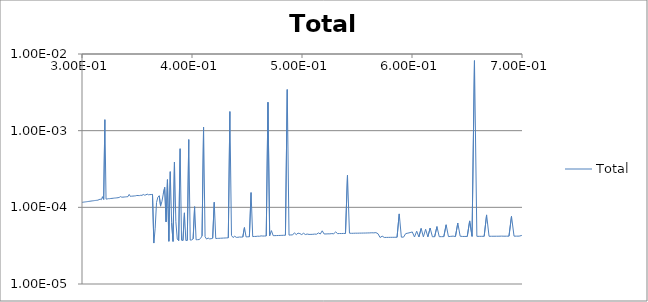
| Category | Total |
|---|---|
| 29929300.0 | 0 |
| 29829700.0 | 0 |
| 29730400.0 | 0 |
| 29631500.0 | 0 |
| 29532900.0 | 0 |
| 29434700.0 | 0 |
| 29336700.0 | 0 |
| 29239100.0 | 0 |
| 29141800.0 | 0 |
| 29044800.0 | 0 |
| 28948200.0 | 0 |
| 28851900.0 | 0 |
| 28755900.0 | 0 |
| 28660200.0 | 0 |
| 28564800.0 | 0 |
| 28469800.0 | 0 |
| 28375000.0 | 0 |
| 28280600.0 | 0 |
| 28186500.0 | 0 |
| 28092700.0 | 0 |
| 27999300.0 | 0 |
| 27906100.0 | 0 |
| 27813200.0 | 0 |
| 27720700.0 | 0 |
| 27628500.0 | 0 |
| 27536500.0 | 0 |
| 27444900.0 | 0 |
| 27353600.0 | 0 |
| 27262600.0 | 0 |
| 27171800.0 | 0 |
| 27081400.0 | 0 |
| 26991300.0 | 0 |
| 26901500.0 | 0 |
| 26812000.0 | 0 |
| 26722800.0 | 0 |
| 26633900.0 | 0 |
| 26545200.0 | 0 |
| 26456900.0 | 0 |
| 26368900.0 | 0 |
| 26281100.0 | 0 |
| 26193700.0 | 0 |
| 26106500.0 | 0 |
| 26019700.0 | 0 |
| 25933100.0 | 0 |
| 25846800.0 | 0 |
| 25760800.0 | 0 |
| 25675100.0 | 0 |
| 25589600.0 | 0 |
| 25504500.0 | 0 |
| 25419600.0 | 0 |
| 25335100.0 | 0 |
| 25250800.0 | 0 |
| 25166700.0 | 0 |
| 25083000.0 | 0 |
| 24999500.0 | 0 |
| 24916300.0 | 0 |
| 24833400.0 | 0 |
| 24750800.0 | 0 |
| 24668500.0 | 0 |
| 24586400.0 | 0 |
| 24504600.0 | 0 |
| 24423000.0 | 0 |
| 24341800.0 | 0 |
| 24260800.0 | 0 |
| 24180000.0 | 0 |
| 24099600.0 | 0 |
| 24019400.0 | 0 |
| 23939500.0 | 0 |
| 23859800.0 | 0 |
| 23780400.0 | 0 |
| 23701300.0 | 0 |
| 23622400.0 | 0 |
| 23543800.0 | 0 |
| 23465500.0 | 0 |
| 23387400.0 | 0 |
| 23309600.0 | 0 |
| 23232000.0 | 0 |
| 23154700.0 | 0 |
| 23077700.0 | 0 |
| 23000900.0 | 0 |
| 22924400.0 | 0 |
| 22848100.0 | 0 |
| 22772000.0 | 0 |
| 22696300.0 | 0 |
| 22620800.0 | 0 |
| 22545500.0 | 0 |
| 22470500.0 | 0 |
| 22395700.0 | 0 |
| 22321200.0 | 0 |
| 22246900.0 | 0 |
| 22172900.0 | 0 |
| 22099100.0 | 0 |
| 22025600.0 | 0 |
| 21952300.0 | 0 |
| 21879200.0 | 0 |
| 21806400.0 | 0 |
| 21733900.0 | 0 |
| 21661600.0 | 0 |
| 21589500.0 | 0 |
| 21517600.0 | 0 |
| 21446000.0 | 0 |
| 21374700.0 | 0 |
| 21303600.0 | 0 |
| 21232700.0 | 0 |
| 21162000.0 | 0 |
| 21091600.0 | 0 |
| 21021400.0 | 0 |
| 20951500.0 | 0 |
| 20881800.0 | 0 |
| 20812300.0 | 0 |
| 20743000.0 | 0 |
| 20674000.0 | 0 |
| 20605200.0 | 0 |
| 20536700.0 | 0 |
| 20468300.0 | 0 |
| 20400200.0 | 0 |
| 20332300.0 | 0 |
| 20264700.0 | 0 |
| 20197300.0 | 0 |
| 20130100.0 | 0 |
| 20063100.0 | 0 |
| 19996300.0 | 0 |
| 19929800.0 | 0 |
| 19863500.0 | 0 |
| 19797400.0 | 0 |
| 19731500.0 | 0 |
| 19665800.0 | 0 |
| 19600400.0 | 0 |
| 19535200.0 | 0 |
| 19470200.0 | 0 |
| 19405400.0 | 0 |
| 19340800.0 | 0 |
| 19276500.0 | 0 |
| 19212300.0 | 0 |
| 19148400.0 | 0 |
| 19084700.0 | 0 |
| 19021200.0 | 0 |
| 18957900.0 | 0 |
| 18894800.0 | 0 |
| 18831900.0 | 0 |
| 18769300.0 | 0 |
| 18706800.0 | 0 |
| 18644600.0 | 0 |
| 18582500.0 | 0 |
| 18520700.0 | 0 |
| 18459100.0 | 0 |
| 18397700.0 | 0 |
| 18336400.0 | 0 |
| 18275400.0 | 0 |
| 18214600.0 | 0 |
| 18154000.0 | 0 |
| 18093600.0 | 0 |
| 18033400.0 | 0 |
| 17973400.0 | 0 |
| 17913600.0 | 0 |
| 17854000.0 | 0 |
| 17794600.0 | 0 |
| 17735400.0 | 0 |
| 17676400.0 | 0 |
| 17617500.0 | 0 |
| 17558900.0 | 0 |
| 17500500.0 | 0 |
| 17442300.0 | 0 |
| 17384200.0 | 0 |
| 17326400.0 | 0 |
| 17268700.0 | 0 |
| 17211300.0 | 0 |
| 17154000.0 | 0 |
| 17096900.0 | 0 |
| 17040000.0 | 0 |
| 16983300.0 | 0 |
| 16926800.0 | 0 |
| 16870500.0 | 0 |
| 16814400.0 | 0 |
| 16758400.0 | 0 |
| 16702700.0 | 0 |
| 16647100.0 | 0 |
| 16591700.0 | 0 |
| 16536500.0 | 0 |
| 16481500.0 | 0 |
| 16426600.0 | 0 |
| 16372000.0 | 0 |
| 16317500.0 | 0 |
| 16263200.0 | 0 |
| 16209100.0 | 0 |
| 16155100.0 | 0 |
| 16101400.0 | 0 |
| 16047800.0 | 0 |
| 15994400.0 | 0 |
| 15941200.0 | 0 |
| 15888100.0 | 0 |
| 15835300.0 | 0 |
| 15782600.0 | 0 |
| 15730100.0 | 0 |
| 15677700.0 | 0 |
| 15625600.0 | 0 |
| 15573600.0 | 0 |
| 15521700.0 | 0 |
| 15470100.0 | 0 |
| 15418600.0 | 0 |
| 15367300.0 | 0 |
| 15316200.0 | 0 |
| 15265200.0 | 0 |
| 15214400.0 | 0 |
| 15163800.0 | 0 |
| 15113300.0 | 0 |
| 15063100.0 | 0 |
| 15012900.0 | 0 |
| 14963000.0 | 0 |
| 14913200.0 | 0 |
| 14863600.0 | 0 |
| 14814100.0 | 0 |
| 14764800.0 | 0 |
| 14715700.0 | 0 |
| 14666700.0 | 0 |
| 14617900.0 | 0 |
| 14569300.0 | 0 |
| 14520800.0 | 0 |
| 14472500.0 | 0 |
| 14424300.0 | 0 |
| 14376300.0 | 0 |
| 14328500.0 | 0 |
| 14280800.0 | 0 |
| 14233300.0 | 0 |
| 14185900.0 | 0 |
| 14138700.0 | 0 |
| 14091700.0 | 0 |
| 14044800.0 | 0 |
| 13998100.0 | 0 |
| 13951500.0 | 0 |
| 13905100.0 | 0 |
| 13858800.0 | 0 |
| 13812700.0 | 0 |
| 13766700.0 | 0 |
| 13720900.0 | 0 |
| 13675300.0 | 0 |
| 13629800.0 | 0 |
| 13584400.0 | 0 |
| 13539200.0 | 0 |
| 13494200.0 | 0 |
| 13449300.0 | 0 |
| 13404500.0 | 0 |
| 13359900.0 | 0 |
| 13315500.0 | 0 |
| 13271200.0 | 0 |
| 13227000.0 | 0 |
| 13183000.0 | 0 |
| 13139100.0 | 0 |
| 13095400.0 | 0 |
| 13051800.0 | 0 |
| 13008400.0 | 0 |
| 12965100.0 | 0 |
| 12922000.0 | 0 |
| 12879000.0 | 0 |
| 12836100.0 | 0 |
| 12793400.0 | 0 |
| 12750800.0 | 0 |
| 12708400.0 | 0 |
| 12666100.0 | 0 |
| 12624000.0 | 0 |
| 12582000.0 | 0 |
| 12540100.0 | 0 |
| 12498400.0 | 0 |
| 12456800.0 | 0 |
| 12415300.0 | 0 |
| 12374000.0 | 0 |
| 12332900.0 | 0 |
| 12291800.0 | 0 |
| 12250900.0 | 0 |
| 12210200.0 | 0 |
| 12169500.0 | 0 |
| 12129000.0 | 0 |
| 12088700.0 | 0 |
| 12048500.0 | 0 |
| 12008400.0 | 0 |
| 11968400.0 | 0 |
| 11928600.0 | 0 |
| 11888900.0 | 0 |
| 11849300.0 | 0 |
| 11809900.0 | 0 |
| 11770600.0 | 0 |
| 11731400.0 | 0 |
| 11692400.0 | 0 |
| 11653500.0 | 0 |
| 11614700.0 | 0 |
| 11576100.0 | 0 |
| 11537600.0 | 0 |
| 11499200.0 | 0 |
| 11460900.0 | 0 |
| 11422800.0 | 0 |
| 11384800.0 | 0 |
| 11346900.0 | 0 |
| 11309100.0 | 0 |
| 11271500.0 | 0 |
| 11234000.0 | 0 |
| 11196600.0 | 0 |
| 11159400.0 | 0 |
| 11122200.0 | 0 |
| 11085200.0 | 0 |
| 11048300.0 | 0 |
| 11011600.0 | 0 |
| 10974900.0 | 0 |
| 10938400.0 | 0 |
| 10902000.0 | 0 |
| 10865700.0 | 0 |
| 10829600.0 | 0 |
| 10793500.0 | 0 |
| 10757600.0 | 0 |
| 10721800.0 | 0 |
| 10686200.0 | 0 |
| 10650600.0 | 0 |
| 10615200.0 | 0 |
| 10579800.0 | 0 |
| 10544600.0 | 0 |
| 10509600.0 | 0 |
| 10474600.0 | 0 |
| 10439700.0 | 0 |
| 10405000.0 | 0 |
| 10370400.0 | 0 |
| 10335900.0 | 0 |
| 10301500.0 | 0 |
| 10267200.0 | 0 |
| 10233000.0 | 0 |
| 10199000.0 | 0 |
| 10165000.0 | 0 |
| 10131200.0 | 0 |
| 10097500.0 | 0 |
| 10063900.0 | 0 |
| 10030400.0 | 0 |
| 9997050.0 | 0 |
| 9963790.0 | 0 |
| 9930630.0 | 0 |
| 9897590.0 | 0 |
| 9864650.0 | 0 |
| 9831830.0 | 0 |
| 9799120.0 | 0 |
| 9766510.0 | 0 |
| 9734010.0 | 0 |
| 9701620.0 | 0 |
| 9669340.0 | 0 |
| 9637170.0 | 0 |
| 9605100.0 | 0 |
| 9573140.0 | 0 |
| 9541290.0 | 0 |
| 9509540.0 | 0 |
| 9477900.0 | 0 |
| 9446360.0 | 0 |
| 9414930.0 | 0 |
| 9383600.0 | 0 |
| 9352380.0 | 0 |
| 9321260.0 | 0 |
| 9290240.0 | 0 |
| 9259330.0 | 0 |
| 9228520.0 | 0 |
| 9197810.0 | 0 |
| 9167210.0 | 0 |
| 9136700.0 | 0 |
| 9106300.0 | 0 |
| 9076000.0 | 0 |
| 9045800.0 | 0 |
| 9015700.0 | 0 |
| 8985700.0 | 0 |
| 8955810.0 | 0 |
| 8926010.0 | 0 |
| 8896300.0 | 0 |
| 8866700.0 | 0 |
| 8837200.0 | 0 |
| 8807790.0 | 0 |
| 8778490.0 | 0 |
| 8749280.0 | 0 |
| 8720160.0 | 0 |
| 8691150.0 | 0 |
| 8662230.0 | 0 |
| 8633410.0 | 0 |
| 8604680.0 | 0 |
| 8576050.0 | 0 |
| 8547510.0 | 0 |
| 8519070.0 | 0 |
| 8490720.0 | 0 |
| 8462470.0 | 0 |
| 8434310.0 | 0 |
| 8406250.0 | 0 |
| 8378280.0 | 0 |
| 8350400.0 | 0 |
| 8322620.0 | 0 |
| 8294920.0 | 0 |
| 8267320.0 | 0 |
| 8239810.0 | 0 |
| 8212400.0 | 0 |
| 8185070.0 | 0 |
| 8157830.0 | 0 |
| 8130690.0 | 0 |
| 8103640.0 | 0 |
| 8076670.0 | 0 |
| 8049800.0 | 0 |
| 8023010.0 | 0 |
| 7996320.0 | 0 |
| 7969710.0 | 0 |
| 7943190.0 | 0 |
| 7916760.0 | 0 |
| 7890420.0 | 0 |
| 7864160.0 | 0 |
| 7838000.0 | 0 |
| 7811910.0 | 0 |
| 7785920.0 | 0 |
| 7760010.0 | 0 |
| 7734190.0 | 0 |
| 7708460.0 | 0 |
| 7682810.0 | 0 |
| 7657250.0 | 0 |
| 7631770.0 | 0 |
| 7606370.0 | 0 |
| 7581060.0 | 0 |
| 7555840.0 | 0 |
| 7530700.0 | 0 |
| 7505640.0 | 0 |
| 7480660.0 | 0 |
| 7455770.0 | 0 |
| 7430960.0 | 0 |
| 7406240.0 | 0 |
| 7381590.0 | 0 |
| 7357030.0 | 0 |
| 7332550.0 | 0 |
| 7308150.0 | 0 |
| 7283840.0 | 0 |
| 7259600.0 | 0 |
| 7235440.0 | 0 |
| 7211370.0 | 0 |
| 7187370.0 | 0 |
| 7163460.0 | 0 |
| 7139620.0 | 0 |
| 7115870.0 | 0 |
| 7092190.0 | 0 |
| 7068590.0 | 0 |
| 7045070.0 | 0 |
| 7021630.0 | 0 |
| 6998260.0 | 0 |
| 6974980.0 | 0 |
| 6951770.0 | 0 |
| 6928640.0 | 0 |
| 6905580.0 | 0 |
| 6882600.0 | 0 |
| 6859700.0 | 0 |
| 6836880.0 | 0 |
| 6814130.0 | 0 |
| 6791460.0 | 0 |
| 6768860.0 | 0 |
| 6746330.0 | 0 |
| 6723890.0 | 0 |
| 6701510.0 | 0 |
| 6679220.0 | 0 |
| 6656990.0 | 0 |
| 6634840.0 | 0 |
| 6612760.0 | 0 |
| 6590760.0 | 0 |
| 6568830.0 | 0 |
| 6546970.0 | 0 |
| 6525190.0 | 0 |
| 6503480.0 | 0 |
| 6481840.0 | 0 |
| 6460270.0 | 0 |
| 6438770.0 | 0 |
| 6417350.0 | 0 |
| 6395990.0 | 0 |
| 6374710.0 | 0 |
| 6353500.0 | 0 |
| 6332360.0 | 0 |
| 6311290.0 | 0 |
| 6290290.0 | 0 |
| 6269360.0 | 0 |
| 6248500.0 | 0 |
| 6227710.0 | 0 |
| 6206980.0 | 0 |
| 6186330.0 | 0 |
| 6165750.0 | 0 |
| 6145230.0 | 0 |
| 6124780.0 | 0 |
| 6104400.0 | 0 |
| 6084090.0 | 0 |
| 6063850.0 | 0 |
| 6043670.0 | 0 |
| 6023560.0 | 0 |
| 6003520.0 | 0 |
| 5983540.0 | 0 |
| 5963630.0 | 0 |
| 5943790.0 | 0 |
| 5924010.0 | 0 |
| 5904300.0 | 0 |
| 5884650.0 | 0 |
| 5865070.0 | 0 |
| 5845560.0 | 0 |
| 5826100.0 | 0 |
| 5806720.0 | 0 |
| 5787400.0 | 0 |
| 5768140.0 | 0 |
| 5748950.0 | 0 |
| 5729820.0 | 0 |
| 5710750.0 | 0 |
| 5691750.0 | 0 |
| 5672810.0 | 0 |
| 5653940.0 | 0 |
| 5635120.0 | 0 |
| 5616370.0 | 0 |
| 5597680.0 | 0 |
| 5579060.0 | 0 |
| 5560490.0 | 0 |
| 5541990.0 | 0 |
| 5523550.0 | 0 |
| 5505170.0 | 0 |
| 5486850.0 | 0 |
| 5468600.0 | 0 |
| 5450400.0 | 0 |
| 5432270.0 | 0 |
| 5414190.0 | 0 |
| 5396180.0 | 0 |
| 5378220.0 | 0 |
| 5360320.0 | 0 |
| 5342490.0 | 0 |
| 5324710.0 | 0 |
| 5306990.0 | 0 |
| 5289340.0 | 0 |
| 5271730.0 | 0 |
| 5254190.0 | 0 |
| 5236710.0 | 0 |
| 5219290.0 | 0 |
| 5201920.0 | 0 |
| 5184610.0 | 0 |
| 5167360.0 | 0 |
| 5150170.0 | 0 |
| 5133030.0 | 0 |
| 5115950.0 | 0 |
| 5098930.0 | 0 |
| 5081960.0 | 0 |
| 5065050.0 | 0 |
| 5048200.0 | 0 |
| 5031400.0 | 0 |
| 5014660.0 | 0 |
| 4997970.0 | 0 |
| 4981340.0 | 0 |
| 4964770.0 | 0 |
| 4948250.0 | 0 |
| 4931780.0 | 0 |
| 4915370.0 | 0 |
| 4899010.0 | 0 |
| 4882710.0 | 0 |
| 4866470.0 | 0 |
| 4850270.0 | 0 |
| 4834140.0 | 0 |
| 4818050.0 | 0 |
| 4802020.0 | 0 |
| 4786040.0 | 0 |
| 4770120.0 | 0 |
| 4754240.0 | 0 |
| 4738420.0 | 0 |
| 4722660.0 | 0 |
| 4706940.0 | 0 |
| 4691280.0 | 0 |
| 4675670.0 | 0 |
| 4660110.0 | 0 |
| 4644610.0 | 0 |
| 4629150.0 | 0 |
| 4613750.0 | 0 |
| 4598400.0 | 0 |
| 4583100.0 | 0 |
| 4567850.0 | 0 |
| 4552650.0 | 0 |
| 4537500.0 | 0 |
| 4522400.0 | 0 |
| 4507350.0 | 0 |
| 4492350.0 | 0 |
| 4477410.0 | 0 |
| 4462510.0 | 0 |
| 4447660.0 | 0 |
| 4432860.0 | 0 |
| 4418110.0 | 0 |
| 4403410.0 | 0 |
| 4388760.0 | 0 |
| 4374150.0 | 0 |
| 4359600.0 | 0 |
| 4345090.0 | 0 |
| 4330640.0 | 0 |
| 4316230.0 | 0 |
| 4301860.0 | 0 |
| 4287550.0 | 0 |
| 4273280.0 | 0 |
| 4259060.0 | 0 |
| 4244890.0 | 0 |
| 4230770.0 | 0 |
| 4216690.0 | 0 |
| 4202660.0 | 0 |
| 4188680.0 | 0 |
| 4174740.0 | 0 |
| 4160850.0 | 0 |
| 4147000.0 | 0 |
| 4133200.0 | 0 |
| 4119450.0 | 0 |
| 4105740.0 | 0 |
| 4092080.0 | 0 |
| 4078470.0 | 0 |
| 4064890.0 | 0 |
| 4051370.0 | 0 |
| 4037890.0 | 0 |
| 4024450.0 | 0 |
| 4011060.0 | 0 |
| 3997720.0 | 0 |
| 3984410.0 | 0 |
| 3971160.0 | 0 |
| 3957940.0 | 0 |
| 3944770.0 | 0 |
| 3931650.0 | 0 |
| 3918560.0 | 0 |
| 3905520.0 | 0 |
| 3892530.0 | 0 |
| 3879580.0 | 0 |
| 3866670.0 | 0 |
| 3853800.0 | 0 |
| 3840980.0 | 0 |
| 3828200.0 | 0 |
| 3815460.0 | 0 |
| 3802760.0 | 0 |
| 3790110.0 | 0 |
| 3777500.0 | 0 |
| 3764930.0 | 0 |
| 3752400.0 | 0 |
| 3739920.0 | 0 |
| 3727470.0 | 0 |
| 3715070.0 | 0 |
| 3702710.0 | 0 |
| 3690390.0 | 0 |
| 3678110.0 | 0 |
| 3665870.0 | 0 |
| 3653670.0 | 0 |
| 3641510.0 | 0 |
| 3629400.0 | 0 |
| 3617320.0 | 0 |
| 3605290.0 | 0 |
| 3593290.0 | 0 |
| 3581330.0 | 0 |
| 3569420.0 | 0 |
| 3557540.0 | 0 |
| 3545700.0 | 0 |
| 3533900.0 | 0 |
| 3522140.0 | 0 |
| 3510420.0 | 0 |
| 3498740.0 | 0 |
| 3487100.0 | 0 |
| 3475500.0 | 0 |
| 3463930.0 | 0 |
| 3452410.0 | 0 |
| 3440920.0 | 0 |
| 3429470.0 | 0 |
| 3418060.0 | 0 |
| 3406690.0 | 0 |
| 3395350.0 | 0 |
| 3384050.0 | 0 |
| 3372790.0 | 0 |
| 3361570.0 | 0 |
| 3350390.0 | 0 |
| 3339240.0 | 0 |
| 3328130.0 | 0 |
| 3317050.0 | 0 |
| 3306020.0 | 0 |
| 3295010.0 | 0 |
| 3284050.0 | 0 |
| 3273120.0 | 0 |
| 3262230.0 | 0 |
| 3251380.0 | 0 |
| 3240560.0 | 0 |
| 3229780.0 | 0 |
| 3219030.0 | 0 |
| 3208320.0 | 0 |
| 3197640.0 | 0 |
| 3187000.0 | 0 |
| 3176400.0 | 0 |
| 3165830.0 | 0 |
| 3155300.0 | 0 |
| 3144800.0 | 0 |
| 3134330.0 | 0 |
| 3123900.0 | 0 |
| 3113510.0 | 0 |
| 3103150.0 | 0 |
| 3092820.0 | 0 |
| 3082530.0 | 0 |
| 3072270.0 | 0 |
| 3062050.0 | 0 |
| 3051860.0 | 0 |
| 3041710.0 | 0 |
| 3031590.0 | 0 |
| 3021500.0 | 0 |
| 3011450.0 | 0 |
| 3001430.0 | 0 |
| 2991440.0 | 0 |
| 2981480.0 | 0 |
| 2971560.0 | 0 |
| 2961680.0 | 0 |
| 2951820.0 | 0 |
| 2942000.0 | 0 |
| 2932210.0 | 0 |
| 2922450.0 | 0 |
| 2912730.0 | 0 |
| 2903040.0 | 0 |
| 2893380.0 | 0 |
| 2883750.0 | 0 |
| 2874160.0 | 0 |
| 2864590.0 | 0 |
| 2855060.0 | 0 |
| 2845560.0 | 0 |
| 2836090.0 | 0 |
| 2826650.0 | 0 |
| 2817250.0 | 0 |
| 2807870.0 | 0 |
| 2798530.0 | 0 |
| 2789220.0 | 0 |
| 2779940.0 | 0 |
| 2770690.0 | 0 |
| 2761470.0 | 0 |
| 2752280.0 | 0 |
| 2743120.0 | 0 |
| 2734000.0 | 0 |
| 2724900.0 | 0 |
| 2715830.0 | 0 |
| 2706800.0 | 0 |
| 2697790.0 | 0 |
| 2688810.0 | 0 |
| 2679860.0 | 0 |
| 2670950.0 | 0 |
| 2662060.0 | 0 |
| 2653200.0 | 0 |
| 2644370.0 | 0 |
| 2635580.0 | 0 |
| 2626810.0 | 0 |
| 2618070.0 | 0 |
| 2609350.0 | 0 |
| 2600670.0 | 0 |
| 2592020.0 | 0 |
| 2583390.0 | 0 |
| 2574800.0 | 0 |
| 2566230.0 | 0 |
| 2557690.0 | 0 |
| 2549180.0 | 0 |
| 2540700.0 | 0 |
| 2532240.0 | 0 |
| 2523820.0 | 0 |
| 2515420.0 | 0 |
| 2507050.0 | 0 |
| 2498710.0 | 0 |
| 2490390.0 | 0 |
| 2482110.0 | 0 |
| 2473850.0 | 0 |
| 2465620.0 | 0 |
| 2457410.0 | 0 |
| 2449240.0 | 0 |
| 2441090.0 | 0 |
| 2432960.0 | 0 |
| 2424870.0 | 0 |
| 2416800.0 | 0 |
| 2408760.0 | 0 |
| 2400740.0 | 0 |
| 2392750.0 | 0 |
| 2384790.0 | 0 |
| 2376860.0 | 0 |
| 2368950.0 | 0 |
| 2361070.0 | 0 |
| 2353210.0 | 0 |
| 2345380.0 | 0 |
| 2337580.0 | 0 |
| 2329800.0 | 0 |
| 2322050.0 | 0 |
| 2314320.0 | 0 |
| 2306620.0 | 0 |
| 2298940.0 | 0 |
| 2291290.0 | 0 |
| 2283670.0 | 0 |
| 2276070.0 | 0 |
| 2268500.0 | 0 |
| 2260950.0 | 0 |
| 2253430.0 | 0 |
| 2245930.0 | 0 |
| 2238460.0 | 0 |
| 2231010.0 | 0 |
| 2223580.0 | 0 |
| 2216180.0 | 0 |
| 2208810.0 | 0 |
| 2201460.0 | 0 |
| 2194140.0 | 0 |
| 2186830.0 | 0 |
| 2179560.0 | 0 |
| 2172310.0 | 0 |
| 2165080.0 | 0 |
| 2157870.0 | 0 |
| 2150690.0 | 0 |
| 2143540.0 | 0 |
| 2136400.0 | 0 |
| 2129300.0 | 0 |
| 2122210.0 | 0 |
| 2115150.0 | 0 |
| 2108110.0 | 0 |
| 2101100.0 | 0 |
| 2094110.0 | 0 |
| 2087140.0 | 0 |
| 2080190.0 | 0 |
| 2073270.0 | 0 |
| 2066370.0 | 0 |
| 2059500.0 | 0 |
| 2052640.0 | 0 |
| 2045810.0 | 0 |
| 2039010.0 | 0 |
| 2032220.0 | 0 |
| 2025460.0 | 0 |
| 2018720.0 | 0 |
| 2012000.0 | 0 |
| 2005310.0 | 0 |
| 1998640.0 | 0 |
| 1991990.0 | 0 |
| 1985360.0 | 0 |
| 1978750.0 | 0 |
| 1972170.0 | 0 |
| 1965600.0 | 0 |
| 1959060.0 | 0 |
| 1952550.0 | 0 |
| 1946050.0 | 0 |
| 1939570.0 | 0 |
| 1933120.0 | 0 |
| 1926690.0 | 0 |
| 1920280.0 | 0 |
| 1913890.0 | 0 |
| 1907520.0 | 0 |
| 1901170.0 | 0 |
| 1894850.0 | 0 |
| 1888540.0 | 0 |
| 1882260.0 | 0 |
| 1875990.0 | 0 |
| 1869750.0 | 0 |
| 1863530.0 | 0 |
| 1857330.0 | 0 |
| 1851150.0 | 0 |
| 1844990.0 | 0 |
| 1838850.0 | 0 |
| 1832730.0 | 0 |
| 1826630.0 | 0 |
| 1820560.0 | 0 |
| 1814500.0 | 0 |
| 1808460.0 | 0 |
| 1802440.0 | 0 |
| 1796450.0 | 0 |
| 1790470.0 | 0 |
| 1784510.0 | 0 |
| 1778570.0 | 0 |
| 1772650.0 | 0 |
| 1766760.0 | 0 |
| 1760880.0 | 0 |
| 1755020.0 | 0 |
| 1749180.0 | 0 |
| 1743360.0 | 0 |
| 1737560.0 | 0 |
| 1731780.0 | 0 |
| 1726010.0 | 0 |
| 1720270.0 | 0 |
| 1714550.0 | 0 |
| 1708840.0 | 0 |
| 1703150.0 | 0 |
| 1697490.0 | 0 |
| 1691840.0 | 0 |
| 1686210.0 | 0 |
| 1680600.0 | 0 |
| 1675010.0 | 0 |
| 1669430.0 | 0 |
| 1663880.0 | 0 |
| 1658340.0 | 0 |
| 1652820.0 | 0 |
| 1647320.0 | 0 |
| 1641840.0 | 0 |
| 1636380.0 | 0 |
| 1630940.0 | 0 |
| 1625510.0 | 0 |
| 1620100.0 | 0 |
| 1614710.0 | 0 |
| 1609340.0 | 0 |
| 1603980.0 | 0 |
| 1598640.0 | 0 |
| 1593320.0 | 0 |
| 1588020.0 | 0 |
| 1582740.0 | 0 |
| 1577470.0 | 0 |
| 1572220.0 | 0 |
| 1566990.0 | 0 |
| 1561780.0 | 0 |
| 1556580.0 | 0 |
| 1551400.0 | 0 |
| 1546240.0 | 0 |
| 1541100.0 | 0 |
| 1535970.0 | 0 |
| 1530860.0 | 0 |
| 1525760.0 | 0 |
| 1520690.0 | 0 |
| 1515630.0 | 0 |
| 1510580.0 | 0 |
| 1505560.0 | 0 |
| 1500550.0 | 0 |
| 1495550.0 | 0 |
| 1490580.0 | 0 |
| 1485620.0 | 0 |
| 1480670.0 | 0 |
| 1475750.0 | 0 |
| 1470840.0 | 0 |
| 1465940.0 | 0 |
| 1461070.0 | 0 |
| 1456200.0 | 0 |
| 1451360.0 | 0 |
| 1446530.0 | 0 |
| 1441720.0 | 0 |
| 1436920.0 | 0 |
| 1432140.0 | 0 |
| 1427370.0 | 0 |
| 1422620.0 | 0 |
| 1417890.0 | 0 |
| 1413170.0 | 0 |
| 1408470.0 | 0 |
| 1403780.0 | 0 |
| 1399110.0 | 0 |
| 1394460.0 | 0 |
| 1389820.0 | 0 |
| 1385190.0 | 0 |
| 1380580.0 | 0 |
| 1375990.0 | 0 |
| 1371410.0 | 0 |
| 1366850.0 | 0 |
| 1362300.0 | 0 |
| 1357770.0 | 0 |
| 1353250.0 | 0 |
| 1348740.0 | 0 |
| 1344260.0 | 0 |
| 1339780.0 | 0 |
| 1335330.0 | 0 |
| 1330880.0 | 0 |
| 1326450.0 | 0 |
| 1322040.0 | 0 |
| 1317640.0 | 0 |
| 1313260.0 | 0 |
| 1308890.0 | 0 |
| 1304530.0 | 0 |
| 1300190.0 | 0 |
| 1295870.0 | 0 |
| 1291550.0 | 0 |
| 1287260.0 | 0 |
| 1282970.0 | 0 |
| 1278700.0 | 0 |
| 1274450.0 | 0 |
| 1270210.0 | 0 |
| 1265980.0 | 0 |
| 1261770.0 | 0 |
| 1257570.0 | 0 |
| 1253390.0 | 0 |
| 1249220.0 | 0 |
| 1245060.0 | 0 |
| 1240920.0 | 0 |
| 1236790.0 | 0 |
| 1232670.0 | 0 |
| 1228570.0 | 0 |
| 1224480.0 | 0 |
| 1220410.0 | 0 |
| 1216350.0 | 0 |
| 1212300.0 | 0 |
| 1208270.0 | 0 |
| 1204250.0 | 0 |
| 1200240.0 | 0 |
| 1196240.0 | 0 |
| 1192260.0 | 0 |
| 1188300.0 | 0 |
| 1184340.0 | 0 |
| 1180400.0 | 0 |
| 1176470.0 | 0 |
| 1172560.0 | 0 |
| 1168660.0 | 0 |
| 1164770.0 | 0 |
| 1160890.0 | 0 |
| 1157030.0 | 0 |
| 1153180.0 | 0 |
| 1149340.0 | 0 |
| 1145520.0 | 0 |
| 1141710.0 | 0 |
| 1137910.0 | 0 |
| 1134120.0 | 0 |
| 1130350.0 | 0 |
| 1126590.0 | 0 |
| 1122840.0 | 0 |
| 1119100.0 | 0 |
| 1115380.0 | 0 |
| 1111670.0 | 0 |
| 1107970.0 | 0 |
| 1104280.0 | 0 |
| 1100610.0 | 0 |
| 1096950.0 | 0 |
| 1093300.0 | 0 |
| 1089660.0 | 0 |
| 1086030.0 | 0 |
| 1082420.0 | 0 |
| 1078820.0 | 0 |
| 1075230.0 | 0 |
| 1071650.0 | 0 |
| 1068080.0 | 0 |
| 1064530.0 | 0 |
| 1060990.0 | 0 |
| 1057460.0 | 0 |
| 1053940.0 | 0 |
| 1050430.0 | 0 |
| 1046940.0 | 0 |
| 1043450.0 | 0 |
| 1039980.0 | 0 |
| 1036520.0 | 0 |
| 1033070.0 | 0 |
| 1029630.0 | 0 |
| 1026210.0 | 0 |
| 1022790.0 | 0 |
| 1019390.0 | 0 |
| 1016000.0 | 0 |
| 1012620.0 | 0 |
| 1009250.0 | 0 |
| 1005890.0 | 0 |
| 1002540.0 | 0 |
| 999207.0 | 0 |
| 995882.0 | 0 |
| 992569.0 | 0 |
| 989266.0 | 0 |
| 985974.0 | 0 |
| 982694.0 | 0 |
| 979424.0 | 0 |
| 976165.0 | 0 |
| 972917.0 | 0 |
| 969679.0 | 0 |
| 966453.0 | 0 |
| 963237.0 | 0 |
| 960032.0 | 0 |
| 956838.0 | 0 |
| 953654.0 | 0 |
| 950481.0 | 0 |
| 947318.0 | 0 |
| 944166.0 | 0 |
| 941024.0 | 0 |
| 937893.0 | 0 |
| 934772.0 | 0 |
| 931662.0 | 0 |
| 928562.0 | 0 |
| 925472.0 | 0 |
| 922393.0 | 0 |
| 919323.0 | 0 |
| 916264.0 | 0 |
| 913216.0 | 0 |
| 910177.0 | 0 |
| 907148.0 | 0 |
| 904130.0 | 0 |
| 901122.0 | 0 |
| 898123.0 | 0 |
| 895135.0 | 0 |
| 892156.0 | 0 |
| 889188.0 | 0 |
| 886229.0 | 0 |
| 883280.0 | 0 |
| 880341.0 | 0 |
| 877412.0 | 0 |
| 874492.0 | 0 |
| 871582.0 | 0 |
| 868682.0 | 0 |
| 865792.0 | 0 |
| 862911.0 | 0 |
| 860040.0 | 0 |
| 857178.0 | 0 |
| 854326.0 | 0 |
| 851483.0 | 0 |
| 848650.0 | 0 |
| 845826.0 | 0 |
| 843012.0 | 0 |
| 840207.0 | 0 |
| 837411.0 | 0 |
| 834624.0 | 0 |
| 831847.0 | 0 |
| 829079.0 | 0 |
| 826321.0 | 0 |
| 823571.0 | 0 |
| 820831.0 | 0 |
| 818100.0 | 0 |
| 815377.0 | 0 |
| 812664.0 | 0 |
| 809960.0 | 0 |
| 807265.0 | 0 |
| 804579.0 | 0 |
| 801902.0 | 0 |
| 799234.0 | 0 |
| 796574.0 | 0 |
| 793924.0 | 0 |
| 791282.0 | 0 |
| 788649.0 | 0 |
| 786025.0 | 0 |
| 783409.0 | 0 |
| 780803.0 | 0 |
| 778205.0 | 0 |
| 775615.0 | 0 |
| 773034.0 | 0 |
| 770462.0 | 0 |
| 767898.0 | 0 |
| 765343.0 | 0 |
| 762797.0 | 0 |
| 760259.0 | 0 |
| 757729.0 | 0 |
| 755208.0 | 0 |
| 752695.0 | 0 |
| 750190.0 | 0 |
| 747694.0 | 0 |
| 745206.0 | 0 |
| 742726.0 | 0 |
| 740255.0 | 0 |
| 737792.0 | 0 |
| 735337.0 | 0 |
| 732890.0 | 0 |
| 730452.0 | 0 |
| 728021.0 | 0 |
| 725599.0 | 0 |
| 723184.0 | 0 |
| 720778.0 | 0 |
| 718380.0 | 0 |
| 715989.0 | 0 |
| 713607.0 | 0 |
| 711232.0 | 0 |
| 708866.0 | 0 |
| 706507.0 | 0 |
| 704156.0 | 0 |
| 701813.0 | 0 |
| 699478.0 | 0 |
| 697151.0 | 0 |
| 694831.0 | 0 |
| 692519.0 | 0 |
| 690215.0 | 0 |
| 687918.0 | 0 |
| 685629.0 | 0 |
| 683348.0 | 0 |
| 681074.0 | 0 |
| 678807.0 | 0 |
| 676549.0 | 0 |
| 674298.0 | 0 |
| 672054.0 | 0 |
| 669818.0 | 0 |
| 667589.0 | 0 |
| 665368.0 | 0 |
| 663154.0 | 0 |
| 660947.0 | 0 |
| 658748.0 | 0 |
| 656556.0 | 0 |
| 654371.0 | 0 |
| 652194.0 | 0 |
| 650024.0 | 0 |
| 647861.0 | 0 |
| 645705.0 | 0 |
| 643557.0 | 0 |
| 641415.0 | 0 |
| 639281.0 | 0 |
| 637154.0 | 0 |
| 635034.0 | 0 |
| 632921.0 | 0 |
| 630815.0 | 0 |
| 628716.0 | 0 |
| 626624.0 | 0 |
| 624539.0 | 0 |
| 622461.0 | 0 |
| 620389.0 | 0 |
| 618325.0 | 0 |
| 616268.0 | 0 |
| 614217.0 | 0 |
| 612173.0 | 0 |
| 610136.0 | 0 |
| 608106.0 | 0 |
| 606083.0 | 0 |
| 604066.0 | 0 |
| 602056.0 | 0 |
| 600053.0 | 0 |
| 598056.0 | 0 |
| 596066.0 | 0 |
| 594083.0 | 0 |
| 592106.0 | 0 |
| 590136.0 | 0 |
| 588172.0 | 0 |
| 586215.0 | 0 |
| 584265.0 | 0 |
| 582320.0 | 0 |
| 580383.0 | 0 |
| 578452.0 | 0 |
| 576527.0 | 0 |
| 574609.0 | 0 |
| 572697.0 | 0 |
| 570791.0 | 0 |
| 568892.0 | 0 |
| 566999.0 | 0 |
| 565112.0 | 0 |
| 563232.0 | 0 |
| 561358.0 | 0 |
| 559490.0 | 0 |
| 557628.0 | 0 |
| 555773.0 | 0 |
| 553923.0 | 0 |
| 552080.0 | 0 |
| 550243.0 | 0 |
| 548412.0 | 0 |
| 546588.0 | 0 |
| 544769.0 | 0 |
| 542956.0 | 0 |
| 541150.0 | 0 |
| 539349.0 | 0 |
| 537554.0 | 0 |
| 535766.0 | 0 |
| 533983.0 | 0 |
| 532206.0 | 0 |
| 530435.0 | 0 |
| 528670.0 | 0 |
| 526911.0 | 0 |
| 525158.0 | 0 |
| 523410.0 | 0 |
| 521669.0 | 0 |
| 519933.0 | 0 |
| 518203.0 | 0 |
| 516479.0 | 0 |
| 514760.0 | 0 |
| 513047.0 | 0 |
| 511340.0 | 0 |
| 509639.0 | 0 |
| 507943.0 | 0 |
| 506253.0 | 0 |
| 504568.0 | 0 |
| 502889.0 | 0 |
| 501216.0 | 0 |
| 499548.0 | 0 |
| 497886.0 | 0 |
| 496229.0 | 0 |
| 494578.0 | 0 |
| 492933.0 | 0 |
| 491292.0 | 0 |
| 489658.0 | 0 |
| 488028.0 | 0 |
| 486404.0 | 0 |
| 484786.0 | 0 |
| 483173.0 | 0 |
| 481565.0 | 0 |
| 479963.0 | 0 |
| 478366.0 | 0 |
| 476774.0 | 0 |
| 475188.0 | 0 |
| 473606.0 | 0 |
| 472031.0 | 0 |
| 470460.0 | 0 |
| 468895.0 | 0 |
| 467334.0 | 0 |
| 465779.0 | 0 |
| 464229.0 | 0 |
| 462685.0 | 0 |
| 461145.0 | 0 |
| 459611.0 | 0 |
| 458081.0 | 0 |
| 456557.0 | 0 |
| 455038.0 | 0 |
| 453524.0 | 0 |
| 452015.0 | 0 |
| 450511.0 | 0 |
| 449012.0 | 0 |
| 447518.0 | 0 |
| 446029.0 | 0 |
| 444545.0 | 0 |
| 443065.0 | 0 |
| 441591.0 | 0 |
| 440122.0 | 0 |
| 438657.0 | 0 |
| 437198.0 | 0 |
| 435743.0 | 0 |
| 434293.0 | 0 |
| 432848.0 | 0 |
| 431408.0 | 0 |
| 429972.0 | 0 |
| 428542.0 | 0 |
| 427116.0 | 0 |
| 425694.0 | 0 |
| 424278.0 | 0 |
| 422866.0 | 0 |
| 421459.0 | 0 |
| 420057.0 | 0 |
| 418659.0 | 0 |
| 417266.0 | 0 |
| 415878.0 | 0 |
| 414494.0 | 0 |
| 413115.0 | 0 |
| 411740.0 | 0 |
| 410370.0 | 0 |
| 409004.0 | 0 |
| 407644.0 | 0 |
| 406287.0 | 0 |
| 404935.0 | 0 |
| 403588.0 | 0 |
| 402245.0 | 0 |
| 400906.0 | 0 |
| 399573.0 | 0 |
| 398243.0 | 0 |
| 396918.0 | 0 |
| 395597.0 | 0 |
| 394281.0 | 0 |
| 392969.0 | 0 |
| 391661.0 | 0 |
| 390358.0 | 0 |
| 389059.0 | 0 |
| 387765.0 | 0 |
| 386474.0 | 0 |
| 385188.0 | 0 |
| 383907.0 | 0 |
| 382629.0 | 0 |
| 381356.0 | 0 |
| 380087.0 | 0 |
| 378822.0 | 0 |
| 377562.0 | 0 |
| 376306.0 | 0 |
| 375054.0 | 0 |
| 373806.0 | 0 |
| 372562.0 | 0 |
| 371322.0 | 0 |
| 370087.0 | 0 |
| 368855.0 | 0 |
| 367628.0 | 0 |
| 366405.0 | 0 |
| 365185.0 | 0 |
| 363970.0 | 0 |
| 362759.0 | 0 |
| 361552.0 | 0 |
| 360349.0 | 0 |
| 359150.0 | 0 |
| 357955.0 | 0 |
| 356764.0 | 0 |
| 355577.0 | 0 |
| 354394.0 | 0 |
| 353214.0 | 0 |
| 352039.0 | 0 |
| 350868.0 | 0 |
| 349700.0 | 0 |
| 348537.0 | 0 |
| 347377.0 | 0 |
| 346221.0 | 0 |
| 345069.0 | 0 |
| 343921.0 | 0 |
| 342776.0 | 0 |
| 341636.0 | 0 |
| 340499.0 | 0 |
| 339366.0 | 0 |
| 338237.0 | 0 |
| 337111.0 | 0 |
| 335990.0 | 0 |
| 334872.0 | 0 |
| 333758.0 | 0 |
| 332647.0 | 0 |
| 331540.0 | 0 |
| 330437.0 | 0 |
| 329337.0 | 0 |
| 328242.0 | 0 |
| 327149.0 | 0 |
| 326061.0 | 0 |
| 324976.0 | 0 |
| 323895.0 | 0 |
| 322817.0 | 0 |
| 321743.0 | 0 |
| 320672.0 | 0 |
| 319605.0 | 0 |
| 318542.0 | 0 |
| 317482.0 | 0 |
| 316425.0 | 0 |
| 315372.0 | 0 |
| 314323.0 | 0 |
| 313277.0 | 0 |
| 312235.0 | 0 |
| 311196.0 | 0 |
| 310160.0 | 0 |
| 309128.0 | 0 |
| 308100.0 | 0 |
| 307075.0 | 0 |
| 306053.0 | 0 |
| 305034.0 | 0 |
| 304019.0 | 0 |
| 303008.0 | 0 |
| 302000.0 | 0 |
| 300995.0 | 0 |
| 299993.0 | 0 |
| 298995.0 | 0 |
| 298000.0 | 0 |
| 297009.0 | 0 |
| 296020.0 | 0 |
| 295035.0 | 0 |
| 294054.0 | 0 |
| 293075.0 | 0 |
| 292100.0 | 0 |
| 291128.0 | 0 |
| 290159.0 | 0 |
| 289194.0 | 0 |
| 288232.0 | 0 |
| 287272.0 | 0 |
| 286317.0 | 0 |
| 285364.0 | 0 |
| 284414.0 | 0 |
| 283468.0 | 0 |
| 282525.0 | 0 |
| 281585.0 | 0 |
| 280648.0 | 0 |
| 279714.0 | 0 |
| 278783.0 | 0 |
| 277856.0 | 0 |
| 276931.0 | 0 |
| 276010.0 | 0 |
| 275091.0 | 0 |
| 274176.0 | 0 |
| 273264.0 | 0 |
| 272354.0 | 0 |
| 271448.0 | 0 |
| 270545.0 | 0 |
| 269645.0 | 0 |
| 268747.0 | 0 |
| 267853.0 | 0 |
| 266962.0 | 0 |
| 266074.0 | 0 |
| 265188.0 | 0 |
| 264306.0 | 0 |
| 263426.0 | 0 |
| 262550.0 | 0 |
| 261676.0 | 0 |
| 260806.0 | 0 |
| 259938.0 | 0 |
| 259073.0 | 0 |
| 258211.0 | 0 |
| 257352.0 | 0 |
| 256495.0 | 0 |
| 255642.0 | 0 |
| 254791.0 | 0 |
| 253943.0 | 0 |
| 253098.0 | 0 |
| 252256.0 | 0 |
| 251417.0 | 0 |
| 250580.0 | 0 |
| 249746.0 | 0 |
| 248915.0 | 0 |
| 248087.0 | 0 |
| 247262.0 | 0 |
| 246439.0 | 0 |
| 245619.0 | 0 |
| 244802.0 | 0 |
| 243987.0 | 0 |
| 243175.0 | 0 |
| 242366.0 | 0 |
| 241560.0 | 0 |
| 240756.0 | 0 |
| 239955.0 | 0 |
| 239156.0 | 0 |
| 238361.0 | 0 |
| 237567.0 | 0 |
| 236777.0 | 0 |
| 235989.0 | 0 |
| 235204.0 | 0 |
| 234421.0 | 0 |
| 233641.0 | 0 |
| 232864.0 | 0 |
| 232089.0 | 0 |
| 231317.0 | 0 |
| 230547.0 | 0 |
| 229780.0 | 0 |
| 229015.0 | 0 |
| 228253.0 | 0 |
| 227494.0 | 0 |
| 226737.0 | 0 |
| 225982.0 | 0 |
| 225230.0 | 0 |
| 224481.0 | 0 |
| 223734.0 | 0 |
| 222990.0 | 0 |
| 222248.0 | 0 |
| 221508.0 | 0 |
| 220771.0 | 0 |
| 220036.0 | 0 |
| 219304.0 | 0 |
| 218575.0 | 0 |
| 217847.0 | 0 |
| 217122.0 | 0 |
| 216400.0 | 0 |
| 215680.0 | 0 |
| 214962.0 | 0 |
| 214247.0 | 0 |
| 213534.0 | 0 |
| 212824.0 | 0 |
| 212115.0 | 0 |
| 211410.0 | 0 |
| 210706.0 | 0 |
| 210005.0 | 0 |
| 209306.0 | 0 |
| 208610.0 | 0 |
| 207916.0 | 0 |
| 207224.0 | 0 |
| 206534.0 | 0 |
| 205847.0 | 0 |
| 205162.0 | 0 |
| 204480.0 | 0 |
| 203799.0 | 0 |
| 203121.0 | 0 |
| 202445.0 | 0 |
| 201772.0 | 0 |
| 201100.0 | 0 |
| 200431.0 | 0 |
| 199764.0 | 0 |
| 199099.0 | 0 |
| 198437.0 | 0 |
| 197777.0 | 0 |
| 197119.0 | 0 |
| 196463.0 | 0 |
| 195809.0 | 0 |
| 195157.0 | 0 |
| 194508.0 | 0 |
| 193861.0 | 0 |
| 193216.0 | 0 |
| 192573.0 | 0 |
| 191932.0 | 0 |
| 191293.0 | 0 |
| 190657.0 | 0 |
| 190023.0 | 0 |
| 189390.0 | 0 |
| 188760.0 | 0 |
| 188132.0 | 0 |
| 187506.0 | 0 |
| 186882.0 | 0 |
| 186260.0 | 0 |
| 185640.0 | 0 |
| 185023.0 | 0 |
| 184407.0 | 0 |
| 183794.0 | 0 |
| 183182.0 | 0 |
| 182572.0 | 0 |
| 181965.0 | 0 |
| 181359.0 | 0 |
| 180756.0 | 0 |
| 180155.0 | 0 |
| 179555.0 | 0 |
| 178958.0 | 0 |
| 178362.0 | 0 |
| 177769.0 | 0 |
| 177177.0 | 0 |
| 176588.0 | 0 |
| 176000.0 | 0 |
| 175414.0 | 0 |
| 174831.0 | 0 |
| 174249.0 | 0 |
| 173669.0 | 0 |
| 173091.0 | 0 |
| 172515.0 | 0 |
| 171941.0 | 0 |
| 171369.0 | 0 |
| 170799.0 | 0 |
| 170231.0 | 0 |
| 169664.0 | 0 |
| 169100.0 | 0 |
| 168537.0 | 0 |
| 167976.0 | 0 |
| 167417.0 | 0 |
| 166860.0 | 0 |
| 166305.0 | 0 |
| 165752.0 | 0 |
| 165200.0 | 0 |
| 164650.0 | 0 |
| 164103.0 | 0 |
| 163557.0 | 0 |
| 163012.0 | 0 |
| 162470.0 | 0 |
| 161929.0 | 0 |
| 161391.0 | 0 |
| 160854.0 | 0 |
| 160318.0 | 0 |
| 159785.0 | 0 |
| 159253.0 | 0 |
| 158723.0 | 0 |
| 158195.0 | 0 |
| 157669.0 | 0 |
| 157144.0 | 0 |
| 156621.0 | 0 |
| 156100.0 | 0 |
| 155581.0 | 0 |
| 155063.0 | 0 |
| 154547.0 | 0 |
| 154033.0 | 0 |
| 153520.0 | 0 |
| 153009.0 | 0 |
| 152500.0 | 0 |
| 151993.0 | 0 |
| 151487.0 | 0 |
| 150983.0 | 0 |
| 150481.0 | 0 |
| 149980.0 | 0 |
| 149481.0 | 0 |
| 148984.0 | 0 |
| 148488.0 | 0 |
| 147994.0 | 0 |
| 147501.0 | 0 |
| 147010.0 | 0 |
| 146521.0 | 0 |
| 146034.0 | 0 |
| 145548.0 | 0 |
| 145064.0 | 0 |
| 144581.0 | 0 |
| 144100.0 | 0 |
| 143620.0 | 0 |
| 143142.0 | 0 |
| 142666.0 | 0 |
| 142191.0 | 0 |
| 141718.0 | 0 |
| 141247.0 | 0 |
| 140777.0 | 0 |
| 140308.0 | 0 |
| 139841.0 | 0 |
| 139376.0 | 0 |
| 138912.0 | 0 |
| 138450.0 | 0 |
| 137989.0 | 0 |
| 137530.0 | 0 |
| 137073.0 | 0 |
| 136617.0 | 0 |
| 136162.0 | 0 |
| 135709.0 | 0 |
| 135257.0 | 0 |
| 134807.0 | 0 |
| 134359.0 | 0 |
| 133912.0 | 0 |
| 133466.0 | 0 |
| 133022.0 | 0 |
| 132579.0 | 0 |
| 132138.0 | 0 |
| 131699.0 | 0 |
| 131260.0 | 0 |
| 130824.0 | 0 |
| 130388.0 | 0 |
| 129954.0 | 0 |
| 129522.0 | 0 |
| 129091.0 | 0 |
| 128662.0 | 0 |
| 128233.0 | 0 |
| 127807.0 | 0 |
| 127381.0 | 0 |
| 126958.0 | 0 |
| 126535.0 | 0 |
| 126114.0 | 0 |
| 125694.0 | 0 |
| 125276.0 | 0 |
| 124859.0 | 0 |
| 124444.0 | 0 |
| 124030.0 | 0 |
| 123617.0 | 0 |
| 123206.0 | 0 |
| 122796.0 | 0 |
| 122387.0 | 0 |
| 121980.0 | 0 |
| 121574.0 | 0 |
| 121170.0 | 0 |
| 120766.0 | 0 |
| 120365.0 | 0 |
| 119964.0 | 0 |
| 119565.0 | 0 |
| 119167.0 | 0 |
| 118771.0 | 0 |
| 118375.0 | 0 |
| 117981.0 | 0 |
| 117589.0 | 0 |
| 117198.0 | 0 |
| 116808.0 | 0 |
| 116419.0 | 0 |
| 116032.0 | 0 |
| 115646.0 | 0 |
| 115261.0 | 0 |
| 114877.0 | 0 |
| 114495.0 | 0 |
| 114114.0 | 0 |
| 113734.0 | 0 |
| 113356.0 | 0 |
| 112979.0 | 0 |
| 112603.0 | 0 |
| 112228.0 | 0 |
| 111855.0 | 0 |
| 111482.0 | 0 |
| 111112.0 | 0 |
| 110742.0 | 0 |
| 110373.0 | 0 |
| 110006.0 | 0 |
| 109640.0 | 0 |
| 109275.0 | 0 |
| 108912.0 | 0 |
| 108549.0 | 0 |
| 108188.0 | 0 |
| 107828.0 | 0 |
| 107469.0 | 0 |
| 107112.0 | 0 |
| 106755.0 | 0 |
| 106400.0 | 0 |
| 106046.0 | 0 |
| 105693.0 | 0 |
| 105341.0 | 0 |
| 104991.0 | 0 |
| 104642.0 | 0 |
| 104293.0 | 0 |
| 103946.0 | 0 |
| 103600.0 | 0 |
| 103256.0 | 0 |
| 102912.0 | 0 |
| 102570.0 | 0 |
| 102228.0 | 0 |
| 101888.0 | 0 |
| 101549.0 | 0 |
| 101211.0 | 0 |
| 100875.0 | 0 |
| 100539.0 | 0 |
| 100204.0 | 0 |
| 99871.0 | 0 |
| 99538.7 | 0 |
| 99207.5 | 0 |
| 98877.4 | 0 |
| 98548.4 | 0 |
| 98220.4 | 0 |
| 97893.6 | 0 |
| 97567.9 | 0 |
| 97243.2 | 0 |
| 96919.7 | 0 |
| 96597.2 | 0 |
| 96275.8 | 0 |
| 95955.4 | 0 |
| 95636.1 | 0 |
| 95317.9 | 0 |
| 95000.7 | 0 |
| 94684.6 | 0 |
| 94369.6 | 0 |
| 94055.6 | 0 |
| 93742.6 | 0 |
| 93430.7 | 0 |
| 93119.8 | 0 |
| 92809.9 | 0 |
| 92501.1 | 0 |
| 92193.3 | 0 |
| 91886.6 | 0 |
| 91580.8 | 0 |
| 91276.1 | 0 |
| 90972.4 | 0 |
| 90669.7 | 0 |
| 90368.0 | 0 |
| 90067.3 | 0 |
| 89767.6 | 0 |
| 89468.9 | 0 |
| 89171.2 | 0 |
| 88874.5 | 0 |
| 88578.8 | 0 |
| 88284.0 | 0 |
| 87990.3 | 0 |
| 87697.5 | 0 |
| 87405.7 | 0 |
| 87114.9 | 0 |
| 86825.0 | 0 |
| 86536.1 | 0 |
| 86248.1 | 0 |
| 85961.2 | 0 |
| 85675.1 | 0 |
| 85390.1 | 0 |
| 85105.9 | 0 |
| 84822.7 | 0 |
| 84540.5 | 0 |
| 84259.2 | 0 |
| 83978.8 | 0 |
| 83699.4 | 0 |
| 83420.9 | 0 |
| 83143.3 | 0 |
| 82866.7 | 0 |
| 82590.9 | 0 |
| 82316.1 | 0 |
| 82042.2 | 0 |
| 81769.2 | 0 |
| 81497.1 | 0 |
| 81226.0 | 0 |
| 80955.7 | 0 |
| 80686.3 | 0 |
| 80417.9 | 0 |
| 80150.3 | 0 |
| 79883.6 | 0 |
| 79617.8 | 0 |
| 79352.8 | 0 |
| 79088.8 | 0 |
| 78825.6 | 0 |
| 78563.4 | 0 |
| 78301.9 | 0 |
| 78041.4 | 0 |
| 77781.7 | 0 |
| 77522.9 | 0 |
| 77265.0 | 0 |
| 77007.9 | 0 |
| 76751.6 | 0 |
| 76496.2 | 0 |
| 76241.7 | 0 |
| 75988.0 | 0 |
| 75735.2 | 0 |
| 75483.2 | 0 |
| 75232.0 | 0 |
| 74981.7 | 0 |
| 74732.2 | 0 |
| 74483.5 | 0 |
| 74235.7 | 0 |
| 73988.7 | 0 |
| 73742.5 | 0 |
| 73497.1 | 0 |
| 73252.5 | 0 |
| 73008.8 | 0 |
| 72765.9 | 0 |
| 72523.7 | 0 |
| 72282.4 | 0 |
| 72041.9 | 0 |
| 71802.2 | 0 |
| 71563.3 | 0 |
| 71325.2 | 0 |
| 71087.8 | 0 |
| 70851.3 | 0 |
| 70615.5 | 0 |
| 70380.6 | 0 |
| 70146.4 | 0 |
| 69913.0 | 0 |
| 69680.3 | 0 |
| 69448.5 | 0 |
| 69217.4 | 0 |
| 68987.1 | 0 |
| 68757.5 | 0 |
| 68528.8 | 0 |
| 68300.7 | 0 |
| 68073.5 | 0 |
| 67847.0 | 0 |
| 67621.2 | 0 |
| 67396.2 | 0 |
| 67171.9 | 0 |
| 66948.4 | 0 |
| 66725.7 | 0 |
| 66503.6 | 0 |
| 66282.4 | 0 |
| 66061.8 | 0 |
| 65842.0 | 0 |
| 65622.9 | 0 |
| 65404.6 | 0 |
| 65186.9 | 0 |
| 64970.0 | 0 |
| 64753.8 | 0 |
| 64538.4 | 0 |
| 64323.6 | 0 |
| 64109.6 | 0 |
| 63896.3 | 0 |
| 63683.7 | 0 |
| 63471.8 | 0 |
| 63260.6 | 0 |
| 63050.1 | 0 |
| 62840.3 | 0 |
| 62631.2 | 0 |
| 62422.8 | 0 |
| 62215.1 | 0 |
| 62008.1 | 0 |
| 61801.7 | 0 |
| 61596.1 | 0 |
| 61391.1 | 0 |
| 61186.9 | 0 |
| 60983.3 | 0 |
| 60780.3 | 0 |
| 60578.1 | 0 |
| 60376.5 | 0 |
| 60175.6 | 0 |
| 59975.4 | 0 |
| 59775.8 | 0 |
| 59576.9 | 0 |
| 59378.7 | 0 |
| 59181.1 | 0 |
| 58984.2 | 0 |
| 58787.9 | 0 |
| 58592.3 | 0 |
| 58397.4 | 0 |
| 58203.1 | 0 |
| 58009.4 | 0 |
| 57816.4 | 0 |
| 57624.0 | 0 |
| 57432.3 | 0 |
| 57241.2 | 0 |
| 57050.7 | 0 |
| 56860.9 | 0 |
| 56671.7 | 0 |
| 56483.1 | 0 |
| 56295.1 | 0 |
| 56107.8 | 0 |
| 55921.1 | 0 |
| 55735.1 | 0 |
| 55549.6 | 0 |
| 55364.8 | 0 |
| 55180.5 | 0 |
| 54996.9 | 0 |
| 54813.9 | 0 |
| 54631.5 | 0 |
| 54449.8 | 0 |
| 54268.6 | 0 |
| 54088.0 | 0 |
| 53908.0 | 0 |
| 53728.7 | 0 |
| 53549.9 | 0 |
| 53371.7 | 0 |
| 53194.1 | 0 |
| 53017.1 | 0 |
| 52840.7 | 0 |
| 52664.9 | 0 |
| 52489.6 | 0 |
| 52315.0 | 0 |
| 52140.9 | 0 |
| 51967.4 | 0 |
| 51794.5 | 0 |
| 51622.2 | 0 |
| 51450.4 | 0 |
| 51279.2 | 0 |
| 51108.6 | 0 |
| 50938.5 | 0 |
| 50769.0 | 0 |
| 50600.1 | 0 |
| 50431.7 | 0 |
| 50263.9 | 0 |
| 50096.7 | 0 |
| 49930.0 | 0 |
| 49763.8 | 0 |
| 49598.2 | 0 |
| 49433.2 | 0 |
| 49268.7 | 0 |
| 49104.8 | 0 |
| 48941.4 | 0 |
| 48778.5 | 0 |
| 48616.2 | 0 |
| 48454.5 | 0 |
| 48293.2 | 0 |
| 48132.5 | 0 |
| 47972.4 | 0 |
| 47812.8 | 0 |
| 47653.7 | 0 |
| 47495.1 | 0 |
| 47337.1 | 0 |
| 47179.6 | 0 |
| 47022.6 | 0 |
| 46866.1 | 0 |
| 46710.2 | 0 |
| 46554.7 | 0 |
| 46399.8 | 0 |
| 46245.4 | 0 |
| 46091.6 | 0 |
| 45938.2 | 0 |
| 45785.3 | 0 |
| 45633.0 | 0 |
| 45481.2 | 0 |
| 45329.8 | 0 |
| 45179.0 | 0 |
| 45028.7 | 0 |
| 44878.8 | 0 |
| 44729.5 | 0 |
| 44580.7 | 0 |
| 44432.3 | 0 |
| 44284.5 | 0 |
| 44137.1 | 0 |
| 43990.3 | 0 |
| 43843.9 | 0 |
| 43698.0 | 0 |
| 43552.6 | 0 |
| 43407.7 | 0 |
| 43263.2 | 0 |
| 43119.3 | 0 |
| 42975.8 | 0 |
| 42832.8 | 0 |
| 42690.3 | 0 |
| 42548.2 | 0 |
| 42406.7 | 0 |
| 42265.6 | 0 |
| 42124.9 | 0 |
| 41984.8 | 0 |
| 41845.1 | 0 |
| 41705.8 | 0 |
| 41567.1 | 0 |
| 41428.7 | 0 |
| 41290.9 | 0 |
| 41153.5 | 0 |
| 41016.6 | 0 |
| 40880.1 | 0 |
| 40744.1 | 0 |
| 40608.5 | 0 |
| 40473.4 | 0 |
| 40338.7 | 0 |
| 40204.5 | 0 |
| 40070.7 | 0 |
| 39937.4 | 0 |
| 39804.5 | 0 |
| 39672.0 | 0 |
| 39540.0 | 0 |
| 39408.5 | 0 |
| 39277.3 | 0 |
| 39146.6 | 0 |
| 39016.4 | 0 |
| 38886.6 | 0 |
| 38757.2 | 0 |
| 38628.2 | 0 |
| 38499.7 | 0 |
| 38371.6 | 0 |
| 38243.9 | 0 |
| 38116.6 | 0 |
| 37989.8 | 0 |
| 37863.4 | 0 |
| 37737.4 | 0 |
| 37611.8 | 0 |
| 37486.7 | 0 |
| 37361.9 | 0 |
| 37237.6 | 0 |
| 37113.7 | 0 |
| 36990.2 | 0 |
| 36867.1 | 0 |
| 36744.5 | 0 |
| 36622.2 | 0 |
| 36500.4 | 0 |
| 36378.9 | 0 |
| 36257.9 | 0 |
| 36137.2 | 0 |
| 36017.0 | 0 |
| 35897.1 | 0 |
| 35777.7 | 0 |
| 35658.6 | 0 |
| 35540.0 | 0 |
| 35421.7 | 0 |
| 35303.9 | 0 |
| 35186.4 | 0 |
| 35069.3 | 0 |
| 34952.6 | 0 |
| 34836.3 | 0 |
| 34720.4 | 0 |
| 34604.9 | 0 |
| 34489.7 | 0 |
| 34375.0 | 0 |
| 34260.6 | 0 |
| 34146.6 | 0 |
| 34033.0 | 0 |
| 33919.7 | 0 |
| 33806.9 | 0 |
| 33694.4 | 0 |
| 33582.3 | 0 |
| 33470.5 | 0 |
| 33359.1 | 0 |
| 33248.1 | 0 |
| 33137.5 | 0 |
| 33027.2 | 0 |
| 32917.4 | 0 |
| 32807.8 | 0 |
| 32698.7 | 0 |
| 32589.9 | 0 |
| 32481.4 | 0 |
| 32373.3 | 0 |
| 32265.6 | 0 |
| 32158.3 | 0 |
| 32051.2 | 0 |
| 31944.6 | 0 |
| 31838.3 | 0 |
| 31732.4 | 0 |
| 31626.8 | 0 |
| 31521.5 | 0 |
| 31416.7 | 0 |
| 31312.1 | 0 |
| 31207.9 | 0 |
| 31104.1 | 0 |
| 31000.6 | 0 |
| 30897.4 | 0 |
| 30794.6 | 0 |
| 30692.2 | 0 |
| 30590.0 | 0 |
| 30488.3 | 0 |
| 30386.8 | 0 |
| 30285.7 | 0 |
| 30184.9 | 0 |
| 30084.5 | 0 |
| 29984.4 | 0 |
| 29884.6 | 0 |
| 29785.2 | 0 |
| 29686.1 | 0 |
| 29587.3 | 0 |
| 29488.8 | 0 |
| 29390.7 | 0 |
| 29292.9 | 0 |
| 29195.5 | 0 |
| 29098.3 | 0 |
| 29001.5 | 0 |
| 28905.0 | 0 |
| 28808.8 | 0 |
| 28712.9 | 0 |
| 28617.4 | 0 |
| 28522.2 | 0 |
| 28427.3 | 0 |
| 28332.7 | 0 |
| 28238.4 | 0 |
| 28144.5 | 0 |
| 28050.8 | 0 |
| 27957.5 | 0 |
| 27864.4 | 0 |
| 27771.7 | 0 |
| 27679.3 | 0 |
| 27587.2 | 0 |
| 27495.4 | 0 |
| 27403.9 | 0 |
| 27312.7 | 0 |
| 27221.9 | 0 |
| 27131.3 | 0 |
| 27041.0 | 0 |
| 26951.0 | 0 |
| 26861.4 | 0 |
| 26772.0 | 0 |
| 26682.9 | 0 |
| 26594.1 | 0 |
| 26505.6 | 0 |
| 26417.4 | 0 |
| 26329.5 | 0 |
| 26241.9 | 0 |
| 26154.6 | 0 |
| 26067.6 | 0 |
| 25980.8 | 0 |
| 25894.4 | 0 |
| 25808.2 | 0 |
| 25722.3 | 0 |
| 25636.8 | 0 |
| 25551.5 | 0 |
| 25466.4 | 0 |
| 25381.7 | 0 |
| 25297.2 | 0 |
| 25213.1 | 0 |
| 25129.2 | 0 |
| 25045.6 | 0 |
| 24962.2 | 0 |
| 24879.2 | 0 |
| 24796.4 | 0 |
| 24713.9 | 0 |
| 24631.6 | 0 |
| 24549.7 | 0 |
| 24468.0 | 0 |
| 24386.6 | 0 |
| 24305.4 | 0 |
| 24224.5 | 0 |
| 24143.9 | 0 |
| 24063.6 | 0 |
| 23983.5 | 0 |
| 23903.7 | 0 |
| 23824.2 | 0 |
| 23744.9 | 0 |
| 23665.9 | 0 |
| 23587.2 | 0 |
| 23508.7 | 0 |
| 23430.5 | 0 |
| 23352.5 | 0 |
| 23274.8 | 0 |
| 23197.3 | 0 |
| 23120.2 | 0 |
| 23043.2 | 0 |
| 22966.6 | 0 |
| 22890.1 | 0 |
| 22814.0 | 0 |
| 22738.1 | 0 |
| 22662.4 | 0 |
| 22587.0 | 0 |
| 22511.8 | 0 |
| 22436.9 | 0 |
| 22362.3 | 0 |
| 22287.9 | 0 |
| 22213.7 | 0 |
| 22139.8 | 0 |
| 22066.1 | 0 |
| 21992.7 | 0 |
| 21919.5 | 0 |
| 21846.6 | 0 |
| 21773.9 | 0 |
| 21701.4 | 0 |
| 21629.2 | 0 |
| 21557.3 | 0 |
| 21485.5 | 0 |
| 21414.0 | 0 |
| 21342.8 | 0 |
| 21271.8 | 0 |
| 21201.0 | 0 |
| 21130.4 | 0 |
| 21060.1 | 0 |
| 20990.1 | 0 |
| 20920.2 | 0 |
| 20850.6 | 0 |
| 20781.2 | 0 |
| 20712.1 | 0 |
| 20643.2 | 0 |
| 20574.5 | 0 |
| 20506.0 | 0 |
| 20437.8 | 0 |
| 20369.8 | 0 |
| 20302.0 | 0 |
| 20234.4 | 0 |
| 20167.1 | 0 |
| 20100.0 | 0 |
| 20033.1 | 0 |
| 19966.5 | 0 |
| 19900.0 | 0 |
| 19833.8 | 0 |
| 19767.8 | 0 |
| 19702.0 | 0 |
| 19636.5 | 0 |
| 19571.1 | 0 |
| 19506.0 | 0 |
| 19441.1 | 0 |
| 19376.4 | 0 |
| 19312.0 | 0 |
| 19247.7 | 0 |
| 19183.7 | 0 |
| 19119.8 | 0 |
| 19056.2 | 0 |
| 18992.8 | 0 |
| 18929.6 | 0 |
| 18866.6 | 0 |
| 18803.8 | 0 |
| 18741.3 | 0 |
| 18678.9 | 0 |
| 18616.8 | 0 |
| 18554.8 | 0 |
| 18493.1 | 0 |
| 18431.5 | 0 |
| 18370.2 | 0 |
| 18309.1 | 0 |
| 18248.2 | 0 |
| 18187.4 | 0 |
| 18126.9 | 0 |
| 18066.6 | 0 |
| 18006.5 | 0 |
| 17946.6 | 0 |
| 17886.9 | 0 |
| 17827.3 | 0 |
| 17768.0 | 0 |
| 17708.9 | 0 |
| 17650.0 | 0 |
| 17591.2 | 0 |
| 17532.7 | 0 |
| 17474.4 | 0 |
| 17416.2 | 0 |
| 17358.3 | 0 |
| 17300.5 | 0 |
| 17243.0 | 0 |
| 17185.6 | 0 |
| 17128.4 | 0 |
| 17071.4 | 0 |
| 17014.6 | 0 |
| 16958.0 | 0 |
| 16901.6 | 0 |
| 16845.3 | 0 |
| 16789.3 | 0 |
| 16733.4 | 0 |
| 16677.7 | 0 |
| 16622.2 | 0 |
| 16566.9 | 0 |
| 16511.8 | 0 |
| 16456.9 | 0 |
| 16402.1 | 0 |
| 16347.5 | 0 |
| 16293.1 | 0 |
| 16238.9 | 0 |
| 16184.9 | 0 |
| 16131.0 | 0 |
| 16077.3 | 0 |
| 16023.8 | 0 |
| 15970.5 | 0 |
| 15917.4 | 0 |
| 15864.4 | 0 |
| 15811.6 | 0 |
| 15759.0 | 0 |
| 15706.6 | 0 |
| 15654.3 | 0 |
| 15602.2 | 0 |
| 15550.3 | 0 |
| 15498.6 | 0 |
| 15447.0 | 0 |
| 15395.6 | 0 |
| 15344.4 | 0 |
| 15293.3 | 0 |
| 15242.4 | 0 |
| 15191.7 | 0 |
| 15141.2 | 0 |
| 15090.8 | 0 |
| 15040.6 | 0 |
| 14990.5 | 0 |
| 14940.7 | 0 |
| 14890.9 | 0 |
| 14841.4 | 0 |
| 14792.0 | 0 |
| 14742.8 | 0 |
| 14693.7 | 0 |
| 14644.8 | 0 |
| 14596.1 | 0 |
| 14547.5 | 0 |
| 14499.1 | 0 |
| 14450.9 | 0 |
| 14402.8 | 0 |
| 14354.9 | 0 |
| 14307.1 | 0 |
| 14259.5 | 0 |
| 14212.1 | 0 |
| 14164.8 | 0 |
| 14117.6 | 0 |
| 14070.7 | 0 |
| 14023.8 | 0 |
| 13977.2 | 0 |
| 13930.7 | 0 |
| 13884.3 | 0 |
| 13838.1 | 0 |
| 13792.1 | 0 |
| 13746.2 | 0 |
| 13700.4 | 0 |
| 13654.9 | 0 |
| 13609.4 | 0 |
| 13564.1 | 0 |
| 13519.0 | 0 |
| 13474.0 | 0 |
| 13429.2 | 0 |
| 13384.5 | 0 |
| 13340.0 | 0 |
| 13295.6 | 0 |
| 13251.3 | 0 |
| 13207.2 | 0 |
| 13163.3 | 0 |
| 13119.5 | 0 |
| 13075.8 | 0 |
| 13032.3 | 0 |
| 12989.0 | 0 |
| 12945.8 | 0 |
| 12902.7 | 0 |
| 12859.7 | 0 |
| 12817.0 | 0 |
| 12774.3 | 0 |
| 12731.8 | 0 |
| 12689.4 | 0 |
| 12647.2 | 0 |
| 12605.1 | 0 |
| 12563.2 | 0 |
| 12521.4 | 0 |
| 12479.7 | 0 |
| 12438.2 | 0 |
| 12396.8 | 0 |
| 12355.6 | 0 |
| 12314.5 | 0 |
| 12273.5 | 0 |
| 12232.6 | 0 |
| 12191.9 | 0 |
| 12151.4 | 0 |
| 12110.9 | 0 |
| 12070.6 | 0 |
| 12030.5 | 0 |
| 11990.4 | 0 |
| 11950.5 | 0 |
| 11910.8 | 0 |
| 11871.1 | 0 |
| 11831.6 | 0 |
| 11792.3 | 0 |
| 11753.0 | 0 |
| 11713.9 | 0 |
| 11675.0 | 0 |
| 11636.1 | 0 |
| 11597.4 | 0 |
| 11558.8 | 0 |
| 11520.3 | 0 |
| 11482.0 | 0 |
| 11443.8 | 0 |
| 11405.7 | 0 |
| 11367.8 | 0 |
| 11329.9 | 0 |
| 11292.2 | 0 |
| 11254.7 | 0 |
| 11217.2 | 0 |
| 11179.9 | 0 |
| 11142.7 | 0 |
| 11105.6 | 0 |
| 11068.7 | 0 |
| 11031.8 | 0 |
| 10995.1 | 0 |
| 10958.5 | 0 |
| 10922.1 | 0 |
| 10885.7 | 0 |
| 10849.5 | 0 |
| 10813.4 | 0 |
| 10777.4 | 0 |
| 10741.6 | 0 |
| 10705.8 | 0 |
| 10670.2 | 0 |
| 10634.7 | 0 |
| 10599.3 | 0 |
| 10564.1 | 0 |
| 10528.9 | 0 |
| 10493.9 | 0 |
| 10458.9 | 0 |
| 10424.1 | 0 |
| 10389.5 | 0 |
| 10354.9 | 0 |
| 10320.4 | 0 |
| 10286.1 | 0 |
| 10251.9 | 0 |
| 10217.8 | 0 |
| 10183.8 | 0 |
| 10149.9 | 0 |
| 10116.1 | 0 |
| 10082.4 | 0 |
| 10048.9 | 0 |
| 10015.5 | 0 |
| 9982.13 | 0 |
| 9948.91 | 0 |
| 9915.81 | 0 |
| 9882.81 | 0 |
| 9849.93 | 0 |
| 9817.16 | 0 |
| 9784.49 | 0 |
| 9751.93 | 0 |
| 9719.48 | 0 |
| 9687.14 | 0 |
| 9654.91 | 0 |
| 9622.78 | 0 |
| 9590.76 | 0 |
| 9558.85 | 0 |
| 9527.05 | 0 |
| 9495.35 | 0 |
| 9463.75 | 0 |
| 9432.26 | 0 |
| 9400.87 | 0 |
| 9369.59 | 0 |
| 9338.42 | 0 |
| 9307.34 | 0 |
| 9276.38 | 0 |
| 9245.51 | 0 |
| 9214.75 | 0 |
| 9184.08 | 0 |
| 9153.52 | 0 |
| 9123.07 | 0 |
| 9092.71 | 0 |
| 9062.46 | 0 |
| 9032.3 | 0 |
| 9002.25 | 0 |
| 8972.29 | 0 |
| 8942.44 | 0 |
| 8912.68 | 0 |
| 8883.03 | 0 |
| 8853.47 | 0 |
| 8824.01 | 0 |
| 8794.65 | 0 |
| 8765.38 | 0 |
| 8736.22 | 0 |
| 8707.15 | 0 |
| 8678.18 | 0 |
| 8649.3 | 0 |
| 8620.52 | 0 |
| 8591.84 | 0 |
| 8563.25 | 0 |
| 8534.75 | 0 |
| 8506.36 | 0 |
| 8478.05 | 0 |
| 8449.84 | 0 |
| 8421.73 | 0 |
| 8393.7 | 0 |
| 8365.77 | 0 |
| 8337.94 | 0 |
| 8310.19 | 0 |
| 8282.54 | 0 |
| 8254.98 | 0 |
| 8227.51 | 0 |
| 8200.14 | 0 |
| 8172.85 | 0 |
| 8145.66 | 0 |
| 8118.55 | 0 |
| 8091.54 | 0 |
| 8064.62 | 0 |
| 8037.78 | 0 |
| 8011.04 | 0 |
| 7984.38 | 0 |
| 7957.81 | 0 |
| 7931.33 | 0 |
| 7904.94 | 0 |
| 7878.64 | 0 |
| 7852.42 | 0 |
| 7826.3 | 0 |
| 7800.25 | 0 |
| 7774.3 | 0 |
| 7748.43 | 0 |
| 7722.65 | 0 |
| 7696.95 | 0 |
| 7671.34 | 0 |
| 7645.82 | 0 |
| 7620.38 | 0 |
| 7595.02 | 0 |
| 7569.75 | 0 |
| 7544.56 | 0 |
| 7519.46 | 0 |
| 7494.44 | 0 |
| 7469.5 | 0 |
| 7444.64 | 0 |
| 7419.87 | 0 |
| 7395.18 | 0 |
| 7370.58 | 0 |
| 7346.05 | 0 |
| 7321.61 | 0 |
| 7297.25 | 0 |
| 7272.96 | 0 |
| 7248.76 | 0 |
| 7224.64 | 0 |
| 7200.61 | 0 |
| 7176.65 | 0 |
| 7152.77 | 0 |
| 7128.97 | 0 |
| 7105.24 | 0 |
| 7081.6 | 0 |
| 7058.04 | 0 |
| 7034.55 | 0 |
| 7011.15 | 0 |
| 6987.82 | 0 |
| 6964.57 | 0 |
| 6941.39 | 0 |
| 6918.3 | 0 |
| 6895.28 | 0 |
| 6872.33 | 0 |
| 6849.47 | 0 |
| 6826.67 | 0 |
| 6803.96 | 0 |
| 6781.32 | 0 |
| 6758.75 | 0 |
| 6736.27 | 0 |
| 6713.85 | 0 |
| 6691.51 | 0 |
| 6669.25 | 0 |
| 6647.05 | 0 |
| 6624.94 | 0 |
| 6602.89 | 0 |
| 6580.92 | 0 |
| 6559.02 | 0 |
| 6537.2 | 0 |
| 6515.45 | 0 |
| 6493.77 | 0 |
| 6472.16 | 0 |
| 6450.63 | 0 |
| 6429.16 | 0 |
| 6407.77 | 0 |
| 6386.45 | 0 |
| 6365.2 | 0 |
| 6344.02 | 0 |
| 6322.91 | 0 |
| 6301.87 | 0 |
| 6280.9 | 0 |
| 6260.0 | 0 |
| 6239.17 | 0 |
| 6218.41 | 0 |
| 6197.72 | 0 |
| 6177.1 | 0 |
| 6156.54 | 0 |
| 6136.06 | 0 |
| 6115.64 | 0 |
| 6095.29 | 0 |
| 6075.01 | 0 |
| 6054.8 | 0 |
| 6034.65 | 0 |
| 6014.57 | 0 |
| 5994.56 | 0 |
| 5974.61 | 0 |
| 5954.73 | 0 |
| 5934.92 | 0 |
| 5915.17 | 0 |
| 5895.49 | 0 |
| 5875.87 | 0 |
| 5856.32 | 0 |
| 5836.83 | 0 |
| 5817.41 | 0 |
| 5798.05 | 0 |
| 5778.76 | 0 |
| 5759.53 | 0 |
| 5740.37 | 0 |
| 5721.27 | 0 |
| 5702.23 | 0 |
| 5683.25 | 0 |
| 5664.34 | 0 |
| 5645.5 | 0 |
| 5626.71 | 0 |
| 5607.99 | 0 |
| 5589.33 | 0 |
| 5570.73 | 0 |
| 5552.2 | 0 |
| 5533.72 | 0 |
| 5515.31 | 0 |
| 5496.96 | 0 |
| 5478.67 | 0 |
| 5460.44 | 0 |
| 5442.27 | 0 |
| 5424.16 | 0 |
| 5406.11 | 0 |
| 5388.12 | 0 |
| 5370.19 | 0 |
| 5352.32 | 0 |
| 5334.51 | 0 |
| 5316.76 | 0 |
| 5299.07 | 0 |
| 5281.44 | 0 |
| 5263.87 | 0 |
| 5246.35 | 0 |
| 5228.89 | 0 |
| 5211.5 | 0 |
| 5194.15 | 0 |
| 5176.87 | 0 |
| 5159.65 | 0 |
| 5142.48 | 0 |
| 5125.37 | 0 |
| 5108.31 | 0 |
| 5091.31 | 0 |
| 5074.37 | 0 |
| 5057.49 | 0 |
| 5040.66 | 0 |
| 5023.89 | 0 |
| 5007.17 | 0 |
| 4990.51 | 0 |
| 4973.91 | 0 |
| 4957.35 | 0 |
| 4940.86 | 0 |
| 4924.42 | 0 |
| 4908.03 | 0 |
| 4891.7 | 0 |
| 4875.43 | 0 |
| 4859.2 | 0 |
| 4843.03 | 0 |
| 4826.92 | 0 |
| 4810.86 | 0 |
| 4794.85 | 0 |
| 4778.9 | 0 |
| 4763.0 | 0 |
| 4747.15 | 0 |
| 4731.35 | 0 |
| 4715.61 | 0 |
| 4699.92 | 0 |
| 4684.28 | 0 |
| 4668.69 | 0 |
| 4653.16 | 0 |
| 4637.67 | 0 |
| 4622.24 | 0 |
| 4606.86 | 0 |
| 4591.53 | 0 |
| 4576.26 | 0 |
| 4561.03 | 0 |
| 4545.85 | 0 |
| 4530.73 | 0 |
| 4515.65 | 0 |
| 4500.62 | 0 |
| 4485.65 | 0 |
| 4470.72 | 0 |
| 4455.85 | 0 |
| 4441.02 | 0 |
| 4426.24 | 0 |
| 4411.52 | 0 |
| 4396.84 | 0 |
| 4382.21 | 0 |
| 4367.63 | 0 |
| 4353.09 | 0 |
| 4338.61 | 0 |
| 4324.17 | 0 |
| 4309.78 | 0 |
| 4295.44 | 0 |
| 4281.15 | 0 |
| 4266.9 | 0 |
| 4252.71 | 0 |
| 4238.56 | 0 |
| 4224.45 | 0 |
| 4210.4 | 0 |
| 4196.39 | 0 |
| 4182.42 | 0 |
| 4168.51 | 0 |
| 4154.64 | 0 |
| 4140.81 | 0 |
| 4127.03 | 0 |
| 4113.3 | 0 |
| 4099.61 | 0 |
| 4085.97 | 0 |
| 4072.38 | 0 |
| 4058.83 | 0 |
| 4045.32 | 0 |
| 4031.86 | 0 |
| 4018.45 | 0 |
| 4005.07 | 0 |
| 3991.75 | 0 |
| 3978.47 | 0 |
| 3965.23 | 0 |
| 3952.03 | 0 |
| 3938.88 | 0 |
| 3925.78 | 0 |
| 3912.71 | 0 |
| 3899.7 | 0 |
| 3886.72 | 0 |
| 3873.79 | 0 |
| 3860.9 | 0 |
| 3848.05 | 0 |
| 3835.25 | 0 |
| 3822.48 | 0 |
| 3809.77 | 0 |
| 3797.09 | 0 |
| 3784.45 | 0 |
| 3771.86 | 0 |
| 3759.31 | 0 |
| 3746.8 | 0 |
| 3734.34 | 0 |
| 3721.91 | 0 |
| 3709.53 | 0 |
| 3697.18 | 0 |
| 3684.88 | 0 |
| 3672.62 | 0 |
| 3660.4 | 0 |
| 3648.22 | 0 |
| 3636.08 | 0 |
| 3623.98 | 0 |
| 3611.92 | 0 |
| 3599.9 | 0 |
| 3587.93 | 0 |
| 3575.99 | 0 |
| 3564.09 | 0 |
| 3552.23 | 0 |
| 3540.41 | 0 |
| 3528.63 | 0 |
| 3516.89 | 0 |
| 3505.19 | 0 |
| 3493.52 | 0 |
| 3481.9 | 0 |
| 3470.31 | 0 |
| 3458.76 | 0 |
| 3447.26 | 0 |
| 3435.79 | 0 |
| 3424.35 | 0 |
| 3412.96 | 0 |
| 3401.6 | 0 |
| 3390.28 | 0 |
| 3379.0 | 0 |
| 3367.76 | 0 |
| 3356.55 | 0 |
| 3345.38 | 0 |
| 3334.25 | 0 |
| 3323.16 | 0 |
| 3312.1 | 0 |
| 3301.08 | 0 |
| 3290.1 | 0 |
| 3279.15 | 0 |
| 3268.24 | 0 |
| 3257.36 | 0 |
| 3246.52 | 0 |
| 3235.72 | 0 |
| 3224.96 | 0 |
| 3214.22 | 0 |
| 3203.53 | 0 |
| 3192.87 | 0 |
| 3182.25 | 0 |
| 3171.66 | 0 |
| 3161.1 | 0 |
| 3150.59 | 0 |
| 3140.1 | 0 |
| 3129.65 | 0 |
| 3119.24 | 0 |
| 3108.86 | 0 |
| 3098.52 | 0 |
| 3088.21 | 0 |
| 3077.93 | 0 |
| 3067.69 | 0 |
| 3057.48 | 0 |
| 3047.31 | 0 |
| 3037.17 | 0 |
| 3027.06 | 0 |
| 3016.99 | 0 |
| 3006.95 | 0 |
| 2996.95 | 0 |
| 2986.97 | 0 |
| 2977.03 | 0 |
| 2967.13 | 0 |
| 2957.26 | 0 |
| 2947.42 | 0 |
| 2937.61 | 0 |
| 2927.83 | 0 |
| 2918.09 | 0 |
| 2908.38 | 0 |
| 2898.7 | 0 |
| 2889.06 | 0 |
| 2879.45 | 0 |
| 2869.87 | 0 |
| 2860.32 | 0 |
| 2850.8 | 0 |
| 2841.31 | 0 |
| 2831.86 | 0 |
| 2822.44 | 0 |
| 2813.04 | 0 |
| 2803.68 | 0 |
| 2794.35 | 0 |
| 2785.06 | 0 |
| 2775.79 | 0 |
| 2766.55 | 0 |
| 2757.35 | 0 |
| 2748.17 | 0 |
| 2739.03 | 0 |
| 2729.92 | 0 |
| 2720.83 | 0 |
| 2711.78 | 0 |
| 2702.75 | 0 |
| 2693.76 | 0 |
| 2684.8 | 0 |
| 2675.86 | 0 |
| 2666.96 | 0 |
| 2658.09 | 0 |
| 2649.24 | 0 |
| 2640.43 | 0 |
| 2631.64 | 0 |
| 2622.89 | 0 |
| 2614.16 | 0 |
| 2605.46 | 0 |
| 2596.79 | 0 |
| 2588.15 | 0 |
| 2579.54 | 0 |
| 2570.95 | 0 |
| 2562.4 | 0 |
| 2553.87 | 0 |
| 2545.38 | 0 |
| 2536.91 | 0 |
| 2528.46 | 0 |
| 2520.05 | 0 |
| 2511.67 | 0 |
| 2503.31 | 0 |
| 2494.98 | 0 |
| 2486.68 | 0 |
| 2478.4 | 0 |
| 2470.16 | 0 |
| 2461.94 | 0 |
| 2453.75 | 0 |
| 2445.58 | 0 |
| 2437.44 | 0 |
| 2429.33 | 0 |
| 2421.25 | 0 |
| 2413.19 | 0 |
| 2405.16 | 0 |
| 2397.16 | 0 |
| 2389.18 | 0 |
| 2381.23 | 0 |
| 2373.31 | 0 |
| 2365.41 | 0 |
| 2357.54 | 0 |
| 2349.7 | 0 |
| 2341.88 | 0 |
| 2334.09 | 0 |
| 2326.32 | 0 |
| 2318.58 | 0 |
| 2310.87 | 0 |
| 2303.18 | 0 |
| 2295.51 | 0 |
| 2287.87 | 0 |
| 2280.26 | 0 |
| 2272.67 | 0 |
| 2265.11 | 0 |
| 2257.57 | 0 |
| 2250.06 | 0 |
| 2242.58 | 0 |
| 2235.11 | 0 |
| 2227.68 | 0 |
| 2220.26 | 0 |
| 2212.88 | 0 |
| 2205.51 | 0 |
| 2198.17 | 0 |
| 2190.86 | 0 |
| 2183.57 | 0 |
| 2176.31 | 0 |
| 2169.06 | 0 |
| 2161.85 | 0 |
| 2154.65 | 0 |
| 2147.48 | 0 |
| 2140.34 | 0 |
| 2133.22 | 0 |
| 2126.12 | 0 |
| 2119.04 | 0 |
| 2111.99 | 0 |
| 2104.96 | 0 |
| 2097.96 | 0 |
| 2090.98 | 0 |
| 2084.02 | 0 |
| 2077.09 | 0 |
| 2070.18 | 0 |
| 2063.29 | 0 |
| 2056.42 | 0 |
| 2049.58 | 0 |
| 2042.76 | 0 |
| 2035.96 | 0 |
| 2029.19 | 0 |
| 2022.44 | 0 |
| 2015.71 | 0 |
| 2009.0 | 0 |
| 2002.32 | 0 |
| 1995.65 | 0 |
| 1989.01 | 0 |
| 1982.39 | 0 |
| 1975.8 | 0 |
| 1969.22 | 0 |
| 1962.67 | 0 |
| 1956.14 | 0 |
| 1949.63 | 0 |
| 1943.14 | 0 |
| 1936.68 | 0 |
| 1930.23 | 0 |
| 1923.81 | 0 |
| 1917.41 | 0 |
| 1911.03 | 0 |
| 1904.67 | 0 |
| 1898.33 | 0 |
| 1892.02 | 0 |
| 1885.72 | 0 |
| 1879.45 | 0 |
| 1873.19 | 0 |
| 1866.96 | 0 |
| 1860.75 | 0 |
| 1854.56 | 0 |
| 1848.39 | 0 |
| 1842.24 | 0 |
| 1836.11 | 0 |
| 1830.0 | 0 |
| 1823.91 | 0 |
| 1817.84 | 0 |
| 1811.79 | 0 |
| 1805.76 | 0 |
| 1799.75 | 0 |
| 1793.76 | 0 |
| 1787.8 | 0 |
| 1781.85 | 0 |
| 1775.92 | 0 |
| 1770.01 | 0 |
| 1764.12 | 0 |
| 1758.25 | 0 |
| 1752.4 | 0 |
| 1746.57 | 0 |
| 1740.76 | 0 |
| 1734.96 | 0 |
| 1729.19 | 0 |
| 1723.44 | 0 |
| 1717.7 | 0 |
| 1711.99 | 0 |
| 1706.29 | 0 |
| 1700.61 | 0 |
| 1694.95 | 0 |
| 1689.31 | 0 |
| 1683.69 | 0 |
| 1678.09 | 0 |
| 1672.51 | 0 |
| 1666.94 | 0 |
| 1661.4 | 0 |
| 1655.87 | 0 |
| 1650.36 | 0 |
| 1644.87 | 0 |
| 1639.39 | 0 |
| 1633.94 | 0 |
| 1628.5 | 0 |
| 1623.08 | 0 |
| 1617.68 | 0 |
| 1612.3 | 0 |
| 1606.93 | 0 |
| 1601.59 | 0 |
| 1596.26 | 0 |
| 1590.95 | 0 |
| 1585.65 | 0 |
| 1580.38 | 0 |
| 1575.12 | 0 |
| 1569.88 | 0 |
| 1564.65 | 0 |
| 1559.45 | 0 |
| 1554.26 | 0 |
| 1549.09 | 0 |
| 1543.93 | 0 |
| 1538.79 | 0 |
| 1533.67 | 0 |
| 1528.57 | 0 |
| 1523.49 | 0 |
| 1518.42 | 0 |
| 1513.36 | 0 |
| 1508.33 | 0 |
| 1503.31 | 0 |
| 1498.31 | 0 |
| 1493.32 | 0 |
| 1488.35 | 0 |
| 1483.4 | 0 |
| 1478.46 | 0 |
| 1473.54 | 0 |
| 1468.64 | 0 |
| 1463.75 | 0 |
| 1458.88 | 0 |
| 1454.03 | 0 |
| 1449.19 | 0 |
| 1444.37 | 0 |
| 1439.56 | 0 |
| 1434.77 | 0 |
| 1430.0 | 0 |
| 1425.24 | 0 |
| 1420.5 | 0 |
| 1415.77 | 0 |
| 1411.06 | 0 |
| 1406.37 | 0 |
| 1401.69 | 0 |
| 1397.02 | 0 |
| 1392.37 | 0 |
| 1387.74 | 0 |
| 1383.12 | 0 |
| 1378.52 | 0 |
| 1373.93 | 0 |
| 1369.36 | 0 |
| 1364.81 | 0 |
| 1360.27 | 0 |
| 1355.74 | 0 |
| 1351.23 | 0 |
| 1346.73 | 0 |
| 1342.25 | 0 |
| 1337.78 | 0 |
| 1333.33 | 0 |
| 1328.9 | 0 |
| 1324.47 | 0 |
| 1320.07 | 0 |
| 1315.68 | 0 |
| 1311.3 | 0 |
| 1306.93 | 0 |
| 1302.59 | 0 |
| 1298.25 | 0 |
| 1293.93 | 0 |
| 1289.63 | 0 |
| 1285.33 | 0 |
| 1281.06 | 0 |
| 1276.8 | 0 |
| 1272.55 | 0 |
| 1268.31 | 0 |
| 1264.09 | 0 |
| 1259.89 | 0 |
| 1255.69 | 0 |
| 1251.52 | 0 |
| 1247.35 | 0 |
| 1243.2 | 0 |
| 1239.06 | 0 |
| 1234.94 | 0 |
| 1230.83 | 0 |
| 1226.74 | 0 |
| 1222.65 | 0 |
| 1218.59 | 0 |
| 1214.53 | 0 |
| 1210.49 | 0 |
| 1206.46 | 0 |
| 1202.45 | 0 |
| 1198.45 | 0 |
| 1194.46 | 0 |
| 1190.48 | 0 |
| 1186.52 | 0 |
| 1182.58 | 0 |
| 1178.64 | 0 |
| 1174.72 | 0 |
| 1170.81 | 0 |
| 1166.91 | 0 |
| 1163.03 | 0 |
| 1159.16 | 0 |
| 1155.3 | 0 |
| 1151.46 | 0 |
| 1147.63 | 0 |
| 1143.81 | 0 |
| 1140.0 | 0 |
| 1136.21 | 0 |
| 1132.43 | 0 |
| 1128.66 | 0 |
| 1124.91 | 0 |
| 1121.16 | 0 |
| 1117.43 | 0 |
| 1113.72 | 0 |
| 1110.01 | 0 |
| 1106.32 | 0 |
| 1102.63 | 0 |
| 1098.97 | 0 |
| 1095.31 | 0 |
| 1091.66 | 0 |
| 1088.03 | 0 |
| 1084.41 | 0 |
| 1080.8 | 0 |
| 1077.21 | 0 |
| 1073.62 | 0 |
| 1070.05 | 0 |
| 1066.49 | 0 |
| 1062.94 | 0 |
| 1059.4 | 0 |
| 1055.88 | 0 |
| 1052.37 | 0 |
| 1048.86 | 0 |
| 1045.37 | 0 |
| 1041.9 | 0 |
| 1038.43 | 0 |
| 1034.97 | 0 |
| 1031.53 | 0 |
| 1028.1 | 0 |
| 1024.68 | 0 |
| 1021.27 | 0 |
| 1017.87 | 0 |
| 1014.48 | 0 |
| 1011.11 | 0 |
| 1007.74 | 0 |
| 1004.39 | 0 |
| 1001.05 | 0 |
| 997.716 | 0 |
| 994.396 | 0 |
| 991.087 | 0 |
| 987.79 | 0 |
| 984.503 | 0 |
| 981.227 | 0 |
| 977.962 | 0 |
| 974.708 | 0 |
| 971.465 | 0 |
| 968.232 | 0 |
| 965.01 | 0 |
| 961.799 | 0 |
| 958.599 | 0 |
| 955.409 | 0 |
| 952.23 | 0 |
| 949.062 | 0 |
| 945.904 | 0 |
| 942.757 | 0 |
| 939.62 | 0 |
| 936.493 | 0 |
| 933.377 | 0 |
| 930.271 | 0 |
| 927.176 | 0 |
| 924.091 | 0 |
| 921.016 | 0 |
| 917.951 | 0 |
| 914.897 | 0 |
| 911.853 | 0 |
| 908.818 | 0 |
| 905.794 | 0 |
| 902.78 | 0 |
| 899.777 | 0 |
| 896.783 | 0 |
| 893.799 | 0 |
| 890.825 | 0 |
| 887.86 | 0 |
| 884.906 | 0 |
| 881.962 | 0 |
| 879.027 | 0 |
| 876.102 | 0 |
| 873.187 | 0 |
| 870.281 | 0 |
| 867.386 | 0 |
| 864.5 | 0 |
| 861.623 | 0 |
| 858.756 | 0 |
| 855.899 | 0 |
| 853.051 | 0 |
| 850.212 | 0 |
| 847.383 | 0 |
| 844.564 | 0 |
| 841.753 | 0 |
| 838.952 | 0 |
| 836.161 | 0 |
| 833.379 | 0 |
| 830.606 | 0 |
| 827.842 | 0 |
| 825.087 | 0 |
| 822.342 | 0 |
| 819.606 | 0 |
| 816.878 | 0 |
| 814.16 | 0 |
| 811.451 | 0 |
| 808.751 | 0 |
| 806.06 | 0 |
| 803.378 | 0 |
| 800.705 | 0 |
| 798.041 | 0 |
| 795.385 | 0 |
| 792.739 | 0 |
| 790.101 | 0 |
| 787.472 | 0 |
| 784.852 | 0 |
| 782.24 | 0 |
| 779.637 | 0 |
| 777.043 | 0 |
| 774.457 | 0 |
| 771.881 | 0 |
| 769.312 | 0 |
| 766.752 | 0 |
| 764.201 | 0 |
| 761.658 | 0 |
| 759.124 | 0 |
| 756.598 | 0 |
| 754.08 | 0 |
| 751.571 | 0 |
| 749.07 | 0 |
| 746.578 | 0 |
| 744.094 | 0 |
| 741.618 | 0 |
| 739.15 | 0 |
| 736.691 | 0 |
| 734.239 | 0 |
| 731.796 | 0 |
| 729.361 | 0 |
| 726.934 | 0 |
| 724.516 | 0 |
| 722.105 | 0 |
| 719.702 | 0 |
| 717.307 | 0 |
| 714.921 | 0 |
| 712.542 | 0 |
| 710.171 | 0 |
| 707.808 | 0 |
| 705.453 | 0 |
| 703.105 | 0 |
| 700.766 | 0 |
| 698.434 | 0 |
| 696.11 | 0 |
| 693.794 | 0 |
| 691.485 | 0 |
| 689.184 | 0 |
| 686.891 | 0 |
| 684.606 | 0 |
| 682.328 | 0 |
| 680.057 | 0 |
| 677.794 | 0 |
| 675.539 | 0 |
| 673.291 | 0 |
| 671.051 | 0 |
| 668.818 | 0 |
| 666.593 | 0 |
| 664.375 | 0 |
| 662.164 | 0 |
| 659.961 | 0 |
| 657.765 | 0 |
| 655.576 | 0 |
| 653.395 | 0 |
| 651.22 | 0 |
| 649.054 | 0 |
| 646.894 | 0 |
| 644.741 | 0 |
| 642.596 | 0 |
| 640.458 | 0 |
| 638.327 | 0 |
| 636.203 | 0 |
| 634.086 | 0 |
| 631.976 | 0 |
| 629.873 | 0 |
| 627.777 | 0 |
| 625.688 | 0 |
| 623.607 | 0 |
| 621.532 | 0 |
| 619.463 | 0 |
| 617.402 | 0 |
| 615.348 | 0 |
| 613.3 | 0 |
| 611.26 | 0 |
| 609.226 | 0 |
| 607.199 | 0 |
| 605.178 | 0 |
| 603.164 | 0 |
| 601.157 | 0 |
| 599.157 | 0 |
| 597.163 | 0 |
| 595.177 | 0 |
| 593.196 | 0 |
| 591.222 | 0 |
| 589.255 | 0 |
| 587.294 | 0 |
| 585.34 | 0 |
| 583.393 | 0 |
| 581.451 | 0 |
| 579.517 | 0 |
| 577.588 | 0 |
| 575.666 | 0 |
| 573.751 | 0 |
| 571.842 | 0 |
| 569.939 | 0 |
| 568.043 | 0 |
| 566.153 | 0 |
| 564.269 | 0 |
| 562.391 | 0 |
| 560.52 | 0 |
| 558.655 | 0 |
| 556.796 | 0 |
| 554.943 | 0 |
| 553.097 | 0 |
| 551.256 | 0 |
| 549.422 | 0 |
| 547.594 | 0 |
| 545.772 | 0 |
| 543.956 | 0 |
| 542.146 | 0 |
| 540.342 | 0 |
| 538.544 | 0 |
| 536.752 | 0 |
| 534.966 | 0 |
| 533.186 | 0 |
| 531.412 | 0 |
| 529.643 | 0 |
| 527.881 | 0 |
| 526.125 | 0 |
| 524.374 | 0 |
| 522.629 | 0 |
| 520.89 | 0 |
| 519.157 | 0 |
| 517.429 | 0 |
| 515.708 | 0 |
| 513.992 | 0 |
| 512.282 | 0 |
| 510.577 | 0 |
| 508.878 | 0 |
| 507.185 | 0 |
| 505.497 | 0 |
| 503.815 | 0 |
| 502.139 | 0 |
| 500.468 | 0 |
| 498.803 | 0 |
| 497.143 | 0 |
| 495.489 | 0 |
| 493.84 | 0 |
| 492.197 | 0 |
| 490.559 | 0 |
| 488.927 | 0 |
| 487.3 | 0 |
| 485.678 | 0 |
| 484.062 | 0 |
| 482.452 | 0 |
| 480.846 | 0 |
| 479.246 | 0 |
| 477.652 | 0 |
| 476.062 | 0 |
| 474.478 | 0 |
| 472.9 | 0 |
| 471.326 | 0 |
| 469.758 | 0 |
| 468.195 | 0 |
| 466.637 | 0 |
| 465.084 | 0 |
| 463.537 | 0 |
| 461.994 | 0 |
| 460.457 | 0 |
| 458.925 | 0 |
| 457.398 | 0 |
| 455.876 | 0 |
| 454.359 | 0 |
| 452.847 | 0 |
| 451.34 | 0 |
| 449.838 | 0 |
| 448.342 | 0 |
| 446.85 | 0 |
| 445.363 | 0 |
| 443.881 | 0 |
| 442.404 | 0 |
| 440.932 | 0 |
| 439.465 | 0 |
| 438.003 | 0 |
| 436.545 | 0 |
| 435.093 | 0 |
| 433.645 | 0 |
| 432.202 | 0 |
| 430.764 | 0 |
| 429.33 | 0 |
| 427.902 | 0 |
| 426.478 | 0 |
| 425.059 | 0 |
| 423.645 | 0 |
| 422.235 | 0 |
| 420.83 | 0 |
| 419.43 | 0 |
| 418.034 | 0 |
| 416.643 | 0 |
| 415.257 | 0 |
| 413.875 | 0 |
| 412.498 | 0 |
| 411.125 | 0 |
| 409.757 | 0 |
| 408.394 | 0 |
| 407.035 | 0 |
| 405.681 | 0 |
| 404.331 | 0 |
| 402.985 | 0 |
| 401.645 | 0 |
| 400.308 | 0 |
| 398.976 | 0 |
| 397.649 | 0 |
| 396.325 | 0 |
| 395.007 | 0 |
| 393.692 | 0 |
| 392.382 | 0 |
| 391.077 | 0 |
| 389.775 | 0 |
| 388.478 | 0 |
| 387.186 | 0 |
| 385.898 | 0 |
| 384.613 | 0 |
| 383.334 | 0 |
| 382.058 | 0 |
| 380.787 | 0 |
| 379.52 | 0 |
| 378.257 | 0 |
| 376.998 | 0 |
| 375.744 | 0 |
| 374.494 | 0 |
| 373.248 | 0 |
| 372.006 | 0 |
| 370.768 | 0 |
| 369.534 | 0 |
| 368.305 | 0 |
| 367.079 | 0 |
| 365.858 | 0 |
| 364.64 | 0 |
| 363.427 | 0 |
| 362.218 | 0 |
| 361.012 | 0 |
| 359.811 | 0 |
| 358.614 | 0 |
| 357.421 | 0 |
| 356.231 | 0 |
| 355.046 | 0 |
| 353.865 | 0 |
| 352.687 | 0 |
| 351.514 | 0 |
| 350.344 | 0 |
| 349.178 | 0 |
| 348.016 | 0 |
| 346.858 | 0 |
| 345.704 | 0 |
| 344.554 | 0 |
| 343.408 | 0 |
| 342.265 | 0 |
| 341.126 | 0 |
| 339.991 | 0 |
| 338.86 | 0 |
| 337.732 | 0 |
| 336.608 | 0 |
| 335.488 | 0 |
| 334.372 | 0 |
| 333.259 | 0 |
| 332.15 | 0 |
| 331.045 | 0 |
| 329.944 | 0 |
| 328.846 | 0 |
| 327.752 | 0 |
| 326.661 | 0 |
| 325.574 | 0 |
| 324.491 | 0 |
| 323.411 | 0 |
| 322.335 | 0 |
| 321.262 | 0 |
| 320.193 | 0 |
| 319.128 | 0 |
| 318.066 | 0 |
| 317.008 | 0 |
| 315.953 | 0 |
| 314.902 | 0 |
| 313.854 | 0 |
| 312.81 | 0 |
| 311.769 | 0 |
| 310.731 | 0 |
| 309.697 | 0 |
| 308.667 | 0 |
| 307.64 | 0 |
| 306.616 | 0 |
| 305.596 | 0 |
| 304.579 | 0 |
| 303.566 | 0 |
| 302.556 | 0 |
| 301.549 | 0 |
| 300.545 | 0 |
| 299.545 | 0 |
| 298.549 | 0 |
| 297.555 | 0 |
| 296.565 | 0 |
| 295.578 | 0 |
| 294.595 | 0 |
| 293.615 | 0 |
| 292.638 | 0 |
| 291.664 | 0 |
| 290.693 | 0 |
| 289.726 | 0 |
| 288.762 | 0 |
| 287.801 | 0 |
| 286.844 | 0 |
| 285.889 | 0 |
| 284.938 | 0 |
| 283.99 | 0 |
| 283.045 | 0 |
| 282.103 | 0 |
| 281.164 | 0 |
| 280.229 | 0 |
| 279.296 | 0 |
| 278.367 | 0 |
| 277.441 | 0 |
| 276.518 | 0 |
| 275.598 | 0 |
| 274.681 | 0 |
| 273.767 | 0 |
| 272.856 | 0 |
| 271.948 | 0 |
| 271.043 | 0 |
| 270.141 | 0 |
| 269.242 | 0 |
| 268.346 | 0 |
| 267.453 | 0 |
| 266.563 | 0 |
| 265.676 | 0 |
| 264.792 | 0 |
| 263.911 | 0 |
| 263.033 | 0 |
| 262.158 | 0 |
| 261.286 | 0 |
| 260.416 | 0 |
| 259.55 | 0 |
| 258.686 | 0 |
| 257.825 | 0 |
| 256.967 | 0 |
| 256.112 | 0 |
| 255.26 | 0 |
| 254.411 | 0 |
| 253.564 | 0 |
| 252.721 | 0 |
| 251.88 | 0 |
| 251.042 | 0 |
| 250.206 | 0 |
| 249.374 | 0 |
| 248.544 | 0 |
| 247.717 | 0 |
| 246.893 | 0 |
| 246.071 | 0 |
| 245.252 | 0 |
| 244.436 | 0 |
| 243.623 | 0 |
| 242.812 | 0 |
| 242.004 | 0 |
| 241.199 | 0 |
| 240.397 | 0 |
| 239.597 | 0 |
| 238.799 | 0 |
| 238.005 | 0 |
| 237.213 | 0 |
| 236.424 | 0 |
| 235.637 | 0 |
| 234.853 | 0 |
| 234.071 | 0 |
| 233.293 | 0 |
| 232.516 | 0 |
| 231.743 | 0 |
| 230.971 | 0 |
| 230.203 | 0 |
| 229.437 | 0 |
| 228.674 | 0 |
| 227.913 | 0 |
| 227.154 | 0 |
| 226.398 | 0 |
| 225.645 | 0 |
| 224.894 | 0 |
| 224.146 | 0 |
| 223.4 | 0 |
| 222.657 | 0 |
| 221.916 | 0 |
| 221.178 | 0 |
| 220.442 | 0 |
| 219.708 | 0 |
| 218.977 | 0 |
| 218.248 | 0 |
| 217.522 | 0 |
| 216.798 | 0 |
| 216.077 | 0 |
| 215.358 | 0 |
| 214.641 | 0 |
| 213.927 | 0 |
| 213.215 | 0 |
| 212.506 | 0 |
| 211.799 | 0 |
| 211.094 | 0 |
| 210.392 | 0 |
| 209.692 | 0 |
| 208.994 | 0 |
| 208.299 | 0 |
| 207.605 | 0 |
| 206.915 | 0 |
| 206.226 | 0 |
| 205.54 | 0 |
| 204.856 | 0 |
| 204.174 | 0 |
| 203.495 | 0 |
| 202.818 | 0 |
| 202.143 | 0 |
| 201.47 | 0 |
| 200.8 | 0 |
| 200.132 | 0 |
| 199.466 | 0 |
| 198.802 | 0 |
| 198.141 | 0 |
| 197.481 | 0 |
| 196.824 | 0 |
| 196.169 | 0 |
| 195.517 | 0 |
| 194.866 | 0 |
| 194.218 | 0 |
| 193.571 | 0 |
| 192.927 | 0 |
| 192.285 | 0 |
| 191.646 | 0 |
| 191.008 | 0 |
| 190.372 | 0 |
| 189.739 | 0 |
| 189.108 | 0 |
| 188.478 | 0 |
| 187.851 | 0 |
| 187.226 | 0 |
| 186.603 | 0 |
| 185.982 | 0 |
| 185.363 | 0 |
| 184.747 | 0 |
| 184.132 | 0 |
| 183.519 | 0 |
| 182.909 | 0 |
| 182.3 | 0 |
| 181.693 | 0 |
| 181.089 | 0 |
| 180.486 | 0 |
| 179.886 | 0 |
| 179.287 | 0 |
| 178.691 | 0 |
| 178.096 | 0 |
| 177.503 | 0 |
| 176.913 | 0 |
| 176.324 | 0 |
| 175.737 | 0 |
| 175.153 | 0 |
| 174.57 | 0 |
| 173.989 | 0 |
| 173.41 | 0 |
| 172.833 | 0 |
| 172.258 | 0 |
| 171.685 | 0 |
| 171.113 | 0 |
| 170.544 | 0 |
| 169.977 | 0 |
| 169.411 | 0 |
| 168.847 | 0 |
| 168.286 | 0 |
| 167.726 | 0 |
| 167.167 | 0 |
| 166.611 | 0 |
| 166.057 | 0 |
| 165.504 | 0 |
| 164.954 | 0 |
| 164.405 | 0 |
| 163.858 | 0 |
| 163.312 | 0 |
| 162.769 | 0 |
| 162.227 | 0 |
| 161.688 | 0 |
| 161.15 | 0 |
| 160.613 | 0 |
| 160.079 | 0 |
| 159.546 | 0 |
| 159.015 | 0 |
| 158.486 | 0 |
| 157.959 | 0 |
| 157.433 | 0 |
| 156.91 | 0 |
| 156.387 | 0 |
| 155.867 | 0 |
| 155.348 | 0 |
| 154.832 | 0 |
| 154.316 | 0 |
| 153.803 | 0 |
| 153.291 | 0 |
| 152.781 | 0 |
| 152.273 | 0 |
| 151.766 | 0 |
| 151.261 | 0 |
| 150.758 | 0 |
| 150.256 | 0 |
| 149.756 | 0 |
| 149.258 | 0 |
| 148.761 | 0 |
| 148.266 | 0 |
| 147.773 | 0 |
| 147.281 | 0 |
| 146.791 | 0 |
| 146.303 | 0 |
| 145.816 | 0 |
| 145.331 | 0 |
| 144.847 | 0 |
| 144.365 | 0 |
| 143.885 | 0 |
| 143.406 | 0 |
| 142.929 | 0 |
| 142.453 | 0 |
| 141.979 | 0 |
| 141.507 | 0 |
| 141.036 | 0 |
| 140.567 | 0 |
| 140.099 | 0 |
| 139.633 | 0 |
| 139.168 | 0 |
| 138.705 | 0 |
| 138.244 | 0 |
| 137.784 | 0 |
| 137.325 | 0 |
| 136.868 | 0 |
| 136.413 | 0 |
| 135.959 | 0 |
| 135.506 | 0 |
| 135.056 | 0 |
| 134.606 | 0 |
| 134.158 | 0 |
| 133.712 | 0 |
| 133.267 | 0 |
| 132.823 | 0 |
| 132.382 | 0 |
| 131.941 | 0 |
| 131.502 | 0 |
| 131.064 | 0 |
| 130.628 | 0 |
| 130.194 | 0 |
| 129.76 | 0 |
| 129.329 | 0 |
| 128.898 | 0 |
| 128.469 | 0 |
| 128.042 | 0 |
| 127.616 | 0 |
| 127.191 | 0 |
| 126.768 | 0 |
| 126.346 | 0 |
| 125.926 | 0 |
| 125.507 | 0 |
| 125.089 | 0 |
| 124.673 | 0 |
| 124.258 | 0 |
| 123.845 | 0 |
| 123.433 | 0 |
| 123.022 | 0 |
| 122.613 | 0 |
| 122.205 | 0 |
| 121.798 | 0 |
| 121.393 | 0 |
| 120.989 | 0 |
| 120.586 | 0 |
| 120.185 | 0 |
| 119.785 | 0 |
| 119.386 | 0 |
| 118.989 | 0 |
| 118.593 | 0 |
| 118.199 | 0 |
| 117.805 | 0 |
| 117.413 | 0 |
| 117.023 | 0 |
| 116.633 | 0 |
| 116.245 | 0 |
| 115.858 | 0 |
| 115.473 | 0 |
| 115.089 | 0 |
| 114.706 | 0 |
| 114.324 | 0 |
| 113.944 | 0 |
| 113.565 | 0 |
| 113.187 | 0 |
| 112.81 | 0 |
| 112.435 | 0 |
| 112.061 | 0 |
| 111.688 | 0 |
| 111.316 | 0 |
| 110.946 | 0 |
| 110.577 | 0 |
| 110.209 | 0 |
| 109.842 | 0 |
| 109.476 | 0 |
| 109.112 | 0 |
| 108.749 | 0 |
| 108.387 | 0 |
| 108.027 | 0 |
| 107.667 | 0 |
| 107.309 | 0 |
| 106.952 | 0 |
| 106.596 | 0 |
| 106.241 | 0 |
| 105.888 | 0 |
| 105.535 | 0 |
| 105.184 | 0 |
| 104.834 | 0 |
| 104.485 | 0 |
| 104.138 | 0 |
| 103.791 | 0 |
| 103.446 | 0 |
| 103.102 | 0 |
| 102.759 | 0 |
| 102.417 | 0 |
| 102.076 | 0 |
| 101.736 | 0 |
| 101.398 | 0 |
| 101.06 | 0 |
| 100.724 | 0 |
| 100.389 | 0 |
| 100.055 | 0 |
| 99.7219 | 0 |
| 99.3901 | 0 |
| 99.0594 | 0 |
| 98.7298 | 0 |
| 98.4013 | 0 |
| 98.0738 | 0 |
| 97.7475 | 0 |
| 97.4223 | 0 |
| 97.0981 | 0 |
| 96.775 | 0 |
| 96.453 | 0 |
| 96.1321 | 0 |
| 95.8122 | 0 |
| 95.4934 | 0 |
| 95.1756 | 0 |
| 94.8589 | 0 |
| 94.5433 | 0 |
| 94.2287 | 0 |
| 93.9152 | 0 |
| 93.6027 | 0 |
| 93.2912 | 0 |
| 92.9808 | 0 |
| 92.6714 | 0 |
| 92.3631 | 0 |
| 92.0557 | 0 |
| 91.7494 | 0 |
| 91.4441 | 0 |
| 91.1399 | 0 |
| 90.8366 | 0 |
| 90.5344 | 0 |
| 90.2331 | 0 |
| 89.9329 | 0 |
| 89.6336 | 0 |
| 89.3354 | 0 |
| 89.0381 | 0 |
| 88.7418 | 0 |
| 88.4466 | 0 |
| 88.1523 | 0 |
| 87.8589 | 0 |
| 87.5666 | 0 |
| 87.2752 | 0 |
| 86.9848 | 0 |
| 86.6954 | 0 |
| 86.4069 | 0 |
| 86.1194 | 0 |
| 85.8329 | 0 |
| 85.5472 | 0 |
| 85.2626 | 0 |
| 84.9789 | 0 |
| 84.6961 | 0 |
| 84.4143 | 0 |
| 84.1334 | 0 |
| 83.8535 | 0 |
| 83.5745 | 0 |
| 83.2964 | 0 |
| 83.0192 | 0 |
| 82.743 | 0 |
| 82.4677 | 0 |
| 82.1933 | 0 |
| 81.9198 | 0 |
| 81.6472 | 0 |
| 81.3755 | 0 |
| 81.1047 | 0 |
| 80.8349 | 0 |
| 80.5659 | 0 |
| 80.2978 | 0 |
| 80.0306 | 0 |
| 79.7643 | 0 |
| 79.4989 | 0 |
| 79.2344 | 0 |
| 78.9707 | 0 |
| 78.708 | 0 |
| 78.4461 | 0 |
| 78.1851 | 0 |
| 77.9249 | 0 |
| 77.6656 | 0 |
| 77.4072 | 0 |
| 77.1496 | 0 |
| 76.8929 | 0 |
| 76.6371 | 0 |
| 76.3821 | 0 |
| 76.1279 | 0 |
| 75.8746 | 0 |
| 75.6221 | 0 |
| 75.3705 | 0 |
| 75.1197 | 0 |
| 74.8698 | 0 |
| 74.6206 | 0 |
| 74.3723 | 0 |
| 74.1249 | 0 |
| 73.8782 | 0 |
| 73.6324 | 0 |
| 73.3874 | 0 |
| 73.1432 | 0 |
| 72.8998 | 0 |
| 72.6573 | 0 |
| 72.4155 | 0 |
| 72.1745 | 0 |
| 71.9344 | 0 |
| 71.695 | 0 |
| 71.4565 | 0 |
| 71.2187 | 0 |
| 70.9817 | 0 |
| 70.7455 | 0 |
| 70.5101 | 0 |
| 70.2755 | 0 |
| 70.0417 | 0 |
| 69.8086 | 0 |
| 69.5763 | 0 |
| 69.3448 | 0 |
| 69.1141 | 0 |
| 68.8841 | 0 |
| 68.6549 | 0 |
| 68.4265 | 0 |
| 68.1988 | 0 |
| 67.9719 | 0 |
| 67.7457 | 0 |
| 67.5203 | 0 |
| 67.2956 | 0 |
| 67.0717 | 0 |
| 66.8485 | 0 |
| 66.6261 | 0 |
| 66.4044 | 0 |
| 66.1834 | 0 |
| 65.9632 | 0 |
| 65.7437 | 0 |
| 65.525 | 0 |
| 65.3069 | 0 |
| 65.0896 | 0 |
| 64.8731 | 0 |
| 64.6572 | 0 |
| 64.442 | 0 |
| 64.2276 | 0 |
| 64.0139 | 0 |
| 63.8009 | 0 |
| 63.5886 | 0 |
| 63.377 | 0 |
| 63.1661 | 0 |
| 62.956 | 0 |
| 62.7465 | 0 |
| 62.5377 | 0 |
| 62.3296 | 0 |
| 62.1222 | 0 |
| 61.9155 | 0 |
| 61.7095 | 0 |
| 61.5042 | 0 |
| 61.2995 | 0 |
| 61.0955 | 0 |
| 60.8922 | 0 |
| 60.6896 | 0 |
| 60.4877 | 0 |
| 60.2864 | 0 |
| 60.0858 | 0 |
| 59.8859 | 0 |
| 59.6866 | 0 |
| 59.488 | 0 |
| 59.2901 | 0 |
| 59.0928 | 0 |
| 58.8962 | 0 |
| 58.7002 | 0 |
| 58.5049 | 0 |
| 58.3102 | 0 |
| 58.1162 | 0 |
| 57.9228 | 0 |
| 57.7301 | 0 |
| 57.538 | 0 |
| 57.3465 | 0 |
| 57.1557 | 0 |
| 56.9655 | 0 |
| 56.776 | 0 |
| 56.5871 | 0 |
| 56.3988 | 0 |
| 56.2111 | 0 |
| 56.0241 | 0 |
| 55.8377 | 0 |
| 55.6519 | 0 |
| 55.4667 | 0 |
| 55.2821 | 0 |
| 55.0982 | 0 |
| 54.9148 | 0 |
| 54.7321 | 0 |
| 54.55 | 0 |
| 54.3685 | 0 |
| 54.1876 | 0 |
| 54.0073 | 0 |
| 53.8276 | 0 |
| 53.6485 | 0 |
| 53.47 | 0 |
| 53.292 | 0 |
| 53.1147 | 0 |
| 52.938 | 0 |
| 52.7618 | 0 |
| 52.5863 | 0 |
| 52.4113 | 0 |
| 52.2369 | 0 |
| 52.0631 | 0 |
| 51.8898 | 0 |
| 51.7172 | 0 |
| 51.5451 | 0 |
| 51.3736 | 0 |
| 51.2026 | 0 |
| 51.0323 | 0 |
| 50.8625 | 0 |
| 50.6932 | 0 |
| 50.5246 | 0 |
| 50.3564 | 0 |
| 50.1889 | 0 |
| 50.0219 | 0 |
| 49.8554 | 0 |
| 49.6895 | 0 |
| 49.5242 | 0 |
| 49.3594 | 0 |
| 49.1952 | 0 |
| 49.0315 | 0 |
| 48.8683 | 0 |
| 48.7057 | 0 |
| 48.5437 | 0 |
| 48.3821 | 0 |
| 48.2212 | 0 |
| 48.0607 | 0 |
| 47.9008 | 0 |
| 47.7414 | 0 |
| 47.5825 | 0 |
| 47.4242 | 0 |
| 47.2664 | 0 |
| 47.1091 | 0 |
| 46.9524 | 0 |
| 46.7962 | 0 |
| 46.6404 | 0 |
| 46.4853 | 0 |
| 46.3306 | 0 |
| 46.1764 | 0 |
| 46.0228 | 0 |
| 45.8696 | 0 |
| 45.717 | 0 |
| 45.5649 | 0 |
| 45.4133 | 0 |
| 45.2622 | 0 |
| 45.1116 | 0 |
| 44.9614 | 0 |
| 44.8118 | 0 |
| 44.6627 | 0 |
| 44.5141 | 0 |
| 44.366 | 0 |
| 44.2184 | 0 |
| 44.0712 | 0 |
| 43.9246 | 0 |
| 43.7785 | 0 |
| 43.6328 | 0 |
| 43.4876 | 0 |
| 43.3429 | 0 |
| 43.1987 | 0 |
| 43.0549 | 0 |
| 42.9117 | 0 |
| 42.7689 | 0 |
| 42.6266 | 0 |
| 42.4847 | 0 |
| 42.3434 | 0 |
| 42.2025 | 0 |
| 42.0621 | 0 |
| 41.9221 | 0 |
| 41.7826 | 0 |
| 41.6436 | 0 |
| 41.505 | 0 |
| 41.3669 | 0 |
| 41.2293 | 0 |
| 41.0921 | 0 |
| 40.9553 | 0 |
| 40.8191 | 0 |
| 40.6832 | 0 |
| 40.5479 | 0 |
| 40.413 | 0 |
| 40.2785 | 0 |
| 40.1445 | 0 |
| 40.0109 | 0 |
| 39.8777 | 0 |
| 39.7451 | 0 |
| 39.6128 | 0 |
| 39.481 | 0 |
| 39.3496 | 0 |
| 39.2187 | 0 |
| 39.0882 | 0 |
| 38.9581 | 0 |
| 38.8285 | 0 |
| 38.6993 | 0 |
| 38.5705 | 0 |
| 38.4422 | 0 |
| 38.3143 | 0 |
| 38.1868 | 0 |
| 38.0597 | 0 |
| 37.9331 | 0 |
| 37.8069 | 0 |
| 37.6811 | 0 |
| 37.5557 | 0 |
| 37.4307 | 0 |
| 37.3062 | 0 |
| 37.1821 | 0 |
| 37.0583 | 0 |
| 36.935 | 0 |
| 36.8121 | 0 |
| 36.6896 | 0 |
| 36.5676 | 0 |
| 36.4459 | 0 |
| 36.3246 | 0 |
| 36.2037 | 0 |
| 36.0833 | 0 |
| 35.9632 | 0 |
| 35.8435 | 0 |
| 35.7243 | 0 |
| 35.6054 | 0 |
| 35.4869 | 0 |
| 35.3689 | 0 |
| 35.2512 | 0 |
| 35.1339 | 0 |
| 35.017 | 0 |
| 34.9004 | 0 |
| 34.7843 | 0 |
| 34.6686 | 0 |
| 34.5532 | 0 |
| 34.4382 | 0 |
| 34.3237 | 0 |
| 34.2094 | 0 |
| 34.0956 | 0 |
| 33.9822 | 0 |
| 33.8691 | 0 |
| 33.7564 | 0 |
| 33.6441 | 0 |
| 33.5321 | 0 |
| 33.4206 | 0 |
| 33.3093 | 0 |
| 33.1985 | 0 |
| 33.088 | 0 |
| 32.9779 | 0 |
| 32.8682 | 0 |
| 32.7589 | 0 |
| 32.6498 | 0 |
| 32.5412 | 0 |
| 32.4329 | 0 |
| 32.325 | 0 |
| 32.2175 | 0 |
| 32.1103 | 0 |
| 32.0034 | 0 |
| 31.8969 | 0 |
| 31.7908 | 0 |
| 31.685 | 0 |
| 31.5796 | 0 |
| 31.4745 | 0 |
| 31.3698 | 0 |
| 31.2654 | 0 |
| 31.1614 | 0 |
| 31.0577 | 0 |
| 30.9543 | 0 |
| 30.8513 | 0 |
| 30.7487 | 0 |
| 30.6464 | 0 |
| 30.5444 | 0 |
| 30.4427 | 0 |
| 30.3415 | 0 |
| 30.2405 | 0 |
| 30.1399 | 0 |
| 30.0396 | 0 |
| 29.9396 | 0 |
| 29.84 | 0 |
| 29.7407 | 0 |
| 29.6418 | 0 |
| 29.5431 | 0 |
| 29.4448 | 0 |
| 29.3468 | 0 |
| 29.2492 | 0 |
| 29.1519 | 0 |
| 29.0549 | 0 |
| 28.9582 | 0 |
| 28.8618 | 0 |
| 28.7658 | 0 |
| 28.6701 | 0 |
| 28.5747 | 0 |
| 28.4796 | 0 |
| 28.3848 | 0 |
| 28.2904 | 0 |
| 28.1963 | 0 |
| 28.1024 | 0 |
| 28.0089 | 0 |
| 27.9157 | 0 |
| 27.8228 | 0 |
| 27.7303 | 0 |
| 27.638 | 0 |
| 27.546 | 0 |
| 27.4544 | 0 |
| 27.363 | 0 |
| 27.272 | 0 |
| 27.1812 | 0 |
| 27.0908 | 0 |
| 27.0006 | 0 |
| 26.9108 | 0 |
| 26.8213 | 0 |
| 26.732 | 0 |
| 26.6431 | 0 |
| 26.5544 | 0 |
| 26.4661 | 0 |
| 26.378 | 0 |
| 26.2902 | 0 |
| 26.2027 | 0 |
| 26.1156 | 0 |
| 26.0287 | 0 |
| 25.9421 | 0 |
| 25.8557 | 0 |
| 25.7697 | 0 |
| 25.684 | 0 |
| 25.5985 | 0 |
| 25.5133 | 0 |
| 25.4284 | 0 |
| 25.3438 | 0 |
| 25.2595 | 0 |
| 25.1754 | 0 |
| 25.0917 | 0 |
| 25.0082 | 0 |
| 24.925 | 0 |
| 24.842 | 0 |
| 24.7594 | 0 |
| 24.677 | 0 |
| 24.5949 | 0 |
| 24.513 | 0 |
| 24.4315 | 0 |
| 24.3502 | 0 |
| 24.2691 | 0 |
| 24.1884 | 0 |
| 24.1079 | 0 |
| 24.0277 | 0 |
| 23.9477 | 0 |
| 23.8681 | 0 |
| 23.7886 | 0 |
| 23.7095 | 0 |
| 23.6306 | 0 |
| 23.552 | 0 |
| 23.4736 | 0 |
| 23.3955 | 0 |
| 23.3176 | 0 |
| 23.2401 | 0 |
| 23.1627 | 0 |
| 23.0857 | 0 |
| 23.0088 | 0 |
| 22.9323 | 0 |
| 22.856 | 0 |
| 22.7799 | 0 |
| 22.7041 | 0 |
| 22.6286 | 0 |
| 22.5533 | 0 |
| 22.4782 | 0 |
| 22.4034 | 0 |
| 22.3289 | 0 |
| 22.2546 | 0 |
| 22.1805 | 0 |
| 22.1067 | 0 |
| 22.0332 | 0 |
| 21.9599 | 0 |
| 21.8868 | 0 |
| 21.814 | 0 |
| 21.7414 | 0 |
| 21.669 | 0 |
| 21.5969 | 0 |
| 21.5251 | 0 |
| 21.4535 | 0 |
| 21.3821 | 0 |
| 21.3109 | 0 |
| 21.24 | 0 |
| 21.1693 | 0 |
| 21.0989 | 0 |
| 21.0287 | 0 |
| 20.9587 | 0 |
| 20.889 | 0 |
| 20.8195 | 0 |
| 20.7502 | 0 |
| 20.6812 | 0 |
| 20.6123 | 0 |
| 20.5438 | 0 |
| 20.4754 | 0 |
| 20.4073 | 0 |
| 20.3394 | 0 |
| 20.2717 | 0 |
| 20.2042 | 0 |
| 20.137 | 0 |
| 20.07 | 0 |
| 20.0032 | 0 |
| 19.9367 | 0 |
| 19.8703 | 0 |
| 19.8042 | 0 |
| 19.7383 | 0 |
| 19.6726 | 0 |
| 19.6072 | 0 |
| 19.5419 | 0 |
| 19.4769 | 0 |
| 19.4121 | 0 |
| 19.3475 | 0 |
| 19.2831 | 0 |
| 19.219 | 0 |
| 19.155 | 0 |
| 19.0913 | 0 |
| 19.0278 | 0 |
| 18.9644 | 0 |
| 18.9013 | 0 |
| 18.8385 | 0 |
| 18.7758 | 0 |
| 18.7133 | 0 |
| 18.651 | 0 |
| 18.589 | 0 |
| 18.5271 | 0 |
| 18.4655 | 0 |
| 18.404 | 0 |
| 18.3428 | 0 |
| 18.2817 | 0 |
| 18.2209 | 0 |
| 18.1603 | 0 |
| 18.0999 | 0 |
| 18.0396 | 0 |
| 17.9796 | 0 |
| 17.9198 | 0 |
| 17.8602 | 0 |
| 17.8007 | 0 |
| 17.7415 | 0 |
| 17.6825 | 0 |
| 17.6236 | 0 |
| 17.565 | 0 |
| 17.5065 | 0 |
| 17.4483 | 0 |
| 17.3902 | 0 |
| 17.3324 | 0 |
| 17.2747 | 0 |
| 17.2172 | 0 |
| 17.1599 | 0 |
| 17.1028 | 0 |
| 17.0459 | 0 |
| 16.9892 | 0 |
| 16.9327 | 0 |
| 16.8763 | 0 |
| 16.8202 | 0 |
| 16.7642 | 0 |
| 16.7084 | 0 |
| 16.6528 | 0 |
| 16.5974 | 0 |
| 16.5422 | 0 |
| 16.4871 | 0 |
| 16.4323 | 0 |
| 16.3776 | 0 |
| 16.3231 | 0 |
| 16.2688 | 0 |
| 16.2147 | 0 |
| 16.1607 | 0 |
| 16.1069 | 0 |
| 16.0533 | 0 |
| 15.9999 | 0 |
| 15.9467 | 0 |
| 15.8936 | 0 |
| 15.8407 | 0 |
| 15.788 | 0 |
| 15.7355 | 0 |
| 15.6831 | 0 |
| 15.631 | 0 |
| 15.5789 | 0 |
| 15.5271 | 0 |
| 15.4754 | 0 |
| 15.424 | 0 |
| 15.3726 | 0 |
| 15.3215 | 0 |
| 15.2705 | 0 |
| 15.2197 | 0 |
| 15.169 | 0 |
| 15.1186 | 0 |
| 15.0683 | 0 |
| 15.0181 | 0 |
| 14.9682 | 0 |
| 14.9183 | 0 |
| 14.8687 | 0 |
| 14.8192 | 0 |
| 14.7699 | 0 |
| 14.7208 | 0 |
| 14.6718 | 0 |
| 14.623 | 0 |
| 14.5743 | 0 |
| 14.5258 | 0 |
| 14.4775 | 0 |
| 14.4293 | 0 |
| 14.3813 | 0 |
| 14.3335 | 0 |
| 14.2858 | 0 |
| 14.2382 | 0 |
| 14.1909 | 0 |
| 14.1436 | 0 |
| 14.0966 | 0 |
| 14.0497 | 0 |
| 14.0029 | 0 |
| 13.9563 | 0 |
| 13.9099 | 0 |
| 13.8636 | 0 |
| 13.8175 | 0 |
| 13.7715 | 0 |
| 13.7257 | 0 |
| 13.68 | 0 |
| 13.6345 | 0 |
| 13.5891 | 0 |
| 13.5439 | 0 |
| 13.4988 | 0 |
| 13.4539 | 0 |
| 13.4091 | 0 |
| 13.3645 | 0 |
| 13.3201 | 0 |
| 13.2757 | 0 |
| 13.2316 | 0 |
| 13.1875 | 0 |
| 13.1437 | 0 |
| 13.0999 | 0 |
| 13.0563 | 0 |
| 13.0129 | 0 |
| 12.9696 | 0 |
| 12.9264 | 0 |
| 12.8834 | 0 |
| 12.8406 | 0 |
| 12.7978 | 0 |
| 12.7552 | 0 |
| 12.7128 | 0 |
| 12.6705 | 0 |
| 12.6283 | 0 |
| 12.5863 | 0 |
| 12.5444 | 0 |
| 12.5027 | 0 |
| 12.4611 | 0 |
| 12.4196 | 0 |
| 12.3783 | 0 |
| 12.3371 | 0 |
| 12.2961 | 0 |
| 12.2552 | 0 |
| 12.2144 | 0 |
| 12.1737 | 0 |
| 12.1332 | 0 |
| 12.0929 | 0 |
| 12.0526 | 0 |
| 12.0125 | 0 |
| 11.9725 | 0 |
| 11.9327 | 0 |
| 11.893 | 0 |
| 11.8534 | 0 |
| 11.814 | 0 |
| 11.7747 | 0 |
| 11.7355 | 0 |
| 11.6964 | 0 |
| 11.6575 | 0 |
| 11.6187 | 0 |
| 11.5801 | 0 |
| 11.5415 | 0 |
| 11.5031 | 0 |
| 11.4649 | 0 |
| 11.4267 | 0 |
| 11.3887 | 0 |
| 11.3508 | 0 |
| 11.313 | 0 |
| 11.2754 | 0 |
| 11.2379 | 0 |
| 11.2005 | 0 |
| 11.1632 | 0 |
| 11.1261 | 0 |
| 11.089 | 0 |
| 11.0521 | 0 |
| 11.0154 | 0 |
| 10.9787 | 0 |
| 10.9422 | 0 |
| 10.9058 | 0 |
| 10.8695 | 0 |
| 10.8333 | 0 |
| 10.7973 | 0 |
| 10.7613 | 0 |
| 10.7255 | 0 |
| 10.6899 | 0 |
| 10.6543 | 0 |
| 10.6188 | 0 |
| 10.5835 | 0 |
| 10.5483 | 0 |
| 10.5132 | 0 |
| 10.4782 | 0 |
| 10.4433 | 0 |
| 10.4086 | 0 |
| 10.374 | 0 |
| 10.3394 | 0 |
| 10.305 | 0 |
| 10.2707 | 0 |
| 10.2366 | 0 |
| 10.2025 | 0 |
| 10.1686 | 0 |
| 10.1347 | 0 |
| 10.101 | 0 |
| 10.0674 | 0 |
| 10.0339 | 0 |
| 10.0005 | 0 |
| 9.96723 | 0 |
| 9.93406 | 0 |
| 9.90101 | 0 |
| 9.86806 | 0 |
| 9.83523 | 0 |
| 9.8025 | 0 |
| 9.76989 | 0 |
| 9.73738 | 0 |
| 9.70498 | 0 |
| 9.67268 | 0 |
| 9.6405 | 0 |
| 9.60842 | 0 |
| 9.57645 | 0 |
| 9.54458 | 0 |
| 9.51283 | 0 |
| 9.48117 | 0 |
| 9.44962 | 0 |
| 9.41818 | 0 |
| 9.38684 | 0 |
| 9.35561 | 0 |
| 9.32448 | 0 |
| 9.29345 | 0 |
| 9.26253 | 0 |
| 9.23171 | 0 |
| 9.20099 | 0 |
| 9.17038 | 0 |
| 9.13986 | 0 |
| 9.10945 | 0 |
| 9.07914 | 0 |
| 9.04893 | 0 |
| 9.01882 | 0 |
| 8.98881 | 0 |
| 8.9589 | 0 |
| 8.92909 | 0 |
| 8.89938 | 0 |
| 8.86977 | 0 |
| 8.84025 | 0 |
| 8.81084 | 0 |
| 8.78152 | 0 |
| 8.7523 | 0 |
| 8.72318 | 0 |
| 8.69415 | 0 |
| 8.66522 | 0 |
| 8.63639 | 0 |
| 8.60765 | 0 |
| 8.57901 | 0 |
| 8.55047 | 0 |
| 8.52202 | 0 |
| 8.49366 | 0 |
| 8.4654 | 0 |
| 8.43723 | 0 |
| 8.40915 | 0 |
| 8.38117 | 0 |
| 8.35329 | 0 |
| 8.32549 | 0 |
| 8.29779 | 0 |
| 8.27018 | 0 |
| 8.24266 | 0 |
| 8.21523 | 0 |
| 8.1879 | 0 |
| 8.16065 | 0 |
| 8.1335 | 0 |
| 8.10644 | 0 |
| 8.07946 | 0 |
| 8.05258 | 0 |
| 8.02578 | 0 |
| 7.99908 | 0 |
| 7.97246 | 0 |
| 7.94594 | 0 |
| 7.9195 | 0 |
| 7.89314 | 0 |
| 7.86688 | 0 |
| 7.8407 | 0 |
| 7.81461 | 0 |
| 7.78861 | 0 |
| 7.7627 | 0 |
| 7.73687 | 0 |
| 7.71112 | 0 |
| 7.68546 | 0 |
| 7.65989 | 0 |
| 7.6344 | 0 |
| 7.609 | 0 |
| 7.58368 | 0 |
| 7.55845 | 0 |
| 7.5333 | 0 |
| 7.50823 | 0 |
| 7.48325 | 0 |
| 7.45835 | 0 |
| 7.43353 | 0 |
| 7.4088 | 0 |
| 7.38415 | 0 |
| 7.35957 | 0 |
| 7.33509 | 0 |
| 7.31068 | 0 |
| 7.28635 | 0 |
| 7.26211 | 0 |
| 7.23794 | 0 |
| 7.21386 | 0 |
| 7.18986 | 0 |
| 7.16593 | 0 |
| 7.14209 | 0 |
| 7.11833 | 0 |
| 7.09464 | 0 |
| 7.07103 | 0 |
| 7.0475 | 0 |
| 7.02405 | 0 |
| 7.00068 | 0 |
| 6.97739 | 0 |
| 6.95417 | 0 |
| 6.93103 | 0 |
| 6.90797 | 0 |
| 6.88498 | 0 |
| 6.86207 | 0 |
| 6.83924 | 0 |
| 6.81648 | 0 |
| 6.7938 | 0 |
| 6.7712 | 0 |
| 6.74867 | 0 |
| 6.72621 | 0 |
| 6.70383 | 0 |
| 6.68152 | 0 |
| 6.65929 | 0 |
| 6.63713 | 0 |
| 6.61505 | 0 |
| 6.59304 | 0 |
| 6.5711 | 0 |
| 6.54923 | 0 |
| 6.52744 | 0 |
| 6.50572 | 0 |
| 6.48408 | 0 |
| 6.4625 | 0 |
| 6.441 | 0 |
| 6.41957 | 0 |
| 6.3982 | 0 |
| 6.37691 | 0 |
| 6.3557 | 0 |
| 6.33455 | 0 |
| 6.31347 | 0 |
| 6.29246 | 0 |
| 6.27153 | 0 |
| 6.25066 | 0 |
| 6.22986 | 0 |
| 6.20913 | 0 |
| 6.18847 | 0 |
| 6.16788 | 0 |
| 6.14735 | 0 |
| 6.1269 | 0 |
| 6.10651 | 0 |
| 6.08619 | 0 |
| 6.06594 | 0 |
| 6.04576 | 0 |
| 6.02564 | 0 |
| 6.00559 | 0 |
| 5.98561 | 0 |
| 5.96569 | 0 |
| 5.94584 | 0 |
| 5.92606 | 0 |
| 5.90634 | 0 |
| 5.88669 | 0 |
| 5.8671 | 0 |
| 5.84758 | 0 |
| 5.82812 | 0 |
| 5.80873 | 0 |
| 5.7894 | 0 |
| 5.77013 | 0 |
| 5.75093 | 0 |
| 5.7318 | 0 |
| 5.71273 | 0 |
| 5.69372 | 0 |
| 5.67477 | 0 |
| 5.65589 | 0 |
| 5.637069999999999 | 0 |
| 5.61831 | 0 |
| 5.59962 | 0 |
| 5.58099 | 0 |
| 5.56242 | 0 |
| 5.54391 | 0 |
| 5.52546 | 0 |
| 5.50708 | 0 |
| 5.48875 | 0 |
| 5.47049 | 0 |
| 5.45229 | 0 |
| 5.43414 | 0 |
| 5.41606 | 0 |
| 5.39804 | 0 |
| 5.38008 | 0 |
| 5.36218 | 0 |
| 5.34433 | 0 |
| 5.32655 | 0 |
| 5.30883 | 0 |
| 5.29116 | 0 |
| 5.27356 | 0 |
| 5.25601 | 0 |
| 5.23852 | 0 |
| 5.22109 | 0 |
| 5.20372 | 0 |
| 5.1864 | 0 |
| 5.16914 | 0 |
| 5.15194 | 0 |
| 5.1348 | 0 |
| 5.11772 | 0 |
| 5.10069 | 0 |
| 5.08372 | 0 |
| 5.0668 | 0 |
| 5.04994 | 0 |
| 5.03314 | 0 |
| 5.01639 | 0 |
| 4.9997 | 0 |
| 4.98306 | 0 |
| 4.96648 | 0 |
| 4.94996 | 0 |
| 4.93348 | 0 |
| 4.91707 | 0 |
| 4.90071 | 0 |
| 4.8844 | 0 |
| 4.86815 | 0 |
| 4.85195 | 0 |
| 4.83581 | 0 |
| 4.81972 | 0 |
| 4.80368 | 0 |
| 4.787689999999999 | 0 |
| 4.77176 | 0 |
| 4.75589 | 0 |
| 4.74006 | 0 |
| 4.72429 | 0 |
| 4.70857 | 0 |
| 4.6929 | 0 |
| 4.67729 | 0 |
| 4.66172 | 0 |
| 4.64621 | 0 |
| 4.63075 | 0 |
| 4.61534 | 0 |
| 4.59999 | 0 |
| 4.58468 | 0 |
| 4.56942 | 0 |
| 4.55422 | 0 |
| 4.53907 | 0 |
| 4.52396 | 0 |
| 4.50891 | 0 |
| 4.49391 | 0 |
| 4.47895 | 0 |
| 4.46405 | 0 |
| 4.4492 | 0 |
| 4.43439 | 0 |
| 4.41964 | 0 |
| 4.40493 | 0 |
| 4.39027 | 0 |
| 4.37567 | 0 |
| 4.36111 | 0 |
| 4.34659 | 0 |
| 4.33213 | 0 |
| 4.31772 | 0 |
| 4.30335 | 0 |
| 4.28903 | 0 |
| 4.27476 | 0 |
| 4.26054 | 0 |
| 4.24636 | 0 |
| 4.23223 | 0 |
| 4.21815 | 0 |
| 4.20411 | 0 |
| 4.19012 | 0 |
| 4.17618 | 0 |
| 4.16228 | 0 |
| 4.14843 | 0 |
| 4.13463 | 0 |
| 4.12087 | 0 |
| 4.10716 | 0 |
| 4.0935 | 0 |
| 4.07987 | 0 |
| 4.0663 | 0 |
| 4.05277 | 0 |
| 4.03928 | 0 |
| 4.02584 | 0 |
| 4.01245 | 0 |
| 3.9991 | 0 |
| 3.98579 | 0 |
| 3.97253 | 0 |
| 3.95931 | 0 |
| 3.94613 | 0 |
| 3.933 | 0 |
| 3.91992 | 0 |
| 3.90687 | 0 |
| 3.89387 | 0 |
| 3.88092 | 0 |
| 3.868 | 0 |
| 3.85513 | 0 |
| 3.84231 | 0 |
| 3.82952 | 0 |
| 3.81678 | 0 |
| 3.80408 | 0 |
| 3.79142 | 0 |
| 3.77881 | 0 |
| 3.76623 | 0 |
| 3.7537 | 0 |
| 3.74121 | 0 |
| 3.72876 | 0 |
| 3.71635 | 0 |
| 3.70399 | 0 |
| 3.69166 | 0 |
| 3.67938 | 0 |
| 3.66714 | 0 |
| 3.65493 | 0 |
| 3.64277 | 0 |
| 3.63065 | 0 |
| 3.61857 | 0 |
| 3.60653 | 0 |
| 3.59453 | 0 |
| 3.58257 | 0 |
| 3.57065 | 0 |
| 3.55877 | 0 |
| 3.54693 | 0 |
| 3.53512 | 0 |
| 3.52336 | 0 |
| 3.51164 | 0 |
| 3.49995 | 0 |
| 3.48831 | 0 |
| 3.4767 | 0 |
| 3.46513 | 0 |
| 3.4536 | 0 |
| 3.44211 | 0 |
| 3.43066 | 0 |
| 3.41924 | 0 |
| 3.40786 | 0 |
| 3.39652 | 0 |
| 3.38522 | 0 |
| 3.37396 | 0 |
| 3.36273 | 0 |
| 3.35154 | 0 |
| 3.34039 | 0 |
| 3.32928 | 0 |
| 3.3182 | 0 |
| 3.30716 | 0 |
| 3.29615 | 0 |
| 3.28519 | 0 |
| 3.27425 | 0 |
| 3.26336 | 0 |
| 3.2525 | 0 |
| 3.24168 | 0 |
| 3.23089 | 0 |
| 3.22014 | 0 |
| 3.20943 | 0 |
| 3.19875 | 0 |
| 3.1881 | 0 |
| 3.1775 | 0 |
| 3.16692 | 0 |
| 3.15639 | 0 |
| 3.14588 | 0 |
| 3.13542 | 0 |
| 3.12498 | 0 |
| 3.11458 | 0 |
| 3.10422 | 0 |
| 3.09389 | 0 |
| 3.0836 | 0 |
| 3.07334 | 0 |
| 3.06311 | 0 |
| 3.05292 | 0 |
| 3.04276 | 0 |
| 3.03263 | 0 |
| 3.02254 | 0 |
| 3.01249 | 0 |
| 3.00246 | 0 |
| 2.99247 | 0 |
| 2.98252 | 0 |
| 2.97259 | 0 |
| 2.9627 | 0 |
| 2.95284 | 0 |
| 2.94302 | 0 |
| 2.93322 | 0 |
| 2.92346 | 0 |
| 2.91374 | 0 |
| 2.90404 | 0 |
| 2.89438 | 0 |
| 2.88475 | 0 |
| 2.87515 | 0 |
| 2.86558 | 0 |
| 2.85605 | 0 |
| 2.84654 | 0 |
| 2.83707 | 0 |
| 2.82763 | 0 |
| 2.81822 | 0 |
| 2.80885 | 0 |
| 2.7995 | 0 |
| 2.79018 | 0 |
| 2.7809 | 0 |
| 2.77165 | 0 |
| 2.76242 | 0 |
| 2.75323 | 0 |
| 2.74407 | 0 |
| 2.73494 | 0 |
| 2.72584 | 0 |
| 2.71677 | 0 |
| 2.70773 | 0 |
| 2.69872 | 0 |
| 2.68974 | 0 |
| 2.68079 | 0 |
| 2.67187 | 0 |
| 2.66298 | 0 |
| 2.65412 | 0 |
| 2.64529 | 0 |
| 2.63649 | 0 |
| 2.62771 | 0 |
| 2.61897 | 0 |
| 2.61026 | 0 |
| 2.60157 | 0 |
| 2.59291 | 0 |
| 2.58429 | 0 |
| 2.57569 | 0 |
| 2.56712 | 0 |
| 2.55857 | 0 |
| 2.55006 | 0 |
| 2.54158 | 0 |
| 2.53312 | 0 |
| 2.52469 | 0 |
| 2.51629 | 0 |
| 2.50792 | 0 |
| 2.49957 | 0 |
| 2.49125 | 0 |
| 2.48297 | 0 |
| 2.4747 | 0 |
| 2.46647 | 0 |
| 2.45826 | 0 |
| 2.45008 | 0 |
| 2.44193 | 0 |
| 2.4338 | 0 |
| 2.42571 | 0 |
| 2.41764 | 0 |
| 2.40959 | 0 |
| 2.40157 | 0 |
| 2.39358 | 0 |
| 2.38562 | 0 |
| 2.37768 | 0 |
| 2.36977 | 0 |
| 2.36188 | 0 |
| 2.35402 | 0 |
| 2.34619 | 0 |
| 2.33838 | 0 |
| 2.3306 | 0 |
| 2.32285 | 0 |
| 2.31512 | 0 |
| 2.30742 | 0 |
| 2.29974 | 0 |
| 2.29209 | 0 |
| 2.28446 | 0 |
| 2.27686 | 0 |
| 2.26928 | 0 |
| 2.26173 | 0 |
| 2.25421 | 0 |
| 2.2467 | 0 |
| 2.23923 | 0 |
| 2.23178 | 0 |
| 2.22435 | 0 |
| 2.21695 | 0 |
| 2.20957 | 0 |
| 2.20222 | 0 |
| 2.19489 | 0 |
| 2.18759 | 0 |
| 2.18031 | 0 |
| 2.17306 | 0 |
| 2.16583 | 0 |
| 2.15862 | 0 |
| 2.15144 | 0 |
| 2.14428 | 0 |
| 2.13714 | 0 |
| 2.13003 | 0 |
| 2.12294 | 0 |
| 2.11588 | 0 |
| 2.10884 | 0 |
| 2.10182 | 0 |
| 2.09483 | 0 |
| 2.08786 | 0 |
| 2.08091 | 0 |
| 2.07399 | 0 |
| 2.06709 | 0 |
| 2.06021 | 0 |
| 2.05335 | 0 |
| 2.04652 | 0 |
| 2.03971 | 0 |
| 2.03292 | 0 |
| 2.02616 | 0 |
| 2.01942 | 0 |
| 2.0127 | 0 |
| 2.006 | 0 |
| 1.99933 | 0 |
| 1.99267 | 0 |
| 1.98604 | 0 |
| 1.97944 | 0 |
| 1.97285 | 0 |
| 1.96628 | 0 |
| 1.95974 | 0 |
| 1.95322 | 0 |
| 1.94672 | 0 |
| 1.94024 | 0 |
| 1.93379 | 0 |
| 1.92735 | 0 |
| 1.92094 | 0 |
| 1.91455 | 0 |
| 1.90818 | 0 |
| 1.90183 | 0 |
| 1.8955 | 0 |
| 1.88919 | 0 |
| 1.88291 | 0 |
| 1.87664 | 0.001 |
| 1.8704 | 0 |
| 1.86417 | 0 |
| 1.85797 | 0 |
| 1.85179 | 0 |
| 1.84563 | 0 |
| 1.83949 | 0 |
| 1.83337 | 0 |
| 1.82726 | 0 |
| 1.82118 | 0 |
| 1.81512 | 0 |
| 1.80909 | 0 |
| 1.80307 | 0 |
| 1.79707 | 0 |
| 1.79109 | 0 |
| 1.78513 | 0 |
| 1.77919 | 0 |
| 1.77327 | 0 |
| 1.76737 | 0 |
| 1.76149 | 0 |
| 1.75562 | 0 |
| 1.74978 | 0 |
| 1.74396 | 0 |
| 1.73816 | 0 |
| 1.73237 | 0 |
| 1.72661 | 0 |
| 1.72086 | 0 |
| 1.71514 | 0 |
| 1.70943 | 0 |
| 1.70374 | 0 |
| 1.69807 | 0 |
| 1.69242 | 0 |
| 1.68679 | 0 |
| 1.68118 | 0 |
| 1.67559 | 0 |
| 1.67001 | 0 |
| 1.66445 | 0 |
| 1.65892 | 0 |
| 1.6534 | 0 |
| 1.64789 | 0 |
| 1.64241 | 0 |
| 1.63695 | 0 |
| 1.6315 | 0 |
| 1.62607 | 0 |
| 1.62066 | 0 |
| 1.61527 | 0 |
| 1.60989 | 0 |
| 1.60454 | 0 |
| 1.5992 | 0 |
| 1.59388 | 0 |
| 1.58857 | 0 |
| 1.58329 | 0 |
| 1.57802 | 0 |
| 1.57277 | 0 |
| 1.56753 | 0 |
| 1.56232 | 0 |
| 1.55712 | 0 |
| 1.55194 | 0 |
| 1.54677 | 0 |
| 1.54163 | 0 |
| 1.5365 | 0 |
| 1.53139 | 0 |
| 1.52629 | 0 |
| 1.52121 | 0 |
| 1.51615 | 0 |
| 1.5111 | 0 |
| 1.50608 | 0 |
| 1.50107 | 0 |
| 1.49607 | 0 |
| 1.49109 | 0 |
| 1.48613 | 0 |
| 1.48119 | 0 |
| 1.47626 | 0 |
| 1.47135 | 0 |
| 1.46645 | 0 |
| 1.46157 | 0 |
| 1.45671 | 0 |
| 1.45186 | 0 |
| 1.44703 | 0 |
| 1.44221 | 0 |
| 1.43742 | 0 |
| 1.43263 | 0 |
| 1.42787 | 0 |
| 1.42311 | 0 |
| 1.41838 | 0 |
| 1.41366 | 0 |
| 1.40896 | 0 |
| 1.40427 | 0 |
| 1.39959 | 0 |
| 1.39494 | 0 |
| 1.3903 | 0 |
| 1.38567 | 0 |
| 1.38106 | 0 |
| 1.37646 | 0 |
| 1.37188 | 0 |
| 1.36732 | 0 |
| 1.36277 | 0 |
| 1.35823 | 0 |
| 1.35372 | 0 |
| 1.34921 | 0 |
| 1.34472 | 0 |
| 1.34025 | 0 |
| 1.33579 | 0 |
| 1.33134 | 0 |
| 1.32691 | 0 |
| 1.3225 | 0 |
| 1.3181 | 0 |
| 1.31371 | 0 |
| 1.30934 | 0 |
| 1.30498 | 0 |
| 1.30064 | 0 |
| 1.29631 | 0 |
| 1.292 | 0 |
| 1.2877 | 0 |
| 1.28342 | 0.001 |
| 1.27915 | 0 |
| 1.27489 | 0 |
| 1.27065 | 0 |
| 1.26642 | 0 |
| 1.26221 | 0 |
| 1.25801 | 0 |
| 1.25382 | 0 |
| 1.24965 | 0 |
| 1.24549 | 0 |
| 1.24135 | 0 |
| 1.23721 | 0 |
| 1.2331 | 0 |
| 1.22899 | 0 |
| 1.22491 | 0 |
| 1.22083 | 0 |
| 1.21677 | 0 |
| 1.21272 | 0 |
| 1.20868 | 0 |
| 1.20466 | 0 |
| 1.20065 | 0 |
| 1.19666 | 0 |
| 1.19268 | 0 |
| 1.18871 | 0 |
| 1.18475 | 0 |
| 1.18081 | 0 |
| 1.17688 | 0 |
| 1.17297 | 0 |
| 1.16906 | 0 |
| 1.16517 | 0 |
| 1.1613 | 0 |
| 1.15743 | 0 |
| 1.15358 | 0 |
| 1.14974 | 0 |
| 1.14592 | 0 |
| 1.1421 | 0 |
| 1.1383 | 0 |
| 1.13452 | 0 |
| 1.13074 | 0 |
| 1.12698 | 0 |
| 1.12323 | 0 |
| 1.11949 | 0 |
| 1.11577 | 0 |
| 1.11205 | 0 |
| 1.10835 | 0 |
| 1.10466 | 0 |
| 1.10099 | 0 |
| 1.09733 | 0 |
| 1.09367 | 0 |
| 1.09003 | 0 |
| 1.08641 | 0 |
| 1.08279 | 0.001 |
| 1.07919 | 0 |
| 1.0756 | 0 |
| 1.07202 | 0 |
| 1.06845 | 0 |
| 1.0649 | 0 |
| 1.06135 | 0 |
| 1.05782 | 0 |
| 1.0543 | 0 |
| 1.0508 | 0 |
| 1.0473 | 0 |
| 1.04381 | 0 |
| 1.04034 | 0 |
| 1.03688 | 0 |
| 1.03343 | 0 |
| 1.02999 | 0 |
| 1.02656 | 0 |
| 1.02315 | 0 |
| 1.01974 | 0 |
| 1.01635 | 0 |
| 1.01297 | 0.001 |
| 1.0096 | 0 |
| 1.00624 | 0 |
| 1.00289 | 0 |
| 0.999553 | 0 |
| 0.996227 | 0 |
| 0.992912 | 0 |
| 0.989608 | 0 |
| 0.986315 | 0 |
| 0.983033 | 0 |
| 0.979762 | 0 |
| 0.976502 | 0 |
| 0.973253 | 0 |
| 0.970014 | 0 |
| 0.966787 | 0 |
| 0.96357 | 0 |
| 0.960364 | 0 |
| 0.957168 | 0 |
| 0.953983 | 0 |
| 0.950809 | 0 |
| 0.947645 | 0 |
| 0.944492 | 0 |
| 0.941349 | 0 |
| 0.938217 | 0 |
| 0.935095 | 0 |
| 0.931984 | 0 |
| 0.928883 | 0 |
| 0.925792 | 0 |
| 0.922711 | 0 |
| 0.919641 | 0 |
| 0.916581 | 0 |
| 0.913531 | 0 |
| 0.910492 | 0 |
| 0.907462 | 0 |
| 0.904442 | 0 |
| 0.901433 | 0 |
| 0.898434 | 0 |
| 0.895444 | 0 |
| 0.892465 | 0 |
| 0.889495 | 0 |
| 0.886535 | 0 |
| 0.883585 | 0 |
| 0.880645 | 0 |
| 0.877715 | 0 |
| 0.874794 | 0 |
| 0.871884 | 0 |
| 0.868983 | 0 |
| 0.866091 | 0 |
| 0.863209 | 0 |
| 0.860337 | 0 |
| 0.857474 | 0 |
| 0.854621 | 0 |
| 0.851777 | 0 |
| 0.848943 | 0 |
| 0.846118 | 0 |
| 0.843303 | 0 |
| 0.840497 | 0 |
| 0.8377 | 0 |
| 0.834913 | 0 |
| 0.832135 | 0 |
| 0.829366 | 0 |
| 0.826606 | 0 |
| 0.823856 | 0 |
| 0.821114 | 0 |
| 0.818382 | 0 |
| 0.815659 | 0 |
| 0.812945 | 0 |
| 0.81024 | 0 |
| 0.807544 | 0 |
| 0.804857 | 0 |
| 0.802179 | 0 |
| 0.79951 | 0 |
| 0.796849 | 0 |
| 0.794198 | 0 |
| 0.791555 | 0 |
| 0.788921 | 0 |
| 0.786296 | 0 |
| 0.78368 | 0 |
| 0.781072 | 0 |
| 0.778473 | 0 |
| 0.775883 | 0 |
| 0.773301 | 0 |
| 0.770728 | 0 |
| 0.768164 | 0 |
| 0.765608 | 0 |
| 0.76306 | 0 |
| 0.760521 | 0 |
| 0.757991 | 0 |
| 0.755469 | 0 |
| 0.752955 | 0 |
| 0.750449 | 0 |
| 0.747952 | 0 |
| 0.745464 | 0 |
| 0.742983 | 0 |
| 0.740511 | 0 |
| 0.738047 | 0 |
| 0.735591 | 0 |
| 0.733144 | 0 |
| 0.730704 | 0 |
| 0.728273 | 0 |
| 0.725849 | 0 |
| 0.723434 | 0 |
| 0.721027 | 0 |
| 0.718628 | 0 |
| 0.716237 | 0 |
| 0.713853 | 0 |
| 0.711478 | 0 |
| 0.709111 | 0 |
| 0.706751 | 0 |
| 0.7044 | 0 |
| 0.702056 | 0 |
| 0.69972 | 0 |
| 0.697391 | 0 |
| 0.695071 | 0 |
| 0.692758 | 0 |
| 0.690453 | 0 |
| 0.688156 | 0 |
| 0.685866 | 0 |
| 0.683584 | 0 |
| 0.681309 | 0 |
| 0.679042 | 0 |
| 0.676783 | 0 |
| 0.674531 | 0 |
| 0.672286 | 0 |
| 0.670049 | 0 |
| 0.66782 | 0 |
| 0.665598 | 0 |
| 0.663383 | 0 |
| 0.661176 | 0 |
| 0.658976 | 0 |
| 0.656783 | 0.008 |
| 0.654597 | 0 |
| 0.652419 | 0 |
| 0.650248 | 0 |
| 0.648085 | 0 |
| 0.645928 | 0 |
| 0.643779 | 0 |
| 0.641637 | 0 |
| 0.639502 | 0 |
| 0.637374 | 0 |
| 0.635253 | 0 |
| 0.633139 | 0 |
| 0.631033 | 0 |
| 0.628933 | 0 |
| 0.62684 | 0 |
| 0.624755 | 0 |
| 0.622676 | 0 |
| 0.620604 | 0 |
| 0.618539 | 0 |
| 0.616481 | 0 |
| 0.614429 | 0 |
| 0.612385 | 0 |
| 0.610347 | 0 |
| 0.608316 | 0 |
| 0.606292 | 0 |
| 0.604275 | 0 |
| 0.602264 | 0 |
| 0.60026 | 0 |
| 0.598263 | 0 |
| 0.596272 | 0 |
| 0.594288 | 0 |
| 0.592311 | 0 |
| 0.59034 | 0 |
| 0.588376 | 0 |
| 0.586418 | 0 |
| 0.584466 | 0 |
| 0.582522 | 0 |
| 0.580583 | 0 |
| 0.578652 | 0 |
| 0.576726 | 0 |
| 0.574807 | 0 |
| 0.572895 | 0 |
| 0.570988 | 0 |
| 0.569088 | 0 |
| 0.567195 | 0 |
| 0.565307 | 0 |
| 0.563426 | 0 |
| 0.561552 | 0 |
| 0.559683 | 0 |
| 0.557821 | 0 |
| 0.555965 | 0 |
| 0.554115 | 0 |
| 0.552271 | 0 |
| 0.550433 | 0 |
| 0.548602 | 0 |
| 0.546776 | 0 |
| 0.544957 | 0 |
| 0.543144 | 0 |
| 0.541336 | 0 |
| 0.539535 | 0 |
| 0.53774 | 0 |
| 0.535951 | 0 |
| 0.534167 | 0 |
| 0.53239 | 0 |
| 0.530618 | 0 |
| 0.528853 | 0 |
| 0.527093 | 0 |
| 0.525339 | 0 |
| 0.523591 | 0 |
| 0.521849 | 0 |
| 0.520113 | 0 |
| 0.518382 | 0 |
| 0.516657 | 0 |
| 0.514938 | 0 |
| 0.513225 | 0 |
| 0.511517 | 0 |
| 0.509815 | 0 |
| 0.508118 | 0 |
| 0.506428 | 0 |
| 0.504743 | 0 |
| 0.503063 | 0 |
| 0.501389 | 0 |
| 0.499721 | 0 |
| 0.498058 | 0 |
| 0.496401 | 0 |
| 0.494749 | 0 |
| 0.493103 | 0 |
| 0.491462 | 0 |
| 0.489827 | 0 |
| 0.488197 | 0 |
| 0.486573 | 0.003 |
| 0.484954 | 0 |
| 0.48334 | 0 |
| 0.481732 | 0 |
| 0.480129 | 0 |
| 0.478531 | 0 |
| 0.476939 | 0 |
| 0.475352 | 0 |
| 0.47377 | 0 |
| 0.472194 | 0 |
| 0.470623 | 0 |
| 0.469057 | 0.002 |
| 0.467496 | 0 |
| 0.46594 | 0 |
| 0.46439 | 0 |
| 0.462845 | 0 |
| 0.461305 | 0 |
| 0.45977 | 0 |
| 0.45824 | 0 |
| 0.456715 | 0 |
| 0.455195 | 0 |
| 0.453681 | 0 |
| 0.452171 | 0 |
| 0.450667 | 0 |
| 0.449167 | 0 |
| 0.447672 | 0 |
| 0.446183 | 0 |
| 0.444698 | 0 |
| 0.443218 | 0 |
| 0.441744 | 0 |
| 0.440274 | 0 |
| 0.438809 | 0 |
| 0.437349 | 0 |
| 0.435893 | 0 |
| 0.434443 | 0.002 |
| 0.432998 | 0 |
| 0.431557 | 0 |
| 0.430121 | 0 |
| 0.42869 | 0 |
| 0.427263 | 0 |
| 0.425841 | 0 |
| 0.424425 | 0 |
| 0.423012 | 0 |
| 0.421605 | 0 |
| 0.420202 | 0 |
| 0.418804 | 0 |
| 0.41741 | 0 |
| 0.416021 | 0 |
| 0.414637 | 0 |
| 0.413257 | 0 |
| 0.411882 | 0 |
| 0.410512 | 0.001 |
| 0.409146 | 0 |
| 0.407784 | 0 |
| 0.406427 | 0 |
| 0.405075 | 0 |
| 0.403727 | 0 |
| 0.402384 | 0 |
| 0.401045 | 0 |
| 0.399711 | 0 |
| 0.398381 | 0 |
| 0.397055 | 0.001 |
| 0.395734 | 0 |
| 0.394417 | 0 |
| 0.393105 | 0 |
| 0.391797 | 0 |
| 0.390493 | 0 |
| 0.389194 | 0.001 |
| 0.387899 | 0 |
| 0.386608 | 0 |
| 0.385321 | 0 |
| 0.384039 | 0 |
| 0.382762 | 0 |
| 0.381488 | 0 |
| 0.380219 | 0 |
| 0.378953 | 0 |
| 0.377692 | 0 |
| 0.376436 | 0 |
| 0.375183 | 0 |
| 0.373935 | 0 |
| 0.372691 | 0 |
| 0.37145 | 0 |
| 0.370214 | 0 |
| 0.368983 | 0 |
| 0.367755 | 0 |
| 0.366531 | 0 |
| 0.365312 | 0 |
| 0.364096 | 0 |
| 0.362885 | 0 |
| 0.361678 | 0 |
| 0.360474 | 0 |
| 0.359275 | 0 |
| 0.35808 | 0 |
| 0.356888 | 0 |
| 0.355701 | 0 |
| 0.354518 | 0 |
| 0.353338 | 0 |
| 0.352163 | 0 |
| 0.350991 | 0 |
| 0.349823 | 0 |
| 0.34866 | 0 |
| 0.3475 | 0 |
| 0.346344 | 0 |
| 0.345191 | 0 |
| 0.344043 | 0 |
| 0.342898 | 0 |
| 0.341758 | 0 |
| 0.340621 | 0 |
| 0.339487 | 0 |
| 0.338358 | 0 |
| 0.337232 | 0 |
| 0.33611 | 0 |
| 0.334992 | 0 |
| 0.333878 | 0 |
| 0.332767 | 0 |
| 0.33166 | 0 |
| 0.330556 | 0 |
| 0.329457 | 0 |
| 0.328361 | 0 |
| 0.327268 | 0 |
| 0.326179 | 0 |
| 0.325094 | 0 |
| 0.324013 | 0 |
| 0.322935 | 0 |
| 0.32186 | 0 |
| 0.320789 | 0.001 |
| 0.319722 | 0 |
| 0.318659 | 0 |
| 0.317598 | 0 |
| 0.316542 | 0 |
| 0.315489 | 0 |
| 0.314439 | 0 |
| 0.313393 | 0 |
| 0.31235 | 0 |
| 0.311311 | 0 |
| 0.310276 | 0 |
| 0.309243 | 0 |
| 0.308214 | 0 |
| 0.307189 | 0 |
| 0.306167 | 0 |
| 0.305148 | 0 |
| 0.304133 | 0 |
| 0.303122 | 0 |
| 0.302113 | 0 |
| 0.301108 | 0 |
| 0.300106 | 0 |
| 0.299108 | 0 |
| 0.298113 | 0 |
| 0.297121 | 0 |
| 0.296132 | 0 |
| 0.295147 | 0 |
| 0.294165 | 0 |
| 0.293187 | 0 |
| 0.292211 | 0 |
| 0.291239 | 0 |
| 0.29027 | 0 |
| 0.289304 | 0 |
| 0.288342 | 0 |
| 0.287383 | 0 |
| 0.286427 | 0 |
| 0.285474 | 0 |
| 0.284524 | 0 |
| 0.283577 | 0 |
| 0.282634 | 0 |
| 0.281694 | 0 |
| 0.280756 | 0 |
| 0.279822 | 0 |
| 0.278891 | 0 |
| 0.277964 | 0 |
| 0.277039 | 0 |
| 0.276117 | 0 |
| 0.275199 | 0 |
| 0.274283 | 0 |
| 0.273371 | 0.001 |
| 0.272461 | 0 |
| 0.271555 | 0 |
| 0.270651 | 0 |
| 0.269751 | 0 |
| 0.268853 | 0 |
| 0.267959 | 0 |
| 0.267067 | 0 |
| 0.266179 | 0 |
| 0.265293 | 0 |
| 0.264411 | 0 |
| 0.263531 | 0 |
| 0.262654 | 0 |
| 0.261781 | 0 |
| 0.26091 | 0 |
| 0.260042 | 0 |
| 0.259176 | 0 |
| 0.258314 | 0 |
| 0.257455 | 0 |
| 0.256598 | 0 |
| 0.255745 | 0 |
| 0.254894 | 0 |
| 0.254046 | 0 |
| 0.253201 | 0 |
| 0.252358 | 0 |
| 0.251519 | 0.001 |
| 0.250682 | 0 |
| 0.249848 | 0 |
| 0.249017 | 0 |
| 0.248188 | 0 |
| 0.247363 | 0 |
| 0.24654 | 0 |
| 0.245719 | 0 |
| 0.244902 | 0 |
| 0.244087 | 0 |
| 0.243275 | 0 |
| 0.242466 | 0 |
| 0.241659 | 0 |
| 0.240855 | 0 |
| 0.240054 | 0 |
| 0.239255 | 0 |
| 0.238459 | 0 |
| 0.237666 | 0 |
| 0.236875 | 0 |
| 0.236087 | 0 |
| 0.235302 | 0 |
| 0.234519 | 0 |
| 0.233739 | 0 |
| 0.232961 | 0 |
| 0.232186 | 0 |
| 0.231414 | 0 |
| 0.230644 | 0 |
| 0.229876 | 0 |
| 0.229112 | 0 |
| 0.228349 | 0 |
| 0.22759 | 0 |
| 0.226832 | 0 |
| 0.226078 | 0 |
| 0.225326 | 0 |
| 0.224576 | 0 |
| 0.223829 | 0 |
| 0.223084 | 0 |
| 0.222342 | 0 |
| 0.221602 | 0 |
| 0.220865 | 0 |
| 0.22013 | 0 |
| 0.219398 | 0 |
| 0.218668 | 0 |
| 0.217941 | 0 |
| 0.217215 | 0 |
| 0.216493 | 0 |
| 0.215773 | 0 |
| 0.215055 | 0 |
| 0.214339 | 0 |
| 0.213626 | 0 |
| 0.212915 | 0 |
| 0.212207 | 0 |
| 0.211501 | 0 |
| 0.210797 | 0 |
| 0.210096 | 0 |
| 0.209397 | 0 |
| 0.208701 | 0 |
| 0.208006 | 0 |
| 0.207314 | 0 |
| 0.206625 | 0 |
| 0.205937 | 0 |
| 0.205252 | 0 |
| 0.204569 | 0 |
| 0.203889 | 0 |
| 0.20321 | 0 |
| 0.202534 | 0 |
| 0.20186 | 0 |
| 0.201189 | 0 |
| 0.200519 | 0 |
| 0.199852 | 0 |
| 0.199187 | 0 |
| 0.198525 | 0 |
| 0.197864 | 0 |
| 0.197206 | 0 |
| 0.19655 | 0 |
| 0.195896 | 0 |
| 0.195244 | 0 |
| 0.194595 | 0 |
| 0.193947 | 0 |
| 0.193302 | 0 |
| 0.192659 | 0 |
| 0.192018 | 0 |
| 0.191379 | 0 |
| 0.190743 | 0.004 |
| 0.190108 | 0 |
| 0.189476 | 0.005 |
| 0.188845 | 0 |
| 0.188217 | 0 |
| 0.187591 | 0 |
| 0.186967 | 0 |
| 0.186345 | 0 |
| 0.185725 | 0 |
| 0.185107 | 0 |
| 0.184491 | 0 |
| 0.183877 | 0 |
| 0.183265 | 0 |
| 0.182656 | 0 |
| 0.182048 | 0 |
| 0.181442 | 0 |
| 0.180839 | 0 |
| 0.180237 | 0 |
| 0.179637 | 0 |
| 0.17904 | 0 |
| 0.178444 | 0 |
| 0.177851 | 0 |
| 0.177259 | 0 |
| 0.176669 | 0 |
| 0.176081 | 0 |
| 0.175496 | 0 |
| 0.174912 | 0.001 |
| 0.17433 | 0 |
| 0.17375 | 0 |
| 0.173172 | 0 |
| 0.172596 | 0 |
| 0.172021 | 0 |
| 0.171449 | 0 |
| 0.170879 | 0 |
| 0.17031 | 0 |
| 0.169744 | 0 |
| 0.169179 | 0 |
| 0.168616 | 0 |
| 0.168055 | 0 |
| 0.167496 | 0 |
| 0.166939 | 0 |
| 0.166383 | 0.001 |
| 0.16583 | 0 |
| 0.165278 | 0 |
| 0.164728 | 0 |
| 0.16418 | 0.019 |
| 0.163634 | 0 |
| 0.16309 | 0 |
| 0.162547 | 0 |
| 0.162006 | 0 |
| 0.161467 | 0 |
| 0.16093 | 0 |
| 0.160395 | 0 |
| 0.159861 | 0 |
| 0.159329 | 0 |
| 0.158799 | 0 |
| 0.158271 | 0 |
| 0.157744 | 0 |
| 0.15722 | 0 |
| 0.156697 | 0 |
| 0.156175 | 0 |
| 0.155656 | 0 |
| 0.155138 | 0.052 |
| 0.154622 | 0.103 |
| 0.154107 | 0 |
| 0.153595 | 0 |
| 0.153084 | 0 |
| 0.152574 | 0 |
| 0.152067 | 0 |
| 0.151561 | 0 |
| 0.151057 | 0 |
| 0.150554 | 0 |
| 0.150053 | 0 |
| 0.149554 | 0 |
| 0.149056 | 0 |
| 0.14856 | 0.005 |
| 0.148066 | 0 |
| 0.147574 | 0 |
| 0.147083 | 0 |
| 0.146593 | 0 |
| 0.146106 | 0 |
| 0.14562 | 0 |
| 0.145135 | 0 |
| 0.144652 | 0 |
| 0.144171 | 0 |
| 0.143691 | 0 |
| 0.143213 | 0 |
| 0.142737 | 0 |
| 0.142262 | 0 |
| 0.141789 | 0.001 |
| 0.141317 | 0 |
| 0.140847 | 0.001 |
| 0.140378 | 0.01 |
| 0.139911 | 0.006 |
| 0.139446 | 0.015 |
| 0.138982 | 0 |
| 0.138519 | 0 |
| 0.138059 | 0 |
| 0.137599 | 0 |
| 0.137142 | 0 |
| 0.136685 | 0 |
| 0.136231 | 0 |
| 0.135777 | 0 |
| 0.135326 | 0 |
| 0.134875 | 0 |
| 0.134427 | 0 |
| 0.133979 | 0 |
| 0.133534 | 0 |
| 0.133089 | 0 |
| 0.132647 | 0 |
| 0.132205 | 0 |
| 0.131766 | 0 |
| 0.131327 | 0 |
| 0.13089 | 0 |
| 0.130455 | 0 |
| 0.130021 | 0 |
| 0.129588 | 0 |
| 0.129157 | 0 |
| 0.128727 | 0 |
| 0.128299 | 0 |
| 0.127872 | 0 |
| 0.127447 | 0 |
| 0.127023 | 0 |
| 0.1266 | 0 |
| 0.126179 | 0 |
| 0.125759 | 0 |
| 0.125341 | 0 |
| 0.124924 | 0 |
| 0.124508 | 0 |
| 0.124094 | 0.004 |
| 0.123681 | 0.007 |
| 0.12327 | 0 |
| 0.12286 | 0 |
| 0.122451 | 0 |
| 0.122044 | 0 |
| 0.121638 | 0.585 |
| 0.121233 | 0 |
| 0.12083 | 0.011 |
| 0.120428 | 0 |
| 0.120027 | 0 |
| 0.119628 | 0 |
| 0.11923 | 0 |
| 0.118833 | 0 |
| 0.118438 | 0 |
| 0.118044 | 0 |
| 0.117651 | 0.002 |
| 0.117259 | 0 |
| 0.116869 | 0 |
| 0.11648 | 0 |
| 0.116093 | 0 |
| 0.115707 | 0 |
| 0.115322 | 0 |
| 0.114938 | 0 |
| 0.114556 | 0 |
| 0.114175 | 0 |
| 0.113795 | 0 |
| 0.113416 | 0 |
| 0.113039 | 0 |
| 0.112663 | 0 |
| 0.112288 | 0 |
| 0.111914 | 0 |
| 0.111542 | 0 |
| 0.111171 | 0 |
| 0.110801 | 0 |
| 0.110433 | 0 |
| 0.110065 | 0 |
| 0.109699 | 0 |
| 0.109334 | 0 |
| 0.10897 | 0 |
| 0.108608 | 0.004 |
| 0.108246 | 0 |
| 0.107886 | 0 |
| 0.107527 | 0 |
| 0.10717 | 0.001 |
| 0.106813 | 0 |
| 0.106458 | 0 |
| 0.106104 | 0 |
| 0.105751 | 0 |
| 0.105399 | 0 |
| 0.105048 | 0 |
| 0.104699 | 0 |
| 0.10435 | 0 |
| 0.104003 | 0 |
| 0.103657 | 0.001 |
| 0.103312 | 0.002 |
| 0.102969 | 0 |
| 0.102626 | 0.087 |
| 0.102285 | 0 |
| 0.101944 | 0 |
| 0.101605 | 0 |
| 0.101267 | 0 |
| 0.10093 | 0 |
| 0.100594 | 0 |
| 0.10026 | 0 |
| 0.0999262 | 0 |
| 0.0995937 | 0 |
| 0.0992624 | 0.004 |
| 0.0989322 | 0.001 |
| 0.098603 | 0 |
| 0.098275 | 0 |
| 0.097948 | 0 |
| 0.0976222 | 0.05 |
| 0.0972974 | 0.027 |
| 0.0969737 | 0 |
| 0.0966511 | 0 |
| 0.0963295 | 0 |
| 0.096009 | 0.001 |
| 0.0956896 | 0 |
| 0.0953713 | 0 |
| 0.095054 | 0.013 |
| 0.0947378 | 0 |
| 0.0944226 | 0.001 |
| 0.0941084 | 0.001 |
| 0.0937954 | 0.008 |
| 0.0934833 | 0.001 |
| 0.0931723 | 0.005 |
| 0.0928623 | 0 |
| 0.0925534 | 0.004 |
| 0.0922455 | 0.005 |
| 0.0919386 | 0.003 |
| 0.0916327 | 0.003 |
| 0.0913279 | 0.001 |
| 0.0911592 | 0.003 |
| 0.0909909 | 0.003 |
| 0.0906888 | 0.003 |
| 0.0903877 | 0.003 |
| 0.0900877 | 0.003 |
| 0.0897886 | 0.003 |
| 0.0894905 | 0.003 |
| 0.0891934 | 0.003 |
| 0.0888973 | 0.003 |
| 0.0886022 | 0.003 |
| 0.088308 | 0.003 |
| 0.0880148 | 0.003 |
| 0.0877227 | 0.003 |
| 0.0874314 | 0.002 |
| 0.0871412 | 0.002 |
| 0.0868519 | 0.002 |
| 0.0865635 | 0.002 |
| 0.0862762 | 0.002 |
| 0.0859897 | 0.002 |
| 0.0857043 | 0.002 |
| 0.0854197 | 0.002 |
| 0.0851362 | 0.002 |
| 0.0848535 | 0.002 |
| 0.0845718 | 0.002 |
| 0.084291 | 0.002 |
| 0.0840112 | 0.002 |
| 0.0837323 | 0.002 |
| 0.0834543 | 0.007 |
| 0.0831773 | 0.002 |
| 0.0829011 | 0.002 |
| 0.0826259 | 0.002 |
| 0.0823516 | 0.002 |
| 0.0820782 | 0.001 |
| 0.0818057 | 0.001 |
| 0.0815341 | 0.002 |
| 0.0812635 | 0.001 |
| 0.0809937 | 0.002 |
| 0.0807248 | 0.001 |
| 0.0804568 | 0.001 |
| 0.0801897 | 0.001 |
| 0.0799235 | 0.001 |
| 0.0796581 | 0.001 |
| 0.0793937 | 0.001 |
| 0.0791301 | 0.037 |
| 0.0788674 | 0.019 |
| 0.0786056 | 0.012 |
| 0.0783446 | 0.001 |
| 0.0780845 | 0.001 |
| 0.0778253 | 0.001 |
| 0.0775669 | 0.001 |
| 0.0773094 | 0.001 |
| 0.0770528 | 0.001 |
| 0.076797 | 0.001 |
| 0.076542 | 0.048 |
| 0.0762879 | 0.001 |
| 0.0760346 | 0.001 |
| 0.0757822 | 0.001 |
| 0.0755306 | 0.001 |
| 0.0752799 | 0.002 |
| 0.0750299 | 0.006 |
| 0.0747809 | 0.003 |
| 0.0745326 | 0.002 |
| 0.0742852 | 0.001 |
| 0.0740385 | 0.001 |
| 0.0737927 | 0.001 |
| 0.0735478 | 0.001 |
| 0.0733036 | 0.001 |
| 0.0730602 | 0.001 |
| 0.0728177 | 0.001 |
| 0.0725759 | 0 |
| 0.072335 | 0 |
| 0.0720949 | 0 |
| 0.0718555 | 0 |
| 0.071617 | 0 |
| 0.0713792 | 0 |
| 0.0711422 | 0 |
| 0.0709061 | 0 |
| 0.0706707 | 0 |
| 0.070436 | 0.005 |
| 0.0702022 | 0.004 |
| 0.0699692 | 0 |
| 0.0697369 | 0 |
| 0.0695053 | 0 |
| 0.0692746 | 0 |
| 0.0690446 | 0.002 |
| 0.0688154 | 0 |
| 0.0685869 | 0.007 |
| 0.0683592 | 0 |
| 0.0681323 | 0 |
| 0.0679061 | 0 |
| 0.0676807 | 0 |
| 0.067456 | 0 |
| 0.067232 | 0 |
| 0.0670088 | 0 |
| 0.0667864 | 0.003 |
| 0.0665647 | 0 |
| 0.0663437 | 0 |
| 0.0661234 | 0.01 |
| 0.0659039 | 0 |
| 0.0656851 | 0.006 |
| 0.065467 | 0 |
| 0.0652497 | 0 |
| 0.0650331 | 0 |
| 0.0648172 | 0 |
| 0.064602 | 0 |
| 0.0643875 | 0 |
| 0.0641738 | 0 |
| 0.0639607 | 0 |
| 0.0637484 | 0 |
| 0.0635367 | 0 |
| 0.0633258 | 0 |
| 0.0631156 | 0 |
| 0.062906 | 0.086 |
| 0.0626972 | 0 |
| 0.0624891 | 0 |
| 0.0622816 | 0 |
| 0.0620748 | 0 |
| 0.0618688 | 0 |
| 0.0616634 | 0 |
| 0.0614587 | 0 |
| 0.0612546 | 0 |
| 0.0610513 | 0.018 |
| 0.0608486 | 0.01 |
| 0.0606466 | 0 |
| 0.0604452 | 0 |
| 0.0602446 | 0 |
| 0.0600446 | 0.002 |
| 0.0598452 | 0 |
| 0.0596465 | 0 |
| 0.0594485 | 0 |
| 0.0592512 | 0 |
| 0.0590545 | 0 |
| 0.0588584 | 0 |
| 0.058663 | 0 |
| 0.0584683 | 0.002 |
| 0.0582741 | 0 |
| 0.0580807 | 0 |
| 0.0578879 | 0 |
| 0.0576957 | 0 |
| 0.0575041 | 0 |
| 0.0573132 | 0.002 |
| 0.057123 | 0 |
| 0.0569333 | 0.002 |
| 0.0567443 | 0 |
| 0.0565559 | 0 |
| 0.0563682 | 0 |
| 0.056181 | 0 |
| 0.0559945 | 0 |
| 0.0558086 | 0 |
| 0.0556234 | 0 |
| 0.0554387 | 0.119 |
| 0.0552547 | 0.015 |
| 0.0550712 | 0 |
| 0.0548884 | 0 |
| 0.0547062 | 0 |
| 0.0545245 | 0 |
| 0.0543435 | 0.008 |
| 0.0541631 | 0.009 |
| 0.0539833 | 0 |
| 0.0538041 | 0 |
| 0.0536255 | 0 |
| 0.0534474 | 0 |
| 0.05327 | 0 |
| 0.0530932 | 0 |
| 0.0529169 | 0 |
| 0.0527412 | 0 |
| 0.0525661 | 0.001 |
| 0.0523916 | 0 |
| 0.0522177 | 0 |
| 0.0520443 | 0 |
| 0.0518715 | 0 |
| 0.0516993 | 0 |
| 0.0515277 | 0 |
| 0.0513566 | 0 |
| 0.0511861 | 0 |
| 0.0510162 | 0 |
| 0.0508468 | 0.007 |
| 0.050678 | 0.001 |
| 0.0505098 | 0 |
| 0.0503421 | 0 |
| 0.0501749 | 0 |
| 0.0500083 | 0 |
| 0.0498422 | 0 |
| 0.0496767 | 0 |
| 0.0495117 | 0 |
| 0.0493473 | 0 |
| 0.0491834 | 0 |
| 0.0490201 | 0.002 |
| 0.0488573 | 0.001 |
| 0.048695 | 0 |
| 0.0485333 | 0 |
| 0.0483721 | 0.002 |
| 0.0482115 | 0.001 |
| 0.0480514 | 0.001 |
| 0.0478918 | 0 |
| 0.0477328 | 0 |
| 0.0475742 | 0 |
| 0.0474163 | 0 |
| 0.0472588 | 0 |
| 0.0471018 | 0 |
| 0.0469454 | 0.001 |
| 0.0467895 | 0 |
| 0.0466341 | 0 |
| 0.0464793 | 0 |
| 0.0463249 | 0 |
| 0.0461711 | 0 |
| 0.0460177 | 0 |
| 0.0458649 | 0 |
| 0.0457126 | 0 |
| 0.0455608 | 0.001 |
| 0.0454095 | 0 |
| 0.0452587 | 0 |
| 0.0451084 | 0 |
| 0.0449586 | 0 |
| 0.0448093 | 0 |
| 0.0446605 | 0 |
| 0.0445122 | 0.003 |
| 0.0443643 | 0 |
| 0.044217 | 0.002 |
| 0.0440702 | 0 |
| 0.0439238 | 0 |
| 0.0437779 | 0 |
| 0.0436326 | 0 |
| 0.0434877 | 0 |
| 0.0433432 | 0 |
| 0.0431993 | 0 |
| 0.0430558 | 0 |
| 0.0429128 | 0 |
| 0.0427703 | 0 |
| 0.0426283 | 0 |
| 0.0424867 | 0 |
| 0.0423456 | 0 |
| 0.042205 | 0 |
| 0.0420649 | 0 |
| 0.0419252 | 0 |
| 0.0417859 | 0 |
| 0.0416472 | 0 |
| 0.0415089 | 0 |
| 0.041371 | 0 |
| 0.0412336 | 0 |
| 0.0410967 | 0 |
| 0.0409602 | 0 |
| 0.0408242 | 0 |
| 0.0406886 | 0 |
| 0.0405535 | 0 |
| 0.0404188 | 0 |
| 0.0402846 | 0 |
| 0.0401508 | 0 |
| 0.0400174 | 0 |
| 0.0398846 | 0 |
| 0.0397521 | 0 |
| 0.0396201 | 0 |
| 0.0394885 | 0 |
| 0.0393574 | 0 |
| 0.0392267 | 0 |
| 0.0390964 | 0.001 |
| 0.0389666 | 0 |
| 0.0388372 | 0 |
| 0.0387082 | 0 |
| 0.0385796 | 0.007 |
| 0.0384515 | 0 |
| 0.0383238 | 0 |
| 0.0381966 | 0 |
| 0.0380697 | 0 |
| 0.0379433 | 0 |
| 0.0378173 | 0 |
| 0.0376917 | 0 |
| 0.0375665 | 0 |
| 0.0374418 | 0 |
| 0.0373174 | 0.002 |
| 0.0371935 | 0 |
| 0.03707 | 0 |
| 0.0369469 | 0.001 |
| 0.0368242 | 0 |
| 0.0367019 | 0 |
| 0.03658 | 0 |
| 0.0364585 | 0 |
| 0.0363374 | 0 |
| 0.0362168 | 0 |
| 0.0360965 | 0 |
| 0.0359766 | 0.002 |
| 0.0358571 | 0.002 |
| 0.0357381 | 0.001 |
| 0.0356194 | 0 |
| 0.0355011 | 0 |
| 0.0353832 | 0 |
| 0.0352657 | 0.001 |
| 0.0351486 | 0 |
| 0.0350318 | 0 |
| 0.0349155 | 0 |
| 0.0347995 | 0.002 |
| 0.034684 | 0 |
| 0.0345688 | 0.003 |
| 0.034454 | 0 |
| 0.0343396 | 0 |
| 0.0342255 | 0 |
| 0.0341119 | 0 |
| 0.0339986 | 0 |
| 0.0338857 | 0 |
| 0.0337732 | 0 |
| 0.033661 | 0 |
| 0.0335492 | 0 |
| 0.0334378 | 0 |
| 0.0333268 | 0 |
| 0.0332161 | 0 |
| 0.0331058 | 0 |
| 0.0329958 | 0.001 |
| 0.0328862 | 0 |
| 0.032777 | 0 |
| 0.0326682 | 0 |
| 0.0325597 | 0.001 |
| 0.0324516 | 0 |
| 0.0323438 | 0.001 |
| 0.0322364 | 0 |
| 0.0321293 | 0.001 |
| 0.0320226 | 0 |
| 0.0319163 | 0 |
| 0.0318103 | 0 |
| 0.0317047 | 0 |
| 0.0315994 | 0 |
| 0.0314944 | 0.001 |
| 0.0313898 | 0 |
| 0.0312856 | 0.016 |
| 0.0311817 | 0 |
| 0.0310781 | 0.001 |
| 0.0309749 | 0 |
| 0.0308721 | 0 |
| 0.0307695 | 0.001 |
| 0.0306674 | 0 |
| 0.0305655 | 0.011 |
| 0.030464 | 0 |
| 0.0303628 | 1.966 |
| 0.030262 | 0 |
| 0.0301615 | 0 |
| 0.0300613 | 0.004 |
| 0.0299615 | 0 |
| 0.029862 | 0 |
| 0.0297628 | 0 |
| 0.029664 | 0 |
| 0.0295655 | 0.001 |
| 0.0294673 | 0 |
| 0.0293694 | 0 |
| 0.0292719 | 0.001 |
| 0.0291747 | 0 |
| 0.0290778 | 0 |
| 0.0289813 | 0 |
| 0.028885 | 0 |
| 0.0287891 | 0 |
| 0.0286935 | 0 |
| 0.0285982 | 0.001 |
| 0.0285032 | 0 |
| 0.0284086 | 0 |
| 0.0283142 | 0.001 |
| 0.0282202 | 0 |
| 0.0281265 | 0 |
| 0.0280331 | 0.007 |
| 0.02794 | 0 |
| 0.0278472 | 0 |
| 0.0277547 | 0 |
| 0.0276625 | 0 |
| 0.0275707 | 0 |
| 0.0274791 | 0 |
| 0.0273878 | 0 |
| 0.0272969 | 0 |
| 0.0272062 | 0 |
| 0.0271159 | 0 |
| 0.0270258 | 0 |
| 0.0269361 | 0 |
| 0.0268466 | 0.003 |
| 0.0267575 | 0 |
| 0.0266686 | 0 |
| 0.0265801 | 0 |
| 0.0264918 | 0.002 |
| 0.0264038 | 0.002 |
| 0.0263161 | 0 |
| 0.0262287 | 0 |
| 0.0261416 | 0 |
| 0.0260548 | 0.002 |
| 0.0259683 | 0 |
| 0.025882 | 0 |
| 0.0257961 | 0 |
| 0.0257104 | 0 |
| 0.025625 | 0.284 |
| 0.0255399 | 0 |
| 0.0254551 | 0 |
| 0.0253706 | 0 |
| 0.0252863 | 0 |
| 0.0252024 | 0 |
| 0.0251187 | 0.001 |
| 0.0250352 | 0 |
| 0.0249527 | 0 |
| 0.024871 | 0.002 |
| 0.0247896 | 0 |
| 0.0247085 | 0.009 |
| 0.0246276 | 0 |
| 0.024547 | 0 |
| 0.0244666 | 0.004 |
| 0.0243865 | 0 |
| 0.0243067 | 0.095 |
| 0.0242271 | 0 |
| 0.0241478 | 0.001 |
| 0.0240688 | 0 |
| 0.02399 | 0 |
| 0.0239114 | 0.091 |
| 0.0238332 | 0 |
| 0.0237552 | 0.041 |
| 0.0236774 | 0.001 |
| 0.0236024 | 0.001 |
| 0.0235303 | 0 |
| 0.0234583 | 0.023 |
| 0.0233866 | 0.001 |
| 0.023315 | 0 |
| 0.0232437 | 0.014 |
| 0.0231727 | 0.01 |
| 0.0231018 | 0.007 |
| 0.0230311 | 0.006 |
| 0.0229607 | 0.009 |
| 0.0228905 | 0.014 |
| 0.0228205 | 0.006 |
| 0.0227476 | 0.018 |
| 0.0226719 | 0.014 |
| 0.0225965 | 0.013 |
| 0.0225213 | 0.011 |
| 0.0224464 | 0.01 |
| 0.0223717 | 0.009 |
| 0.0222972 | 0.01 |
| 0.022223 | 0.007 |
| 0.0221491 | 0.006 |
| 0.0220754 | 0.006 |
| 0.0220019 | 0.005 |
| 0.0219287 | 0.005 |
| 0.0218558 | 0.005 |
| 0.021783 | 0.004 |
| 0.0217105 | 0.003 |
| 0.0216383 | 0.003 |
| 0.0215663 | 0.003 |
| 0.0214945 | 0.014 |
| 0.021423 | 0.002 |
| 0.0213517 | 0.015 |
| 0.0212807 | 0.003 |
| 0.0212099 | 0.001 |
| 0.0211393 | 0.001 |
| 0.0210689 | 0.001 |
| 0.0209988 | 0.001 |
| 0.020929 | 0.003 |
| 0.0208593 | 0.002 |
| 0.0207899 | 0.018 |
| 0.0207207 | 0.004 |
| 0.0206518 | 0.001 |
| 0.0205831 | 0.001 |
| 0.0205146 | 0.001 |
| 0.0204463 | 0.001 |
| 0.0203783 | 0 |
| 0.0203105 | 0.003 |
| 0.0202429 | 0 |
| 0.0201755 | 0 |
| 0.0201084 | 0.001 |
| 0.0200415 | 0 |
| 0.0199748 | 0 |
| 0.0199083 | 0 |
| 0.0198421 | 0 |
| 0.019776 | 0.002 |
| 0.0197102 | 0 |
| 0.0196447 | 0.014 |
| 0.0195793 | 0 |
| 0.0195141 | 0 |
| 0.0194492 | 0 |
| 0.0193845 | 0 |
| 0.01932 | 0 |
| 0.0192557 | 0 |
| 0.0191916 | 0 |
| 0.0191278 | 0 |
| 0.0190641 | 0 |
| 0.0190007 | 0 |
| 0.0189374 | 0 |
| 0.0188744 | 0 |
| 0.0188116 | 0 |
| 0.018749 | 0 |
| 0.0186866 | 0 |
| 0.0186245 | 0.001 |
| 0.0185625 | 0 |
| 0.0185007 | 0.002 |
| 0.0184392 | 0 |
| 0.0183778 | 0 |
| 0.0183166 | 0 |
| 0.0182557 | 0.002 |
| 0.0181949 | 0.007 |
| 0.0181344 | 0 |
| 0.0180741 | 0 |
| 0.0180139 | 0.003 |
| 0.017954 | 0 |
| 0.0178942 | 0 |
| 0.0178347 | 0 |
| 0.0177753 | 0 |
| 0.0177162 | 0 |
| 0.0176572 | 0 |
| 0.0175985 | 0 |
| 0.0175399 | 0 |
| 0.0174816 | 0.003 |
| 0.0174234 | 0.004 |
| 0.0173654 | 0 |
| 0.0173076 | 0 |
| 0.01725 | 0 |
| 0.0171926 | 0.009 |
| 0.0171354 | 0.015 |
| 0.0170784 | 0.001 |
| 0.0170216 | 0.002 |
| 0.0169649 | 0 |
| 0.0169085 | 0 |
| 0.0168522 | 0 |
| 0.0167962 | 0.001 |
| 0.0167403 | 0 |
| 0.0166846 | 0.001 |
| 0.016629 | 0 |
| 0.0165737 | 0 |
| 0.0165186 | 0 |
| 0.0164636 | 0 |
| 0.0164088 | 0 |
| 0.0163542 | 0.001 |
| 0.0162998 | 0 |
| 0.0162455 | 0 |
| 0.0161915 | 0 |
| 0.0161376 | 0 |
| 0.0160839 | 0 |
| 0.0160304 | 0 |
| 0.0159771 | 0.001 |
| 0.0159239 | 0.002 |
| 0.0158709 | 0 |
| 0.0158181 | 0 |
| 0.0157655 | 0 |
| 0.015713 | 0 |
| 0.0156607 | 0.001 |
| 0.0156086 | 0 |
| 0.0155567 | 0 |
| 0.0155049 | 0 |
| 0.0154533 | 0 |
| 0.0154019 | 0 |
| 0.0153506 | 0 |
| 0.0152995 | 0 |
| 0.0152486 | 0.001 |
| 0.0151979 | 0 |
| 0.0151473 | 0.001 |
| 0.0150969 | 0 |
| 0.0150467 | 0 |
| 0.0149966 | 0 |
| 0.0149467 | 0 |
| 0.014897 | 0 |
| 0.0148474 | 0.003 |
| 0.014798 | 0.001 |
| 0.0147488 | 0 |
| 0.0146997 | 0.001 |
| 0.0146508 | 0 |
| 0.014602 | 0 |
| 0.0145534 | 0 |
| 0.014505 | 0.001 |
| 0.0144567 | 0 |
| 0.0144086 | 0 |
| 0.0143607 | 0 |
| 0.0143129 | 0.003 |
| 0.0142653 | 0.001 |
| 0.0142178 | 0 |
| 0.0141705 | 0 |
| 0.0141233 | 0 |
| 0.0140763 | 0.001 |
| 0.0140295 | 0 |
| 0.0139828 | 0.001 |
| 0.0139363 | 0.001 |
| 0.0138899 | 0 |
| 0.0138437 | 0 |
| 0.0137976 | 0 |
| 0.0137517 | 0 |
| 0.013706 | 0 |
| 0.0136604 | 0 |
| 0.0136149 | 0 |
| 0.0135696 | 0.002 |
| 0.0135244 | 0 |
| 0.0134794 | 0 |
| 0.0134346 | 0 |
| 0.0133899 | 0 |
| 0.0133453 | 0.001 |
| 0.0133009 | 0 |
| 0.0132567 | 0 |
| 0.0132126 | 0 |
| 0.0131686 | 0 |
| 0.0131248 | 0 |
| 0.0130811 | 0 |
| 0.0130376 | 0 |
| 0.0129942 | 0 |
| 0.0129509 | 0 |
| 0.0129078 | 0 |
| 0.0128649 | 0 |
| 0.0128221 | 0 |
| 0.0127794 | 0 |
| 0.0127369 | 0 |
| 0.0126945 | 0 |
| 0.0126523 | 0 |
| 0.0126102 | 0 |
| 0.0125682 | 0 |
| 0.0125264 | 0 |
| 0.0124847 | 0.001 |
| 0.0124432 | 0 |
| 0.0124018 | 0 |
| 0.0123605 | 0 |
| 0.0123194 | 0 |
| 0.0122784 | 0 |
| 0.0122375 | 0 |
| 0.0121968 | 0 |
| 0.0121562 | 0 |
| 0.0121158 | 0 |
| 0.0120754 | 0 |
| 0.0120353 | 0 |
| 0.0119952 | 0 |
| 0.0119553 | 0 |
| 0.0119155 | 0 |
| 0.0118759 | 0 |
| 0.0118363 | 0 |
| 0.011797 | 0 |
| 0.0117577 | 0 |
| 0.0117186 | 0 |
| 0.0116796 | 0 |
| 0.0116407 | 0 |
| 0.011602 | 0 |
| 0.0115634 | 0 |
| 0.0115249 | 0 |
| 0.0114866 | 0 |
| 0.0114483 | 0 |
| 0.0114102 | 0 |
| 0.0113723 | 0 |
| 0.0113344 | 0 |
| 0.0112967 | 0 |
| 0.0112591 | 0 |
| 0.0112217 | 0 |
| 0.0111843 | 0 |
| 0.0111471 | 0 |
| 0.01111 | 0 |
| 0.011073 | 0 |
| 0.0110362 | 0 |
| 0.0109995 | 0 |
| 0.0109629 | 0 |
| 0.0109264 | 0 |
| 0.01089 | 0 |
| 0.0108538 | 0 |
| 0.0108177 | 0 |
| 0.0107817 | 0 |
| 0.0107458 | 0 |
| 0.01071 | 0 |
| 0.0106744 | 0 |
| 0.0106389 | 0 |
| 0.0106035 | 0 |
| 0.0105682 | 0 |
| 0.010533 | 0 |
| 0.010498 | 0 |
| 0.0104631 | 0 |
| 0.0104282 | 0 |
| 0.0103935 | 0 |
| 0.010359 | 0 |
| 0.0103245 | 0 |
| 0.0102901 | 0 |
| 0.0102559 | 0 |
| 0.0102218 | 0 |
| 0.0101878 | 0 |
| 0.0101539 | 0 |
| 0.0101201 | 0 |
| 0.0100864 | 0 |
| 0.0100528 | 0 |
| 0.0100194 | 0 |
| 0.00998604 | 0 |
| 0.00995281 | 0 |
| 0.00991969 | 0 |
| 0.00988668 | 0 |
| 0.00985378 | 0 |
| 0.00982099 | 0 |
| 0.00978831 | 0 |
| 0.00975574 | 0 |
| 0.00972328 | 0 |
| 0.00969092 | 0 |
| 0.00965868 | 0 |
| 0.00962654 | 0 |
| 0.0095945 | 0 |
| 0.00956258 | 0.001 |
| 0.00953076 | 0 |
| 0.00949904 | 0 |
| 0.00946744 | 0 |
| 0.00943593 | 0 |
| 0.00940453 | 0 |
| 0.00937324 | 0 |
| 0.00934205 | 0 |
| 0.00931097 | 0 |
| 0.00927998 | 0 |
| 0.0092491 | 0 |
| 0.00921833 | 0 |
| 0.00918765 | 0 |
| 0.00915708 | 0 |
| 0.00912661 | 0 |
| 0.00909624 | 0 |
| 0.00906597 | 0 |
| 0.0090358 | 0 |
| 0.00900574 | 0 |
| 0.00897577 | 0 |
| 0.0089459 | 0 |
| 0.00891614 | 0 |
| 0.00888647 | 0 |
| 0.0088569 | 0 |
| 0.00882742 | 0 |
| 0.00879805 | 0 |
| 0.00876877 | 0 |
| 0.0087396 | 0 |
| 0.00871051 | 0 |
| 0.00868153 | 0 |
| 0.00865264 | 0 |
| 0.00862385 | 0 |
| 0.00859515 | 0 |
| 0.00856655 | 0 |
| 0.00853805 | 0 |
| 0.00850964 | 0 |
| 0.00848132 | 0 |
| 0.0084531 | 0 |
| 0.00842497 | 0 |
| 0.00839694 | 0 |
| 0.00836899 | 0 |
| 0.00834115 | 0 |
| 0.00831339 | 0 |
| 0.00828573 | 0 |
| 0.00825816 | 0 |
| 0.00823068 | 0 |
| 0.00820329 | 0 |
| 0.00817599 | 0 |
| 0.00814879 | 0 |
| 0.00812167 | 0 |
| 0.00809465 | 0 |
| 0.00806771 | 0 |
| 0.00804087 | 0 |
| 0.00801411 | 0 |
| 0.00798744 | 0 |
| 0.00796086 | 0 |
| 0.00793437 | 0 |
| 0.00790797 | 0 |
| 0.00788166 | 0 |
| 0.00785543 | 0 |
| 0.00782929 | 0 |
| 0.00780324 | 0 |
| 0.00777727 | 0 |
| 0.00775139 | 0 |
| 0.0077256 | 0 |
| 0.00769989 | 0 |
| 0.00767427 | 0 |
| 0.00764874 | 0 |
| 0.00762328 | 0 |
| 0.00759792 | 0 |
| 0.00757263 | 0 |
| 0.00754744 | 0 |
| 0.00752232 | 0 |
| 0.00749729 | 0 |
| 0.00747234 | 0 |
| 0.00744748 | 0 |
| 0.0074227 | 0 |
| 0.007398 | 0 |
| 0.00737338 | 0 |
| 0.00734885 | 0 |
| 0.00732439 | 0 |
| 0.00730002 | 0 |
| 0.00727573 | 0 |
| 0.00725152 | 0 |
| 0.00722739 | 0 |
| 0.00720334 | 0 |
| 0.00717937 | 0 |
| 0.00715548 | 0 |
| 0.00713167 | 0 |
| 0.00710794 | 0 |
| 0.00708429 | 0 |
| 0.00706071 | 0 |
| 0.00703722 | 0 |
| 0.0070138 | 0 |
| 0.00699046 | 0 |
| 0.0069672 | 0 |
| 0.00694402 | 0 |
| 0.00692091 | 0 |
| 0.00689788 | 0 |
| 0.00687493 | 0 |
| 0.00685205 | 0 |
| 0.00682925 | 0 |
| 0.00680653 | 0 |
| 0.00678388 | 0 |
| 0.00676131 | 0 |
| 0.00673881 | 0 |
| 0.00671638 | 0 |
| 0.00669403 | 0 |
| 0.00667176 | 0 |
| 0.00664956 | 0 |
| 0.00662743 | 0 |
| 0.00660538 | 0 |
| 0.0065834 | 0 |
| 0.00656149 | 0 |
| 0.00653966 | 0 |
| 0.0065179 | 0 |
| 0.00649621 | 0 |
| 0.00647459 | 0 |
| 0.00645305 | 0 |
| 0.00643158 | 0 |
| 0.00641017 | 0 |
| 0.00638884 | 0 |
| 0.00636759 | 0 |
| 0.0063464 | 0 |
| 0.00632528 | 0 |
| 0.00630423 | 0 |
| 0.00628325 | 0 |
| 0.00626235 | 0 |
| 0.00624151 | 0 |
| 0.00622074 | 0 |
| 0.00620004 | 0 |
| 0.00617941 | 0 |
| 0.00615885 | 0 |
| 0.00613835 | 0 |
| 0.00611793 | 0 |
| 0.00609757 | 0 |
| 0.00607728 | 0 |
| 0.00605706 | 0 |
| 0.0060369 | 0 |
| 0.00601681 | 0 |
| 0.00599679 | 0 |
| 0.00597684 | 0 |
| 0.00595695 | 0 |
| 0.00593713 | 0 |
| 0.00591737 | 0 |
| 0.00589768 | 0 |
| 0.00587806 | 0 |
| 0.0058585 | 0 |
| 0.005839 | 0 |
| 0.00581957 | 0 |
| 0.00580021 | 0 |
| 0.00578091 | 0 |
| 0.00576167 | 0 |
| 0.0057425 | 0 |
| 0.00572339 | 0 |
| 0.00570435 | 0 |
| 0.00568536 | 0 |
| 0.00566645 | 0 |
| 0.00564759 | 0 |
| 0.0056288 | 0 |
| 0.00561007 | 0 |
| 0.0055914 | 0 |
| 0.0055728 | 0 |
| 0.00555425 | 0 |
| 0.00553577 | 0 |
| 0.00551735 | 0 |
| 0.00549899 | 0 |
| 0.00548069 | 0 |
| 0.00546245 | 0 |
| 0.00544428 | 0 |
| 0.00542616 | 0 |
| 0.00540811 | 0 |
| 0.00539011 | 0 |
| 0.00537217 | 0 |
| 0.0053543 | 0 |
| 0.00533648 | 0 |
| 0.00531872 | 0 |
| 0.00530103 | 0 |
| 0.00528339 | 0 |
| 0.00526581 | 0 |
| 0.00524828 | 0 |
| 0.00523082 | 0 |
| 0.00521341 | 0 |
| 0.00519607 | 0 |
| 0.00517878 | 0 |
| 0.00516154 | 0 |
| 0.00514437 | 0 |
| 0.00512725 | 0 |
| 0.00511019 | 0 |
| 0.00509318 | 0 |
| 0.00507624 | 0 |
| 0.00505935 | 0 |
| 0.00504251 | 0 |
| 0.00502573 | 0 |
| 0.00500901 | 0 |
| 0.00499234 | 0 |
| 0.00497573 | 0 |
| 0.00495917 | 0 |
| 0.00494267 | 0 |
| 0.00492622 | 0 |
| 0.00490983 | 0 |
| 0.00489349 | 0 |
| 0.00487721 | 0 |
| 0.00486098 | 0 |
| 0.0048448 | 0 |
| 0.00482868 | 0 |
| 0.00481262 | 0 |
| 0.0047966 | 0 |
| 0.00478064 | 0 |
| 0.00476473 | 0 |
| 0.00474888 | 0 |
| 0.00473308 | 0 |
| 0.00471733 | 0 |
| 0.00470163 | 0 |
| 0.00468598 | 0 |
| 0.00467039 | 0 |
| 0.00465485 | 0 |
| 0.00463936 | 0 |
| 0.00462392 | 0 |
| 0.00460854 | 0 |
| 0.0045932 | 0 |
| 0.00457792 | 0 |
| 0.00456269 | 0 |
| 0.0045475 | 0 |
| 0.00453237 | 0 |
| 0.00451729 | 0 |
| 0.00450226 | 0 |
| 0.00448728 | 0 |
| 0.00447234 | 0 |
| 0.00445746 | 0 |
| 0.00444263 | 0 |
| 0.00442785 | 0 |
| 0.00441311 | 0 |
| 0.00439843 | 0 |
| 0.00438379 | 0 |
| 0.00436921 | 0 |
| 0.00435467 | 0 |
| 0.00434018 | 0 |
| 0.00432573 | 0 |
| 0.00431134 | 0 |
| 0.00429699 | 0 |
| 0.0042827 | 0 |
| 0.00426844 | 0 |
| 0.00425424 | 0 |
| 0.00424008 | 0 |
| 0.00422598 | 0 |
| 0.00421191 | 0 |
| 0.0041979 | 0 |
| 0.00418393 | 0 |
| 0.00417001 | 0 |
| 0.00415613 | 0 |
| 0.0041423 | 0 |
| 0.00412852 | 0 |
| 0.00411478 | 0 |
| 0.00410109 | 0 |
| 0.00408744 | 0 |
| 0.00407384 | 0 |
| 0.00406028 | 0 |
| 0.00404677 | 0 |
| 0.00403331 | 0 |
| 0.00401989 | 0 |
| 0.00400651 | 0 |
| 0.00399318 | 0 |
| 0.00397989 | 0 |
| 0.00396665 | 0 |
| 0.00395345 | 0 |
| 0.00394029 | 0 |
| 0.00392718 | 0 |
| 0.00391411 | 0 |
| 0.00390109 | 0 |
| 0.00388811 | 0 |
| 0.00387517 | 0 |
| 0.00386228 | 0 |
| 0.00384942 | 0 |
| 0.00383662 | 0 |
| 0.00382385 | 0 |
| 0.00381112 | 0 |
| 0.00379844 | 0 |
| 0.0037858 | 0 |
| 0.00377321 | 0 |
| 0.00376065 | 0 |
| 0.00374814 | 0 |
| 0.00373566 | 0 |
| 0.00372323 | 0 |
| 0.00371084 | 0 |
| 0.0036985 | 0 |
| 0.00368619 | 0 |
| 0.00367392 | 0 |
| 0.0036617 | 0 |
| 0.00364951 | 0 |
| 0.00363737 | 0 |
| 0.00362527 | 0 |
| 0.0036132 | 0 |
| 0.00360118 | 0 |
| 0.0035892 | 0 |
| 0.00357725 | 0 |
| 0.00356535 | 0 |
| 0.00355349 | 0 |
| 0.00354166 | 0 |
| 0.00352988 | 0 |
| 0.00351813 | 0 |
| 0.00350643 | 0 |
| 0.00349476 | 0 |
| 0.00348313 | 0 |
| 0.00347154 | 0 |
| 0.00345999 | 0 |
| 0.00344847 | 0 |
| 0.003437 | 0 |
| 0.00342556 | 0 |
| 0.00341416 | 0 |
| 0.0034028 | 0 |
| 0.00339148 | 0 |
| 0.00338019 | 0 |
| 0.00336895 | 0 |
| 0.00335774 | 0 |
| 0.00334656 | 0 |
| 0.00333543 | 0 |
| 0.00332433 | 0 |
| 0.00331327 | 0 |
| 0.00330224 | 0 |
| 0.00329125 | 0 |
| 0.0032803 | 0 |
| 0.00326939 | 0 |
| 0.00325851 | 0 |
| 0.00324766 | 0 |
| 0.00323686 | 0 |
| 0.00322609 | 0 |
| 0.00321535 | 0 |
| 0.00320465 | 0 |
| 0.00319399 | 0 |
| 0.00318336 | 0 |
| 0.00317277 | 0 |
| 0.00316221 | 0 |
| 0.00315169 | 0 |
| 0.0031412 | 0 |
| 0.00313075 | 0 |
| 0.00312033 | 0 |
| 0.00310995 | 0 |
| 0.0030996 | 0 |
| 0.00308928 | 0 |
| 0.00307901 | 0 |
| 0.00306876 | 0 |
| 0.00305855 | 0 |
| 0.00304837 | 0 |
| 0.00303823 | 0 |
| 0.00302812 | 0 |
| 0.00301804 | 0 |
| 0.003008 | 0 |
| 0.00299799 | 0 |
| 0.00298801 | 0 |
| 0.00297807 | 0 |
| 0.00296816 | 0 |
| 0.00295828 | 0 |
| 0.00294844 | 0 |
| 0.00293863 | 0 |
| 0.00292885 | 0 |
| 0.0029191 | 0 |
| 0.00290939 | 0 |
| 0.00289971 | 0 |
| 0.00289006 | 0 |
| 0.00288044 | 0 |
| 0.00287086 | 0 |
| 0.00286131 | 0 |
| 0.00285179 | 0 |
| 0.0028423 | 0 |
| 0.00283284 | 0 |
| 0.00282341 | 0 |
| 0.00281402 | 0 |
| 0.00280465 | 0 |
| 0.00279532 | 0 |
| 0.00278602 | 0 |
| 0.00277675 | 0 |
| 0.00276751 | 0 |
| 0.0027583 | 0 |
| 0.00274912 | 0 |
| 0.00273997 | 0 |
| 0.00273086 | 0 |
| 0.00272177 | 0 |
| 0.00271271 | 0 |
| 0.00270369 | 0 |
| 0.00269469 | 0 |
| 0.00268572 | 0 |
| 0.00267679 | 0 |
| 0.00266788 | 0 |
| 0.002659 | 0 |
| 0.00265015 | 0 |
| 0.00264133 | 0 |
| 0.00263255 | 0 |
| 0.00262379 | 0 |
| 0.00261505 | 0 |
| 0.00260635 | 0 |
| 0.00259768 | 0 |
| 0.00258904 | 0 |
| 0.00258042 | 0 |
| 0.00257183 | 0 |
| 0.00256328 | 0 |
| 0.00255475 | 0 |
| 0.00254625 | 0 |
| 0.00253777 | 0 |
| 0.00252933 | 0 |
| 0.00252091 | 0 |
| 0.00251252 | 0 |
| 0.00250416 | 0 |
| 0.00249583 | 0 |
| 0.00248753 | 0 |
| 0.00247925 | 0 |
| 0.002471 | 0 |
| 0.00246278 | 0 |
| 0.00245458 | 0 |
| 0.00244641 | 0 |
| 0.00243827 | 0 |
| 0.00243016 | 0 |
| 0.00242207 | 0 |
| 0.00241401 | 0 |
| 0.00240598 | 0 |
| 0.00239798 | 0 |
| 0.00239 | 0 |
| 0.00238204 | 0 |
| 0.00237412 | 0 |
| 0.00236622 | 0 |
| 0.00235834 | 0 |
| 0.0023505 | 0 |
| 0.00234267 | 0 |
| 0.00233488 | 0 |
| 0.00232711 | 0 |
| 0.00231937 | 0 |
| 0.00231165 | 0 |
| 0.00230396 | 0 |
| 0.00229629 | 0 |
| 0.00228865 | 0 |
| 0.00228103 | 0 |
| 0.00227344 | 0 |
| 0.00226588 | 0 |
| 0.00225834 | 0 |
| 0.00225082 | 0 |
| 0.00224333 | 0 |
| 0.00223587 | 0 |
| 0.00222843 | 0 |
| 0.00222101 | 0 |
| 0.00221362 | 0 |
| 0.00220626 | 0 |
| 0.00219892 | 0 |
| 0.0021916 | 0 |
| 0.00218431 | 0 |
| 0.00217704 | 0 |
| 0.00216979 | 0 |
| 0.00216257 | 0 |
| 0.00215538 | 0 |
| 0.00214821 | 0 |
| 0.00214106 | 0 |
| 0.00213393 | 0 |
| 0.00212683 | 0 |
| 0.00211975 | 0 |
| 0.0021127 | 0 |
| 0.00210567 | 0 |
| 0.00209866 | 0 |
| 0.00209168 | 0 |
| 0.00208472 | 0 |
| 0.00207778 | 0 |
| 0.00207087 | 0 |
| 0.00206398 | 0 |
| 0.00205711 | 0 |
| 0.00205027 | 0 |
| 0.00204344 | 0 |
| 0.00203664 | 0 |
| 0.00202987 | 0 |
| 0.00202311 | 0 |
| 0.00201638 | 0 |
| 0.00200967 | 0 |
| 0.00200298 | 0 |
| 0.00199632 | 0 |
| 0.00198968 | 0 |
| 0.00198305 | 0 |
| 0.00197646 | 0 |
| 0.00196988 | 0 |
| 0.00196332 | 0 |
| 0.00195679 | 0 |
| 0.00195028 | 0 |
| 0.00194379 | 0 |
| 0.00193732 | 0 |
| 0.00193088 | 0 |
| 0.00192445 | 0 |
| 0.00191805 | 0 |
| 0.00191166 | 0 |
| 0.0019053 | 0 |
| 0.00189896 | 0 |
| 0.00189264 | 0 |
| 0.00188635 | 0 |
| 0.00188007 | 0 |
| 0.00187381 | 0 |
| 0.00186758 | 0 |
| 0.00186136 | 0 |
| 0.00185517 | 0 |
| 0.001849 | 0 |
| 0.00184284 | 0 |
| 0.00183671 | 0 |
| 0.0018306 | 0 |
| 0.00182451 | 0 |
| 0.00181844 | 0 |
| 0.00181239 | 0 |
| 0.00180636 | 0 |
| 0.00180035 | 0 |
| 0.00179436 | 0 |
| 0.00178838 | 0 |
| 0.00178243 | 0 |
| 0.0017765 | 0 |
| 0.00177059 | 0 |
| 0.0017647 | 0 |
| 0.00175883 | 0 |
| 0.00175297 | 0 |
| 0.00174714 | 0 |
| 0.00174133 | 0 |
| 0.00173553 | 0 |
| 0.00172976 | 0 |
| 0.001724 | 0 |
| 0.00171827 | 0 |
| 0.00171255 | 0 |
| 0.00170685 | 0 |
| 0.00170117 | 0 |
| 0.00169551 | 0 |
| 0.00168987 | 0 |
| 0.00168424 | 0 |
| 0.00167864 | 0 |
| 0.00167305 | 0 |
| 0.00166749 | 0 |
| 0.00166194 | 0 |
| 0.00165641 | 0 |
| 0.0016509 | 0 |
| 0.0016454 | 0 |
| 0.00163993 | 0 |
| 0.00163447 | 0 |
| 0.00162903 | 0 |
| 0.00162361 | 0 |
| 0.00161821 | 0 |
| 0.00161282 | 0 |
| 0.00160746 | 0 |
| 0.00160211 | 0 |
| 0.00159678 | 0 |
| 0.00159146 | 0 |
| 0.00158617 | 0 |
| 0.00158089 | 0 |
| 0.00157563 | 0 |
| 0.00157039 | 0 |
| 0.00156516 | 0 |
| 0.00155995 | 0 |
| 0.00155476 | 0 |
| 0.00154959 | 0 |
| 0.00154443 | 0 |
| 0.00153929 | 0 |
| 0.00153417 | 0 |
| 0.00152907 | 0 |
| 0.00152398 | 0 |
| 0.00151891 | 0 |
| 0.00151385 | 0 |
| 0.00150882 | 0 |
| 0.0015038 | 0 |
| 0.00149879 | 0 |
| 0.0014938 | 0 |
| 0.00148883 | 0 |
| 0.00148388 | 0 |
| 0.00147894 | 0 |
| 0.00147402 | 0 |
| 0.00146912 | 0 |
| 0.00146423 | 0 |
| 0.00145935 | 0 |
| 0.0014545 | 0 |
| 0.00144966 | 0 |
| 0.00144483 | 0 |
| 0.00144003 | 0 |
| 0.00143524 | 0 |
| 0.00143046 | 0 |
| 0.0014257 | 0 |
| 0.00142096 | 0 |
| 0.00141623 | 0 |
| 0.00141151 | 0 |
| 0.00140682 | 0 |
| 0.00140214 | 0 |
| 0.00139747 | 0 |
| 0.00139282 | 0 |
| 0.00138819 | 0 |
| 0.00138357 | 0 |
| 0.00137896 | 0 |
| 0.00137437 | 0 |
| 0.0013698 | 0 |
| 0.00136524 | 0 |
| 0.0013607 | 0 |
| 0.00135617 | 0 |
| 0.00135166 | 0 |
| 0.00134716 | 0 |
| 0.00134268 | 0 |
| 0.00133821 | 0 |
| 0.00133376 | 0 |
| 0.00132932 | 0 |
| 0.0013249 | 0 |
| 0.00132049 | 0 |
| 0.00131609 | 0 |
| 0.00131171 | 0 |
| 0.00130735 | 0 |
| 0.001303 | 0 |
| 0.00129866 | 0 |
| 0.00129434 | 0 |
| 0.00129004 | 0 |
| 0.00128574 | 0 |
| 0.00128146 | 0 |
| 0.0012772 | 0 |
| 0.00127295 | 0 |
| 0.00126871 | 0 |
| 0.00126449 | 0 |
| 0.00126029 | 0 |
| 0.00125609 | 0 |
| 0.00125191 | 0 |
| 0.00124775 | 0 |
| 0.00124359 | 0 |
| 0.00123946 | 0 |
| 0.00123533 | 0 |
| 0.00123122 | 0 |
| 0.00122712 | 0 |
| 0.00122304 | 0 |
| 0.00121897 | 0 |
| 0.00121491 | 0 |
| 0.00121087 | 0 |
| 0.00120684 | 0 |
| 0.00120283 | 0 |
| 0.00119882 | 0 |
| 0.00119484 | 0 |
| 0.00119086 | 0 |
| 0.0011869 | 0 |
| 0.00118295 | 0 |
| 0.00117901 | 0 |
| 0.00117509 | 0 |
| 0.00117118 | 0 |
| 0.00116728 | 0 |
| 0.0011634 | 0 |
| 0.00115953 | 0 |
| 0.00115567 | 0 |
| 0.00115182 | 0 |
| 0.00114799 | 0 |
| 0.00114417 | 0 |
| 0.00114036 | 0 |
| 0.00113657 | 0 |
| 0.00113278 | 0 |
| 0.00112902 | 0 |
| 0.00112526 | 0 |
| 0.00112151 | 0 |
| 0.00111778 | 0 |
| 0.00111406 | 0 |
| 0.00111036 | 0 |
| 0.00110666 | 0 |
| 0.00110298 | 0 |
| 0.00109931 | 0 |
| 0.00109565 | 0 |
| 0.001092 | 0 |
| 0.00108837 | 0 |
| 0.00108475 | 0 |
| 0.00108114 | 0 |
| 0.00107754 | 0 |
| 0.00107396 | 0 |
| 0.00107038 | 0 |
| 0.00106682 | 0 |
| 0.00106327 | 0 |
| 0.00105973 | 0 |
| 0.00105621 | 0 |
| 0.00105269 | 0 |
| 0.00104919 | 0 |
| 0.0010457 | 0 |
| 0.00104222 | 0 |
| 0.00103875 | 0 |
| 0.00103529 | 0 |
| 0.00103185 | 0 |
| 0.00102842 | 0 |
| 0.00102499 | 0 |
| 0.00102158 | 0 |
| 0.00101818 | 0 |
| 0.0010148 | 0 |
| 0.00101142 | 0 |
| 0.00100805 | 0 |
| 0.0010047 | 0 |
| 0.00100136 | 0 |
| 0.000998024 | 0 |
| 0.000994703 | 0 |
| 0.000991393 | 0 |
| 0.000988094 | 0 |
| 0.000984806 | 0 |
| 0.000981529 | 0 |
| 0.000978263 | 0 |
| 0.000975008 | 0 |
| 0.000971763 | 0 |
| 0.00096853 | 0 |
| 0.000965307 | 0 |
| 0.000962095 | 0 |
| 0.000958893 | 0 |
| 0.000955703 | 0 |
| 0.000952522 | 0 |
| 0.000949353 | 0 |
| 0.000946194 | 0 |
| 0.000943045 | 0 |
| 0.000939907 | 0 |
| 0.00093678 | 0 |
| 0.000933663 | 0 |
| 0.000930556 | 0 |
| 0.000927459 | 0 |
| 0.000924373 | 0 |
| 0.000921297 | 0 |
| 0.000918232 | 0 |
| 0.000915176 | 0 |
| 0.000912131 | 0 |
| 0.000909096 | 0 |
| 0.000906071 | 0 |
| 0.000903056 | 0 |
| 0.000900051 | 0 |
| 0.000897056 | 0 |
| 0.000894071 | 0 |
| 0.000891096 | 0 |
| 0.000888131 | 0 |
| 0.000885175 | 0 |
| 0.00088223 | 0 |
| 0.000879294 | 0 |
| 0.000876368 | 0 |
| 0.000873452 | 0 |
| 0.000870546 | 0 |
| 0.000867649 | 0 |
| 0.000864762 | 0 |
| 0.000861884 | 0 |
| 0.000859016 | 0 |
| 0.000856158 | 0 |
| 0.000853309 | 0 |
| 0.00085047 | 0 |
| 0.00084764 | 0 |
| 0.000844819 | 0 |
| 0.000842008 | 0 |
| 0.000839206 | 0 |
| 0.000836414 | 0 |
| 0.00083363 | 0 |
| 0.000830856 | 0 |
| 0.000828092 | 0 |
| 0.000825336 | 0 |
| 0.00082259 | 0 |
| 0.000819853 | 0 |
| 0.000817125 | 0 |
| 0.000814406 | 0 |
| 0.000811696 | 0 |
| 0.000808995 | 0 |
| 0.000806303 | 0 |
| 0.00080362 | 0 |
| 0.000800946 | 0 |
| 0.00079828 | 0 |
| 0.000795624 | 0 |
| 0.000792977 | 0 |
| 0.000790338 | 0 |
| 0.000787708 | 0 |
| 0.000785087 | 0 |
| 0.000782475 | 0 |
| 0.000779871 | 0 |
| 0.000777276 | 0 |
| 0.000774689 | 0 |
| 0.000772112 | 0 |
| 0.000769542 | 0 |
| 0.000766982 | 0 |
| 0.000764429 | 0 |
| 0.000761886 | 0 |
| 0.000759351 | 0 |
| 0.000756824 | 0 |
| 0.000754305 | 0 |
| 0.000751795 | 0 |
| 0.000749294 | 0 |
| 0.000746801 | 0 |
| 0.000744315 | 0 |
| 0.000741839 | 0 |
| 0.00073937 | 0 |
| 0.00073691 | 0 |
| 0.000734458 | 0 |
| 0.000732014 | 0 |
| 0.000729578 | 0 |
| 0.00072715 | 0 |
| 0.000724731 | 0 |
| 0.000722319 | 0 |
| 0.000719916 | 0 |
| 0.00071752 | 0 |
| 0.000715133 | 0 |
| 0.000712753 | 0 |
| 0.000710381 | 0 |
| 0.000708017 | 0 |
| 0.000705661 | 0 |
| 0.000703313 | 0 |
| 0.000700973 | 0 |
| 0.000698641 | 0 |
| 0.000696316 | 0 |
| 0.000693999 | 0 |
| 0.000691689 | 0 |
| 0.000689388 | 0 |
| 0.000687094 | 0 |
| 0.000684807 | 0 |
| 0.000682529 | 0 |
| 0.000680258 | 0 |
| 0.000677994 | 0 |
| 0.000675738 | 0 |
| 0.000673489 | 0 |
| 0.000671248 | 0 |
| 0.000669015 | 0 |
| 0.000666789 | 0 |
| 0.00066457 | 0 |
| 0.000662358 | 0 |
| 0.000660154 | 0 |
| 0.000657958 | 0 |
| 0.000655768 | 0 |
| 0.000653586 | 0 |
| 0.000651411 | 0 |
| 0.000649244 | 0 |
| 0.000647083 | 0 |
| 0.00064493 | 0 |
| 0.000642784 | 0 |
| 0.000640645 | 0 |
| 0.000638513 | 0 |
| 0.000636389 | 0 |
| 0.000634271 | 0 |
| 0.000632161 | 0 |
| 0.000630057 | 0 |
| 0.000627961 | 0 |
| 0.000625871 | 0 |
| 0.000623788 | 0 |
| 0.000621713 | 0 |
| 0.000619644 | 0 |
| 0.000617582 | 0 |
| 0.000615527 | 0 |
| 0.000613479 | 0 |
| 0.000611437 | 0 |
| 0.000609403 | 0 |
| 0.000607375 | 0 |
| 0.000605354 | 0 |
| 0.00060334 | 0 |
| 0.000601332 | 0 |
| 0.000599331 | 0 |
| 0.000597337 | 0 |
| 0.000595349 | 0 |
| 0.000593368 | 0 |
| 0.000591394 | 0 |
| 0.000589426 | 0 |
| 0.000587464 | 0 |
| 0.00058551 | 0 |
| 0.000583561 | 0 |
| 0.000581619 | 0 |
| 0.000579684 | 0 |
| 0.000577755 | 0 |
| 0.000575833 | 0 |
| 0.000573916 | 0 |
| 0.000572007 | 0 |
| 0.000570103 | 0 |
| 0.000568206 | 0 |
| 0.000566316 | 0 |
| 0.000564431 | 0 |
| 0.000562553 | 0 |
| 0.000560681 | 0 |
| 0.000558815 | 0 |
| 0.000556956 | 0 |
| 0.000555103 | 0 |
| 0.000553255 | 0 |
| 0.000551414 | 0 |
| 0.00054958 | 0 |
| 0.000547751 | 0 |
| 0.000545928 | 0 |
| 0.000544112 | 0 |
| 0.000542301 | 0 |
| 0.000540497 | 0 |
| 0.000538698 | 0 |
| 0.000536905 | 0 |
| 0.000535119 | 0 |
| 0.000533338 | 0 |
| 0.000531564 | 0 |
| 0.000529795 | 0 |
| 0.000528032 | 0 |
| 0.000526275 | 0 |
| 0.000524524 | 0 |
| 0.000522778 | 0 |
| 0.000521039 | 0 |
| 0.000519305 | 0 |
| 0.000517577 | 0 |
| 0.000515855 | 0 |
| 0.000514138 | 0 |
| 0.000512427 | 0 |
| 0.000510722 | 0 |
| 0.000509023 | 0 |
| 0.000507329 | 0 |
| 0.000505641 | 0 |
| 0.000503958 | 0 |
| 0.000502281 | 0 |
| 0.00050061 | 0 |
| 0.000498944 | 0 |
| 0.000497284 | 0 |
| 0.000495629 | 0 |
| 0.00049398 | 0 |
| 0.000492336 | 0 |
| 0.000490698 | 0 |
| 0.000489065 | 0 |
| 0.000487438 | 0 |
| 0.000485816 | 0 |
| 0.000484199 | 0 |
| 0.000482588 | 0 |
| 0.000480982 | 0 |
| 0.000479382 | 0 |
| 0.000477786 | 0 |
| 0.000476197 | 0 |
| 0.000474612 | 0 |
| 0.000473033 | 0 |
| 0.000471459 | 0 |
| 0.00046989 | 0 |
| 0.000468326 | 0 |
| 0.000466768 | 0 |
| 0.000465215 | 0 |
| 0.000463667 | 0 |
| 0.000462124 | 0 |
| 0.000460586 | 0 |
| 0.000459054 | 0 |
| 0.000457526 | 0 |
| 0.000456004 | 0 |
| 0.000454486 | 0 |
| 0.000452974 | 0 |
| 0.000451467 | 0 |
| 0.000449964 | 0 |
| 0.000448467 | 0 |
| 0.000446975 | 0 |
| 0.000445487 | 0 |
| 0.000444005 | 0 |
| 0.000442528 | 0 |
| 0.000441055 | 0 |
| 0.000439587 | 0 |
| 0.000438125 | 0 |
| 0.000436667 | 0 |
| 0.000435214 | 0 |
| 0.000433766 | 0 |
| 0.000432322 | 0 |
| 0.000430884 | 0 |
| 0.00042945 | 0 |
| 0.000428021 | 0 |
| 0.000426597 | 0 |
| 0.000425177 | 0 |
| 0.000423762 | 0 |
| 0.000422352 | 0 |
| 0.000420947 | 0 |
| 0.000419546 | 0 |
| 0.00041815 | 0 |
| 0.000416759 | 0 |
| 0.000415372 | 0 |
| 0.00041399 | 0 |
| 0.000412612 | 0 |
| 0.000411239 | 0 |
| 0.000409871 | 0 |
| 0.000408507 | 0 |
| 0.000407147 | 0 |
| 0.000405793 | 0 |
| 0.000404442 | 0 |
| 0.000403097 | 0 |
| 0.000401755 | 0 |
| 0.000400418 | 0 |
| 0.000399086 | 0 |
| 0.000397758 | 0 |
| 0.000396434 | 0 |
| 0.000395115 | 0 |
| 0.000393801 | 0 |
| 0.00039249 | 0 |
| 0.000391184 | 0 |
| 0.000389882 | 0 |
| 0.000388585 | 0 |
| 0.000387292 | 0 |
| 0.000386003 | 0 |
| 0.000384719 | 0 |
| 0.000383439 | 0 |
| 0.000382163 | 0 |
| 0.000380891 | 0 |
| 0.000379624 | 0 |
| 0.000378361 | 0 |
| 0.000377102 | 0 |
| 0.000375847 | 0 |
| 0.000374596 | 0 |
| 0.00037335 | 0 |
| 0.000372107 | 0 |
| 0.000370869 | 0 |
| 0.000369635 | 0 |
| 0.000368405 | 0 |
| 0.000367179 | 0 |
| 0.000365957 | 0 |
| 0.00036474 | 0 |
| 0.000363526 | 0 |
| 0.000362316 | 0 |
| 0.000361111 | 0 |
| 0.000359909 | 0 |
| 0.000358711 | 0 |
| 0.000357518 | 0 |
| 0.000356328 | 0 |
| 0.000355142 | 0 |
| 0.000353961 | 0 |
| 0.000352783 | 0 |
| 0.000351609 | 0 |
| 0.000350439 | 0 |
| 0.000349273 | 0 |
| 0.000348111 | 0 |
| 0.000346952 | 0 |
| 0.000345798 | 0 |
| 0.000344647 | 0 |
| 0.0003435 | 0 |
| 0.000342357 | 0 |
| 0.000341218 | 0 |
| 0.000340083 | 0 |
| 0.000338951 | 0 |
| 0.000337823 | 0 |
| 0.000336699 | 0 |
| 0.000335579 | 0 |
| 0.000334462 | 0 |
| 0.000333349 | 0 |
| 0.00033224 | 0 |
| 0.000331134 | 0 |
| 0.000330032 | 0 |
| 0.000328934 | 0 |
| 0.00032784 | 0 |
| 0.000326749 | 0 |
| 0.000325661 | 0 |
| 0.000324578 | 0 |
| 0.000323498 | 0 |
| 0.000322421 | 0 |
| 0.000321348 | 0 |
| 0.000320279 | 0 |
| 0.000319213 | 0 |
| 0.000318151 | 0 |
| 0.000317093 | 0 |
| 0.000316037 | 0 |
| 0.000314986 | 0 |
| 0.000313938 | 0 |
| 0.000312893 | 0 |
| 0.000311852 | 0 |
| 0.000310814 | 0 |
| 0.00030978 | 0 |
| 0.000308749 | 0 |
| 0.000307722 | 0 |
| 0.000306698 | 0 |
| 0.000305677 | 0 |
| 0.00030466 | 0 |
| 0.000303646 | 0 |
| 0.000302636 | 0 |
| 0.000301629 | 0 |
| 0.000300625 | 0 |
| 0.000299625 | 0 |
| 0.000298628 | 0 |
| 0.000297634 | 0 |
| 0.000296644 | 0 |
| 0.000295657 | 0 |
| 0.000294673 | 0 |
| 0.000293692 | 0 |
| 0.000292715 | 0 |
| 0.000291741 | 0 |
| 0.00029077 | 0 |
| 0.000289803 | 0 |
| 0.000288838 | 0 |
| 0.000287877 | 0 |
| 0.000286919 | 0 |
| 0.000285965 | 0 |
| 0.000285013 | 0 |
| 0.000284065 | 0 |
| 0.000283119 | 0 |
| 0.000282177 | 0 |
| 0.000281238 | 0 |
| 0.000280302 | 0 |
| 0.00027937 | 0 |
| 0.00027844 | 0 |
| 0.000277514 | 0 |
| 0.00027659 | 0 |
| 0.00027567 | 0 |
| 0.000274753 | 0 |
| 0.000273838 | 0 |
| 0.000272927 | 0 |
| 0.000272019 | 0 |
| 0.000271114 | 0 |
| 0.000270212 | 0 |
| 0.000269312 | 0 |
| 0.000268416 | 0 |
| 0.000267523 | 0 |
| 0.000266633 | 0 |
| 0.000265746 | 0 |
| 0.000264861 | 0 |
| 0.00026398 | 0 |
| 0.000263102 | 0 |
| 0.000262226 | 0 |
| 0.000261354 | 0 |
| 0.000260484 | 0 |
| 0.000259617 | 0 |
| 0.000258753 | 0 |
| 0.000257892 | 0 |
| 0.000257034 | 0 |
| 0.000256179 | 0 |
| 0.000255326 | 0 |
| 0.000254477 | 0 |
| 0.00025363 | 0 |
| 0.000252786 | 0 |
| 0.000251945 | 0 |
| 0.000251107 | 0 |
| 0.000250271 | 0 |
| 0.000249438 | 0 |
| 0.000248608 | 0 |
| 0.000247781 | 0 |
| 0.000246956 | 0 |
| 0.000246135 | 0 |
| 0.000245316 | 0 |
| 0.000244499 | 0 |
| 0.000243686 | 0 |
| 0.000242875 | 0 |
| 0.000242067 | 0 |
| 0.000241261 | 0 |
| 0.000240458 | 0 |
| 0.000239658 | 0 |
| 0.000238861 | 0 |
| 0.000238066 | 0 |
| 0.000237274 | 0 |
| 0.000236484 | 0 |
| 0.000235697 | 0 |
| 0.000234913 | 0 |
| 0.000234131 | 0 |
| 0.000233352 | 0 |
| 0.000232576 | 0 |
| 0.000231802 | 0 |
| 0.000231031 | 0 |
| 0.000230262 | 0 |
| 0.000229496 | 0 |
| 0.000228732 | 0 |
| 0.000227971 | 0 |
| 0.000227212 | 0 |
| 0.000226456 | 0 |
| 0.000225703 | 0 |
| 0.000224952 | 0 |
| 0.000224203 | 0 |
| 0.000223457 | 0 |
| 0.000222713 | 0 |
| 0.000221972 | 0 |
| 0.000221234 | 0 |
| 0.000220498 | 0 |
| 0.000219764 | 0 |
| 0.000219033 | 0 |
| 0.000218304 | 0 |
| 0.000217577 | 0 |
| 0.000216853 | 0 |
| 0.000216132 | 0 |
| 0.000215413 | 0 |
| 0.000214696 | 0 |
| 0.000213981 | 0 |
| 0.000213269 | 0 |
| 0.00021256 | 0 |
| 0.000211852 | 0 |
| 0.000211147 | 0 |
| 0.000210445 | 0 |
| 0.000209745 | 0 |
| 0.000209047 | 0 |
| 0.000208351 | 0 |
| 0.000207658 | 0 |
| 0.000206967 | 0 |
| 0.000206278 | 0 |
| 0.000205592 | 0 |
| 0.000204908 | 0 |
| 0.000204226 | 0 |
| 0.000203546 | 0 |
| 0.000202869 | 0 |
| 0.000202194 | 0 |
| 0.000201521 | 0 |
| 0.00020085 | 0 |
| 0.000200182 | 0 |
| 0.000199516 | 0 |
| 0.000198852 | 0 |
| 0.00019819 | 0 |
| 0.000197531 | 0 |
| 0.000196874 | 0 |
| 0.000196218 | 0 |
| 0.000195566 | 0 |
| 0.000194915 | 0 |
| 0.000194266 | 0 |
| 0.00019362 | 0 |
| 0.000192975 | 0 |
| 0.000192333 | 0 |
| 0.000191693 | 0 |
| 0.000191055 | 0 |
| 0.00019042 | 0 |
| 0.000189786 | 0 |
| 0.000189155 | 0 |
| 0.000188525 | 0 |
| 0.000187898 | 0 |
| 0.000187273 | 0 |
| 0.000186649 | 0 |
| 0.000186028 | 0 |
| 0.000185409 | 0 |
| 0.000184792 | 0 |
| 0.000184177 | 0 |
| 0.000183565 | 0 |
| 0.000182954 | 0 |
| 0.000182345 | 0 |
| 0.000181738 | 0 |
| 0.000181134 | 0 |
| 0.000180531 | 0 |
| 0.00017993 | 0 |
| 0.000179331 | 0 |
| 0.000178735 | 0 |
| 0.00017814 | 0 |
| 0.000177547 | 0 |
| 0.000176956 | 0 |
| 0.000176367 | 0 |
| 0.000175781 | 0 |
| 0.000175196 | 0 |
| 0.000174613 | 0 |
| 0.000174032 | 0 |
| 0.000173453 | 0 |
| 0.000172875 | 0 |
| 0.0001723 | 0 |
| 0.000171727 | 0 |
| 0.000171155 | 0 |
| 0.000170586 | 0 |
| 0.000170018 | 0 |
| 0.000169452 | 0 |
| 0.000168889 | 0 |
| 0.000168327 | 0 |
| 0.000167767 | 0 |
| 0.000167208 | 0 |
| 0.000166652 | 0 |
| 0.000166097 | 0 |
| 0.000165545 | 0 |
| 0.000164994 | 0 |
| 0.000164445 | 0 |
| 0.000163898 | 0 |
| 0.000163352 | 0 |
| 0.000162809 | 0 |
| 0.000162267 | 0 |
| 0.000161727 | 0 |
| 0.000161189 | 0 |
| 0.000160652 | 0 |
| 0.000160118 | 0 |
| 0.000159585 | 0 |
| 0.000159054 | 0 |
| 0.000158525 | 0 |
| 0.000157997 | 0 |
| 0.000157472 | 0 |
| 0.000156948 | 0 |
| 0.000156425 | 0 |
| 0.000155905 | 0 |
| 0.000155386 | 0 |
| 0.000154869 | 0 |
| 0.000154354 | 0 |
| 0.00015384 | 0 |
| 0.000153328 | 0 |
| 0.000152818 | 0 |
| 0.000152309 | 0 |
| 0.000151803 | 0 |
| 0.000151297 | 0 |
| 0.000150794 | 0 |
| 0.000150292 | 0 |
| 0.000149792 | 0 |
| 0.000149294 | 0 |
| 0.000148797 | 0 |
| 0.000148302 | 0 |
| 0.000147808 | 0 |
| 0.000147316 | 0 |
| 0.000146826 | 0 |
| 0.000146338 | 0 |
| 0.000145851 | 0 |
| 0.000145365 | 0 |
| 0.000144882 | 0 |
| 0.0001444 | 0 |
| 0.000143919 | 0 |
| 0.00014344 | 0 |
| 0.000142963 | 0 |
| 0.000142487 | 0 |
| 0.000142013 | 0 |
| 0.00014154 | 0 |
| 0.000141069 | 0 |
| 0.0001406 | 0 |
| 0.000140132 | 0 |
| 0.000139666 | 0 |
| 0.000139201 | 0 |
| 0.000138738 | 0 |
| 0.000138276 | 0 |
| 0.000137816 | 0 |
| 0.000137358 | 0 |
| 0.000136901 | 0 |
| 0.000136445 | 0 |
| 0.000135991 | 0 |
| 0.000135538 | 0 |
| 0.000135087 | 0 |
| 0.000134638 | 0 |
| 0.00013419 | 0 |
| 0.000133743 | 0 |
| 0.000133298 | 0 |
| 0.000132855 | 0 |
| 0.000132413 | 0 |
| 0.000131972 | 0 |
| 0.000131533 | 0 |
| 0.000131095 | 0 |
| 0.000130659 | 0 |
| 0.000130224 | 0 |
| 0.000129791 | 0 |
| 0.000129359 | 0 |
| 0.000128929 | 0 |
| 0.0001285 | 0 |
| 0.000128072 | 0 |
| 0.000127646 | 0 |
| 0.000127221 | 0 |
| 0.000126798 | 0 |
| 0.000126376 | 0 |
| 0.000125955 | 0 |
| 0.000125536 | 0 |
| 0.000125119 | 0 |
| 0.000124702 | 0 |
| 0.000124287 | 0 |
| 0.000123874 | 0 |
| 0.000123461 | 0 |
| 0.000123051 | 0 |
| 0.000122641 | 0 |
| 0.000122233 | 0 |
| 0.000121826 | 0 |
| 0.000121421 | 0 |
| 0.000121017 | 0 |
| 0.000120614 | 0 |
| 0.000120213 | 0 |
| 0.000119813 | 0 |
| 0.000119414 | 0 |
| 0.000119017 | 0 |
| 0.000118621 | 0 |
| 0.000118226 | 0 |
| 0.000117833 | 0 |
| 0.000117441 | 0 |
| 0.00011705 | 0 |
| 0.00011666 | 0 |
| 0.000116272 | 0 |
| 0.000115885 | 0 |
| 0.0001155 | 0 |
| 0.000115115 | 0 |
| 0.000114732 | 0 |
| 0.00011435 | 0 |
| 0.00011397 | 0 |
| 0.000113591 | 0 |
| 0.000113213 | 0 |
| 0.000112836 | 0 |
| 0.000112461 | 0 |
| 0.000112086 | 0 |
| 0.000111713 | 0 |
| 0.000111342 | 0 |
| 0.000110971 | 0 |
| 0.000110602 | 0 |
| 0.000110234 | 0 |
| 0.000109867 | 0 |
| 0.000109501 | 0 |
| 0.000109137 | 0 |
| 0.000108774 | 0 |
| 0.000108412 | 0 |
| 0.000108051 | 0 |
| 0.000107692 | 0 |
| 0.000107333 | 0 |
| 0.000106976 | 0 |
| 0.00010662 | 0 |
| 0.000106265 | 0 |
| 0.000105912 | 0 |
| 0.000105559 | 0 |
| 0.000105208 | 0 |
| 0.000104858 | 0 |
| 0.000104509 | 0 |
| 0.000104161 | 0 |
| 0.000103815 | 0 |
| 0.000103469 | 0 |
| 0.000103125 | 0 |
| 0.000102782 | 0 |
| 0.00010244 | 0 |
| 0.000102099 | 0 |
| 0.000101759 | 0 |
| 0.000101421 | 0 |
| 9.9737e-05 | 0 |
| 9.67964e-05 | 0 |
| 9.39426e-05 | 0 |
| 9.11729e-05 | 0 |
| 8.84849e-05 | 0 |
| 8.58761e-05 | 0 |
| 8.33442e-05 | 0 |
| 8.0887e-05 | 0 |
| 7.85022e-05 | 0 |
| 7.61877e-05 | 0 |
| 7.39415e-05 | 0 |
| 7.17615e-05 | 0 |
| 6.96457e-05 | 0 |
| 6.75924e-05 | 0 |
| 6.55996e-05 | 0 |
| 6.36655e-05 | 0 |
| 6.17885e-05 | 0 |
| 5.99668e-05 | 0 |
| 5.81988e-05 | 0 |
| 5.64829e-05 | 0 |
| 5.48176e-05 | 0 |
| 5.32014e-05 | 0 |
| 5.16329e-05 | 0 |
| 5.01106e-05 | 0 |
| 4.86332e-05 | 0 |
| 4.71994e-05 | 0 |
| 4.58078e-05 | 0 |
| 4.44572e-05 | 0 |
| 4.31465e-05 | 0 |
| 4.18744e-05 | 0 |
| 4.06399e-05 | 0 |
| 3.94417e-05 | 0 |
| 3.82788e-05 | 0 |
| 3.71502e-05 | 0 |
| 3.6055e-05 | 0 |
| 3.49919e-05 | 0 |
| 3.39603e-05 | 0 |
| 3.2959e-05 | 0 |
| 3.19873e-05 | 0 |
| 3.10442e-05 | 0 |
| 3.0129e-05 | 0 |
| 2.92407e-05 | 0 |
| 2.83786e-05 | 0 |
| 2.75419e-05 | 0 |
| 2.67299e-05 | 0 |
| 2.59418e-05 | 0 |
| 2.5177e-05 | 0 |
| 2.44347e-05 | 0 |
| 2.37143e-05 | 0 |
| 2.30151e-05 | 0 |
| 2.23366e-05 | 0 |
| 2.1678e-05 | 0 |
| 2.10389e-05 | 0 |
| 2.04186e-05 | 0 |
| 1.98166e-05 | 0 |
| 1.92323e-05 | 0 |
| 1.86653e-05 | 0 |
| 1.8115e-05 | 0 |
| 1.75809e-05 | 0 |
| 1.70626e-05 | 0 |
| 1.65595e-05 | 0 |
| 1.60713e-05 | 0 |
| 1.55975e-05 | 0 |
| 1.51376e-05 | 0 |
| 1.46913e-05 | 0 |
| 1.42582e-05 | 0 |
| 1.38378e-05 | 0 |
| 1.34298e-05 | 0 |
| 1.30339e-05 | 0 |
| 1.26496e-05 | 0 |
| 1.22767e-05 | 0 |
| 1.19147e-05 | 0 |
| 1.15634e-05 | 0 |
| 1.12225e-05 | 0 |
| 1.08916e-05 | 0 |
| 1.05705e-05 | 0 |
| 1.02589e-05 | 0 |
| 9.9564e-06 | 0 |
| 9.66286e-06 | 0 |
| 9.37797e-06 | 0 |
| 9.10148e-06 | 0 |
| 8.83314e-06 | 0 |
| 8.57272e-06 | 0 |
| 8.31997e-06 | 0 |
| 8.07467e-06 | 0 |
| 7.83661e-06 | 0 |
| 7.60556e-06 | 0 |
| 7.38133e-06 | 0 |
| 7.16371e-06 | 0 |
| 6.9525e-06 | 0 |
| 6.74752e-06 | 0 |
| 6.54858e-06 | 0 |
| 6.35551e-06 | 0 |
| 6.16813e-06 | 0 |
| 5.98628e-06 | 0 |
| 5.80979e-06 | 0 |
| 5.6385e-06 | 0 |
| 5.47226e-06 | 0 |
| 5.31092e-06 | 0 |
| 5.15434e-06 | 0 |
| 5.00237e-06 | 0 |
| 4.85489e-06 | 0 |
| 4.71175e-06 | 0 |
| 4.57284e-06 | 0 |
| 4.43802e-06 | 0 |
| 4.30717e-06 | 0 |
| 4.18018e-06 | 0 |
| 4.05694e-06 | 0 |
| 3.93733e-06 | 0 |
| 3.82125e-06 | 0 |
| 3.70858e-06 | 0 |
| 3.59924e-06 | 0 |
| 3.49313e-06 | 0 |
| 3.39014e-06 | 0 |
| 3.29019e-06 | 0 |
| 3.19319e-06 | 0 |
| 3.09904e-06 | 0 |
| 3.00767e-06 | 0 |
| 2.919e-06 | 0 |
| 2.83294e-06 | 0 |
| 2.74941e-06 | 0 |
| 2.66835e-06 | 0 |
| 2.58968e-06 | 0 |
| 2.51333e-06 | 0 |
| 2.43923e-06 | 0 |
| 2.36732e-06 | 0 |
| 2.29752e-06 | 0 |
| 2.22978e-06 | 0 |
| 2.16404e-06 | 0 |
| 2.10024e-06 | 0 |
| 2.03832e-06 | 0 |
| 1.97822e-06 | 0 |
| 1.9199e-06 | 0 |
| 1.8633e-06 | 0 |
| 1.80836e-06 | 0 |
| 1.75504e-06 | 0 |
| 1.7033e-06 | 0 |
| 1.65308e-06 | 0 |
| 1.60434e-06 | 0 |
| 1.55704e-06 | 0 |
| 1.51114e-06 | 0 |
| 1.46659e-06 | 0 |
| 1.42335e-06 | 0 |
| 1.38138e-06 | 0 |
| 1.34065e-06 | 0 |
| 1.30113e-06 | 0 |
| 1.26277e-06 | 0 |
| 1.22554e-06 | 0 |
| 1.1894e-06 | 0 |
| 1.15434e-06 | 0 |
| 1.1203e-06 | 0 |
| 1.08727e-06 | 0 |
| 1.05522e-06 | 0 |
| 1.02411e-06 | 0 |
| 9.93914e-07 | 0 |
| 9.64611e-07 | 0 |
| 9.36171e-07 | 0 |
| 9.0857e-07 | 0 |
| 8.81783e-07 | 0 |
| 8.55786e-07 | 0 |
| 8.30554e-07 | 0 |
| 8.06067e-07 | 0 |
| 7.82302e-07 | 0 |
| 7.59238e-07 | 0 |
| 7.36853e-07 | 0 |
| 7.15129e-07 | 0 |
| 6.94045e-07 | 0 |
| 6.73582e-07 | 0 |
| 6.53723e-07 | 0 |
| 6.34449e-07 | 0 |
| 6.15744e-07 | 0 |
| 5.9759e-07 | 0 |
| 5.79971e-07 | 0 |
| 5.62872e-07 | 0 |
| 5.46277e-07 | 0 |
| 5.30171e-07 | 0 |
| 5.1454e-07 | 0 |
| 4.9937e-07 | 0 |
| 4.84647e-07 | 0 |
| 4.70358e-07 | 0 |
| 4.56491e-07 | 0 |
| 4.43032e-07 | 0 |
| 4.2997e-07 | 0 |
| 4.17294e-07 | 0 |
| 4.04991e-07 | 0 |
| 3.9305e-07 | 0 |
| 3.81462e-07 | 0 |
| 3.70215e-07 | 0 |
| 3.593e-07 | 0 |
| 3.48707e-07 | 0 |
| 3.38426e-07 | 0 |
| 3.28449e-07 | 0 |
| 3.18765e-07 | 0 |
| 3.09367e-07 | 0 |
| 3.00246e-07 | 0 |
| 2.91394e-07 | 0 |
| 2.82803e-07 | 0 |
| 2.74465e-07 | 0 |
| 2.66373e-07 | 0 |
| 2.58519e-07 | 0 |
| 2.50897e-07 | 0 |
| 2.435e-07 | 0 |
| 2.36321e-07 | 0 |
| 2.29354e-07 | 0 |
| 2.22592e-07 | 0 |
| 2.16029e-07 | 0 |
| 2.0966e-07 | 0 |
| 2.03478e-07 | 0 |
| 1.97479e-07 | 0 |
| 1.91657e-07 | 0 |
| 1.86006e-07 | 0 |
| 1.80522e-07 | 0 |
| 1.752e-07 | 0 |
| 1.70035e-07 | 0 |
| 1.65022e-07 | 0 |
| 1.60156e-07 | 0 |
| 1.55434e-07 | 0 |
| 1.50852e-07 | 0 |
| 1.46404e-07 | 0 |
| 1.42088e-07 | 0 |
| 1.37899e-07 | 0 |
| 1.33833e-07 | 0 |
| 1.29887e-07 | 0 |
| 1.26058e-07 | 0 |
| 1.22341e-07 | 0 |
| 1.18734e-07 | 0 |
| 1.15234e-07 | 0 |
| 1.11836e-07 | 0 |
| 1.08539e-07 | 0 |
| 1.05339e-07 | 0 |
| 1.02233e-07 | 0 |
| 9.92191e-08 | 0 |
| 9.62938e-08 | 0 |
| 9.34548e-08 | 0 |
| 9.06995e-08 | 0 |
| 8.80254e-08 | 0 |
| 8.54302e-08 | 0 |
| 8.29115e-08 | 0 |
| 8.0467e-08 | 0 |
| 7.80946e-08 | 0 |
| 7.57921e-08 | 0 |
| 7.35576e-08 | 0 |
| 7.13889e-08 | 0 |
| 6.92841e-08 | 0 |
| 6.72414e-08 | 0 |
| 6.5259e-08 | 0 |
| 6.33349e-08 | 0 |
| 6.14676e-08 | 0 |
| 5.96554e-08 | 0 |
| 5.78966e-08 | 0 |
| 5.61896e-08 | 0 |
| 5.4533e-08 | 0 |
| 5.29252e-08 | 0 |
| 5.13648e-08 | 0 |
| 4.98504e-08 | 0 |
| 4.83807e-08 | 0 |
| 4.69543e-08 | 0 |
| 4.55699e-08 | 0 |
| 4.42264e-08 | 0 |
| 4.29225e-08 | 0 |
| 4.1657e-08 | 0 |
| 4.04288e-08 | 0 |
| 3.92369e-08 | 0 |
| 3.80801e-08 | 0 |
| 3.69574e-08 | 0 |
| 3.58677e-08 | 0 |
| 3.48103e-08 | 0 |
| 3.3784e-08 | 0 |
| 3.27879e-08 | 0 |
| 3.18212e-08 | 0 |
| 3.0883e-08 | 0 |
| 2.99725e-08 | 0 |
| 2.90888e-08 | 0 |
| 2.82312e-08 | 0 |
| 2.73989e-08 | 0 |
| 2.65911e-08 | 0 |
| 2.58071e-08 | 0 |
| 2.50462e-08 | 0 |
| 2.43078e-08 | 0 |
| 2.35911e-08 | 0 |
| 2.28956e-08 | 0 |
| 2.22206e-08 | 0 |
| 2.15654e-08 | 0 |
| 2.09296e-08 | 0 |
| 2.03126e-08 | 0 |
| 1.97137e-08 | 0 |
| 1.91325e-08 | 0 |
| 1.85684e-08 | 0 |
| 1.8021e-08 | 0 |
| 1.74896e-08 | 0 |
| 1.6974e-08 | 0 |
| 1.64736e-08 | 0 |
| 1.59879e-08 | 0 |
| 1.55165e-08 | 0 |
| 1.5059e-08 | 0 |
| 1.4615e-08 | 0 |
| 1.41842e-08 | 0 |
| 1.3766e-08 | 0 |
| 1.33601e-08 | 0 |
| 1.29662e-08 | 0 |